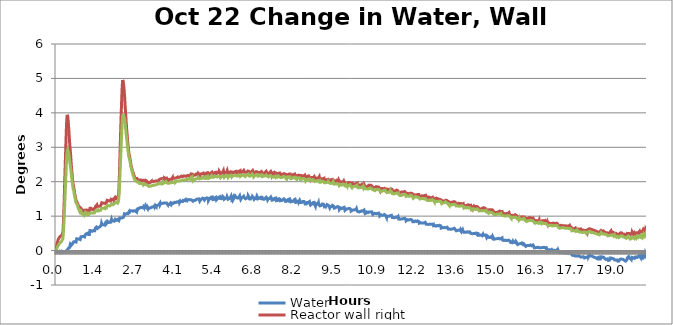
| Category | Water | Reactor wall right | Reactor wall left |
|---|---|---|---|
| 0.0015688980555555556 | 0 | 0 | 0 |
| 0.00782350138888889 | -0.005 | 0.065 | 0.011 |
| 0.014582213333333333 | -0.008 | 0.098 | 0.039 |
| 0.021356179999999975 | -0.013 | 0.163 | 0.031 |
| 0.02819274388888889 | -0.002 | 0.186 | 0.057 |
| 0.035027722222222224 | -0.028 | 0.219 | 0.075 |
| 0.041801709444444446 | -0.026 | 0.24 | 0.08 |
| 0.048545142500000006 | -0.026 | 0.24 | 0.111 |
| 0.05536494166666667 | -0.013 | 0.248 | 0.127 |
| 0.06215420833333333 | -0.019 | 0.29 | 0.132 |
| 0.06900455694444445 | -0.032 | 0.308 | 0.129 |
| 0.07573269305555556 | -0.031 | 0.326 | 0.147 |
| 0.08253722083333334 | -0.04 | 0.321 | 0.166 |
| 0.08931122805555555 | -0.035 | 0.337 | 0.155 |
| 0.09613239083333334 | -0.029 | 0.354 | 0.168 |
| 0.1029216488888889 | -0.011 | 0.368 | 0.171 |
| 0.10975673166666666 | -0.03 | 0.356 | 0.199 |
| 0.11651543166666667 | -0.021 | 0.363 | 0.191 |
| 0.12330468083333335 | -0.017 | 0.381 | 0.196 |
| 0.13009392916666668 | -0.02 | 0.383 | 0.215 |
| 0.13691374027777778 | -0.011 | 0.405 | 0.23 |
| 0.14376409777777777 | -0.015 | 0.386 | 0.243 |
| 0.15049225388888887 | -0.013 | 0.408 | 0.235 |
| 0.1572968027777775 | -0.029 | 0.412 | 0.233 |
| 0.16414852138888888 | -0.055 | 0.421 | 0.245 |
| 0.17093777444444444 | -0.034 | 0.435 | 0.235 |
| 0.17771176527777777 | -0.037 | 0.443 | 0.256 |
| 0.1844551841666664 | -0.042 | 0.441 | 0.256 |
| 0.19130553527777777 | -0.043 | 0.449 | 0.276 |
| 0.19807951694444417 | -0.025 | 0.443 | 0.287 |
| 0.2049146075 | -0.025 | 0.432 | 0.276 |
| 0.21167330194444442 | -0.035 | 0.471 | 0.302 |
| 0.21849310027777777 | -0.054 | 0.47 | 0.295 |
| 0.22525180277777776 | -0.044 | 0.497 | 0.313 |
| 0.23207299861111083 | -0.057 | 0.537 | 0.351 |
| 0.23890808166666666 | -0.062 | 0.601 | 0.4 |
| 0.24569733166666638 | -0.067 | 0.702 | 0.478 |
| 0.25245603694444446 | -0.049 | 0.854 | 0.589 |
| 0.2592605647222222 | -0.037 | 1.002 | 0.651 |
| 0.26609564138888886 | -0.039 | 1.181 | 0.774 |
| 0.2728696216666664 | -0.039 | 1.329 | 0.885 |
| 0.2796894411111111 | -0.049 | 1.534 | 1.026 |
| 0.28649396694444446 | -0.046 | 1.73 | 1.169 |
| 0.29328331416666664 | -0.049 | 1.944 | 1.301 |
| 0.30007385166666667 | -0.044 | 2.151 | 1.439 |
| 0.30686310527777777 | -0.028 | 2.348 | 1.59 |
| 0.3136676241666667 | -0.026 | 2.526 | 1.735 |
| 0.32050271027777777 | -0.033 | 2.71 | 1.878 |
| 0.32726142555555554 | -0.033 | 2.899 | 2.011 |
| 0.33406593888888886 | -0.041 | 3.085 | 2.151 |
| 0.3408857527777778 | -0.036 | 3.256 | 2.294 |
| 0.34762917444444447 | -0.008 | 3.434 | 2.449 |
| 0.35441843083333335 | -0.005 | 3.6 | 2.559 |
| 0.36126878972222226 | -0.005 | 3.736 | 2.684 |
| 0.3680288683333333 | -0.015 | 3.822 | 2.794 |
| 0.37483339777777774 | 0.016 | 3.896 | 2.835 |
| 0.3816379294444444 | 0.008 | 3.942 | 2.883 |
| 0.38841192611111114 | 0.021 | 3.924 | 2.909 |
| 0.3952317125 | 0.029 | 3.899 | 2.929 |
| 0.40195987027777774 | 0.036 | 3.868 | 2.934 |
| 0.4088102191666667 | 0.031 | 3.812 | 2.934 |
| 0.41561475194444447 | 0.041 | 3.738 | 2.904 |
| 0.422388725 | 0.072 | 3.677 | 2.858 |
| 0.4292085408333333 | 0.064 | 3.577 | 2.845 |
| 0.4359838988888889 | 0.054 | 3.498 | 2.809 |
| 0.44280370694444443 | 0.082 | 3.399 | 2.748 |
| 0.44957768388888886 | 0.082 | 3.312 | 2.717 |
| 0.45639748305555555 | 0.085 | 3.215 | 2.654 |
| 0.4631714613888889 | 0.09 | 3.126 | 2.626 |
| 0.46999126305555555 | 0.09 | 3.044 | 2.554 |
| 0.47676524111111107 | 0.142 | 3.002 | 2.54 |
| 0.4836003294444444 | 0.134 | 2.907 | 2.478 |
| 0.4903743013888889 | 0.19 | 2.849 | 2.456 |
| 0.49714827777777776 | 0.193 | 2.78 | 2.392 |
| 0.5039694702777778 | 0.2 | 2.683 | 2.349 |
| 0.5107740016666666 | 0.194 | 2.59 | 2.318 |
| 0.5175479813888889 | 0.178 | 2.507 | 2.244 |
| 0.5243372427777778 | 0.16 | 2.437 | 2.175 |
| 0.5311723083333333 | 0.181 | 2.374 | 2.134 |
| 0.5379768363888889 | 0.187 | 2.297 | 2.109 |
| 0.5447966475 | 0.158 | 2.239 | 2.045 |
| 0.5515706205555556 | 0.173 | 2.183 | 1.989 |
| 0.5583446075 | 0.165 | 2.089 | 1.956 |
| 0.5651338605555556 | 0.203 | 2.048 | 1.9 |
| 0.5719550447222223 | 0.183 | 1.999 | 1.854 |
| 0.5787595808333333 | 0.188 | 1.938 | 1.828 |
| 0.5855793852777778 | 0.217 | 1.912 | 1.777 |
| 0.5923228105555556 | 0.218 | 1.89 | 1.788 |
| 0.5991120758333334 | 0.254 | 1.856 | 1.75 |
| 0.6059318708333333 | 0.268 | 1.843 | 1.735 |
| 0.6127822222222222 | 0.26 | 1.781 | 1.689 |
| 0.6195561980555556 | 0.268 | 1.764 | 1.636 |
| 0.6263301805555556 | 0.265 | 1.725 | 1.625 |
| 0.6331347024999999 | 0.27 | 1.656 | 1.592 |
| 0.6399545183333333 | 0.26 | 1.646 | 1.562 |
| 0.6466993202777778 | 0.263 | 1.616 | 1.523 |
| 0.6535038536111111 | 0.26 | 1.577 | 1.49 |
| 0.6603389305555556 | 0.263 | 1.536 | 1.477 |
| 0.6671281891666667 | 0.273 | 1.529 | 1.421 |
| 0.6738716155555556 | 0.257 | 1.497 | 1.431 |
| 0.6806914233333334 | 0.248 | 1.458 | 1.391 |
| 0.6875112363888889 | 0.251 | 1.433 | 1.373 |
| 0.6943157755555556 | 0.307 | 1.485 | 1.397 |
| 0.7010897277777778 | 0.341 | 1.469 | 1.387 |
| 0.7078956550000001 | 0.325 | 1.436 | 1.364 |
| 0.7146696319444444 | 0.33 | 1.4 | 1.338 |
| 0.7215047113888888 | 0.335 | 1.413 | 1.336 |
| 0.7282787122222222 | 0.333 | 1.385 | 1.318 |
| 0.7350526725 | 0.343 | 1.364 | 1.3 |
| 0.7418724572222223 | 0.338 | 1.344 | 1.275 |
| 0.7486617244444445 | 0.335 | 1.336 | 1.254 |
| 0.7554509880555556 | 0.333 | 1.318 | 1.229 |
| 0.7622707813888889 | 0.33 | 1.303 | 1.216 |
| 0.7690447647222223 | 0.338 | 1.277 | 1.213 |
| 0.7758659566666667 | 0.351 | 1.265 | 1.201 |
| 0.7826399244444445 | 0.333 | 1.288 | 1.18 |
| 0.7894597311111111 | 0.328 | 1.255 | 1.162 |
| 0.7962795433333333 | 0.346 | 1.224 | 1.147 |
| 0.803022975 | 0.333 | 1.237 | 1.132 |
| 0.8097969466666667 | 0.312 | 1.217 | 1.134 |
| 0.8166778647222223 | 0.326 | 1.185 | 1.116 |
| 0.8234823705555555 | 0.32 | 1.197 | 1.119 |
| 0.8302563627777777 | 0.312 | 1.177 | 1.109 |
| 0.8370608897222223 | 0.364 | 1.211 | 1.138 |
| 0.8438654097222221 | 0.39 | 1.23 | 1.151 |
| 0.8506407724999999 | 0.401 | 1.233 | 1.135 |
| 0.8574147469444444 | 0.385 | 1.205 | 1.13 |
| 0.8642040255555556 | 0.403 | 1.22 | 1.12 |
| 0.8710544063888889 | 0.413 | 1.2 | 1.128 |
| 0.8778894580555555 | 0.401 | 1.215 | 1.11 |
| 0.884648166388889 | 0.388 | 1.179 | 1.064 |
| 0.8914221302777778 | 0.406 | 1.174 | 1.074 |
| 0.8982572041666667 | 0.398 | 1.177 | 1.092 |
| 0.9050311852777778 | 0.39 | 1.177 | 1.087 |
| 0.9118357147222222 | 0.395 | 1.177 | 1.082 |
| 0.9186110891666667 | 0.413 | 1.169 | 1.067 |
| 0.9253850527777778 | 0.395 | 1.161 | 1.061 |
| 0.9322048619444445 | 0.408 | 1.161 | 1.056 |
| 0.9389635783333333 | 0.403 | 1.146 | 1.056 |
| 0.9457833697222222 | 0.385 | 1.158 | 1.054 |
| 0.95260321 | 0.399 | 1.145 | 1.049 |
| 0.9594382613888889 | 0.394 | 1.124 | 1.023 |
| 0.9661816813888889 | 0.386 | 1.138 | 1.044 |
| 0.9730167616666666 | 0.395 | 1.152 | 1.044 |
| 0.9797907330555555 | 0.397 | 1.135 | 1.057 |
| 0.9865660986111111 | 0.407 | 1.14 | 1.057 |
| 0.9933859147222222 | 0.455 | 1.174 | 1.075 |
| 1.0007695252777777 | 0.473 | 1.183 | 1.099 |
| 1.0069796880555555 | 0.484 | 1.196 | 1.088 |
| 1.0137536694444444 | 0.478 | 1.193 | 1.088 |
| 1.0205276491666666 | 0.484 | 1.198 | 1.081 |
| 1.027316919722222 | 0.476 | 1.173 | 1.063 |
| 1.0341214355555555 | 0.489 | 1.181 | 1.073 |
| 1.0409412422222222 | 0.484 | 1.168 | 1.063 |
| 1.0477915833333333 | 0.478 | 1.181 | 1.05 |
| 1.054536411111111 | 0.478 | 1.181 | 1.07 |
| 1.0613714819444444 | 0.478 | 1.186 | 1.04 |
| 1.0681454594444444 | 0.499 | 1.163 | 1.081 |
| 1.0749958227777778 | 0.504 | 1.168 | 1.04 |
| 1.0817850691666666 | 0.492 | 1.166 | 1.035 |
| 1.0885743252777778 | 0.49 | 1.143 | 1.063 |
| 1.095348306388889 | 0.47 | 1.169 | 1.063 |
| 1.1021528366666666 | 0.458 | 1.159 | 1.042 |
| 1.1089268027777777 | 0.454 | 1.129 | 1.037 |
| 1.1157021827777778 | 0.471 | 1.157 | 1.047 |
| 1.1225219744444443 | 0.456 | 1.137 | 1.042 |
| 1.129341791388889 | 0.477 | 1.15 | 1.022 |
| 1.1361157586111112 | 0.469 | 1.15 | 1.035 |
| 1.142905021388889 | 0.487 | 1.172 | 1.053 |
| 1.1496790024999972 | 0.538 | 1.193 | 1.077 |
| 1.1564682569444444 | 0.582 | 1.228 | 1.105 |
| 1.1633033247222222 | 0.572 | 1.215 | 1.102 |
| 1.1700773027777778 | 0.572 | 1.223 | 1.1 |
| 1.1769276594444444 | 0.572 | 1.212 | 1.097 |
| 1.1837169147222222 | 0.572 | 1.23 | 1.102 |
| 1.1905228266666668 | 0.556 | 1.228 | 1.097 |
| 1.1972968138888862 | 0.577 | 1.228 | 1.09 |
| 1.2040555141666667 | 0.584 | 1.21 | 1.113 |
| 1.2108447916666667 | 0.592 | 1.21 | 1.095 |
| 1.217679843888889 | 0.583 | 1.206 | 1.1 |
| 1.224484366388889 | 0.571 | 1.217 | 1.09 |
| 1.231319474722222 | 0.567 | 1.198 | 1.09 |
| 1.2381087097222223 | 0.56 | 1.207 | 1.097 |
| 1.24489797 | 0.554 | 1.199 | 1.095 |
| 1.2516719377777752 | 0.562 | 1.199 | 1.092 |
| 1.2584473013888888 | 0.565 | 1.202 | 1.082 |
| 1.265236555 | 0.557 | 1.217 | 1.1 |
| 1.2720869191666666 | 0.554 | 1.187 | 1.09 |
| 1.2788608852777779 | 0.582 | 1.205 | 1.087 |
| 1.2856654252777777 | 0.56 | 1.202 | 1.077 |
| 1.2924393972222221 | 0.562 | 1.217 | 1.095 |
| 1.2992286588888888 | 0.572 | 1.202 | 1.095 |
| 1.3060790072222221 | 0.56 | 1.194 | 1.097 |
| 1.3128529816666665 | 0.58 | 1.197 | 1.095 |
| 1.3196422438888888 | 0.577 | 1.212 | 1.087 |
| 1.3264634291666668 | 0.575 | 1.215 | 1.102 |
| 1.3332374180555555 | 0.598 | 1.232 | 1.095 |
| 1.3400266677777777 | 0.654 | 1.25 | 1.147 |
| 1.3468159219444444 | 0.644 | 1.281 | 1.142 |
| 1.3536204777777752 | 0.673 | 1.291 | 1.157 |
| 1.360424986111111 | 0.672 | 1.303 | 1.173 |
| 1.3672295063888888 | 0.667 | 1.295 | 1.165 |
| 1.374003474722222 | 0.677 | 1.295 | 1.147 |
| 1.3808538380555557 | 0.684 | 1.304 | 1.155 |
| 1.3876583636111084 | 0.67 | 1.322 | 1.16 |
| 1.3944642833333334 | 0.678 | 1.281 | 1.155 |
| 1.4012382591666668 | 0.655 | 1.293 | 1.155 |
| 1.408012251111111 | 0.665 | 1.293 | 1.168 |
| 1.4148344780555555 | 0.645 | 1.287 | 1.152 |
| 1.4216212966666666 | 0.663 | 1.295 | 1.18 |
| 1.4284258255555555 | 0.65 | 1.303 | 1.157 |
| 1.4351998099999999 | 0.665 | 1.285 | 1.15 |
| 1.4420043347222196 | 0.668 | 1.313 | 1.168 |
| 1.4487783447222222 | 0.668 | 1.282 | 1.157 |
| 1.4555536699999974 | 0.673 | 1.287 | 1.168 |
| 1.4624193044444445 | 0.66 | 1.3 | 1.17 |
| 1.4691780169444446 | 0.66 | 1.3 | 1.16 |
| 1.4760283608333333 | 0.691 | 1.285 | 1.157 |
| 1.482756513888886 | 0.676 | 1.28 | 1.183 |
| 1.4895763208333335 | 0.673 | 1.298 | 1.168 |
| 1.49636558 | 0.691 | 1.29 | 1.175 |
| 1.503170106388889 | 0.673 | 1.31 | 1.147 |
| 1.5099441594444418 | 0.688 | 1.29 | 1.157 |
| 1.5168097049999973 | 0.671 | 1.29 | 1.168 |
| 1.523583688888889 | 0.678 | 1.305 | 1.152 |
| 1.5303896222222195 | 0.707 | 1.322 | 1.199 |
| 1.5371483013888887 | 0.734 | 1.337 | 1.189 |
| 1.5439375638888888 | 0.761 | 1.359 | 1.23 |
| 1.550772642222222 | 0.796 | 1.381 | 1.235 |
| 1.5575771747222222 | 0.789 | 1.389 | 1.23 |
| 1.564351153611111 | 0.771 | 1.401 | 1.228 |
| 1.571125123611111 | 0.749 | 1.372 | 1.235 |
| 1.5779143736111083 | 0.768 | 1.372 | 1.23 |
| 1.5847647394444417 | 0.759 | 1.365 | 1.225 |
| 1.5914942797222196 | 0.764 | 1.37 | 1.238 |
| 1.5982987994444418 | 0.761 | 1.373 | 1.24 |
| 1.6051186175 | 0.771 | 1.391 | 1.248 |
| 1.6119078608333333 | 0.753 | 1.376 | 1.228 |
| 1.6187582363888888 | 0.764 | 1.363 | 1.22 |
| 1.6254558280555553 | 0.761 | 1.37 | 1.233 |
| 1.6323367380555556 | 0.761 | 1.373 | 1.23 |
| 1.6391107030555556 | 0.764 | 1.383 | 1.238 |
| 1.6458999597222221 | 0.743 | 1.386 | 1.24 |
| 1.6527350522222224 | 0.746 | 1.368 | 1.243 |
| 1.6595395669444444 | 0.761 | 1.373 | 1.24 |
| 1.666314932777775 | 0.746 | 1.37 | 1.22 |
| 1.6730889033333307 | 0.782 | 1.383 | 1.23 |
| 1.679862885 | 0.769 | 1.368 | 1.256 |
| 1.6866979702777778 | 0.751 | 1.393 | 1.253 |
| 1.6934719411111083 | 0.776 | 1.376 | 1.256 |
| 1.7003528541666666 | 0.761 | 1.386 | 1.251 |
| 1.7070810069444444 | 0.759 | 1.381 | 1.24 |
| 1.713931355 | 0.77 | 1.385 | 1.248 |
| 1.7207053402777779 | 0.783 | 1.395 | 1.243 |
| 1.7275098711111083 | 0.819 | 1.425 | 1.267 |
| 1.7342852333333334 | 0.828 | 1.429 | 1.28 |
| 1.7410592077777751 | 0.841 | 1.46 | 1.285 |
| 1.7478637358333307 | 0.851 | 1.473 | 1.295 |
| 1.7546377144444445 | 0.832 | 1.452 | 1.311 |
| 1.7614422413888888 | 0.831 | 1.456 | 1.3 |
| 1.7682467791666667 | 0.829 | 1.443 | 1.29 |
| 1.7750360263888887 | 0.831 | 1.451 | 1.298 |
| 1.7818863780555554 | 0.831 | 1.451 | 1.305 |
| 1.7886757355555556 | 0.816 | 1.453 | 1.298 |
| 1.7954954569444446 | 0.834 | 1.451 | 1.305 |
| 1.8022709058333306 | 0.826 | 1.443 | 1.316 |
| 1.8090295291666667 | 0.819 | 1.453 | 1.305 |
| 1.8158034922222221 | 0.816 | 1.438 | 1.29 |
| 1.8226232841666665 | 0.824 | 1.441 | 1.293 |
| 1.8294889358333333 | 0.821 | 1.438 | 1.311 |
| 1.8362170794444417 | 0.813 | 1.441 | 1.295 |
| 1.8431132527777776 | 0.821 | 1.441 | 1.295 |
| 1.8498566891666666 | 0.824 | 1.436 | 1.3 |
| 1.8566306583333332 | 0.826 | 1.448 | 1.28 |
| 1.863404638888889 | 0.824 | 1.441 | 1.305 |
| 1.870241106111111 | 0.825 | 1.44 | 1.303 |
| 1.8770150858333332 | 0.878 | 1.49 | 1.329 |
| 1.8838348908333307 | 0.875 | 1.497 | 1.358 |
| 1.8906088780555557 | 0.911 | 1.511 | 1.353 |
| 1.8974134091666666 | 0.899 | 1.503 | 1.363 |
| 1.9042179269444444 | 0.871 | 1.507 | 1.348 |
| 1.9110224883333333 | 0.866 | 1.483 | 1.366 |
| 1.9177658941666667 | 0.873 | 1.478 | 1.35 |
| 1.9245704202777778 | 0.881 | 1.49 | 1.376 |
| 1.9314054911111112 | 0.861 | 1.49 | 1.355 |
| 1.9381808530555558 | 0.858 | 1.496 | 1.335 |
| 1.9449701169444442 | 0.863 | 1.478 | 1.343 |
| 1.9517746413888888 | 0.879 | 1.485 | 1.355 |
| 1.9585486247222221 | 0.873 | 1.501 | 1.35 |
| 1.9653989730555557 | 0.851 | 1.483 | 1.343 |
| 1.972172948611111 | 0.856 | 1.468 | 1.355 |
| 1.978977531111111 | 0.851 | 1.498 | 1.355 |
| 1.9857972797222223 | 0.853 | 1.475 | 1.345 |
| 1.9926018249999973 | 0.843 | 1.493 | 1.337 |
| 1.999391066111111 | 0.851 | 1.48 | 1.335 |
| 2.0061969919444445 | 0.844 | 1.477 | 1.34 |
| 2.0130015186111083 | 0.874 | 1.51 | 1.369 |
| 2.0197602119444444 | 0.909 | 1.549 | 1.392 |
| 2.026534192777775 | 0.923 | 1.538 | 1.413 |
| 2.0333387283333306 | 0.927 | 1.548 | 1.398 |
| 2.0400821525 | 0.916 | 1.547 | 1.4 |
| 2.046963056666667 | 0.908 | 1.533 | 1.408 |
| 2.0537370325 | 0.908 | 1.512 | 1.387 |
| 2.0605415774999973 | 0.88 | 1.525 | 1.408 |
| 2.067346096111111 | 0.895 | 1.538 | 1.398 |
| 2.0741367519444442 | 0.9 | 1.53 | 1.4 |
| 2.080895486388889 | 0.9 | 1.528 | 1.398 |
| 2.0877305169444416 | 0.908 | 1.528 | 1.41 |
| 2.0945350419444417 | 0.877 | 1.535 | 1.385 |
| 2.1013395780555526 | 0.903 | 1.515 | 1.38 |
| 2.1081135605555557 | 0.885 | 1.522 | 1.387 |
| 2.1149333536111112 | 0.882 | 1.52 | 1.392 |
| 2.1216920594444444 | 0.885 | 1.543 | 1.413 |
| 2.1285118699999974 | 0.885 | 1.612 | 1.436 |
| 2.135331668055553 | 0.885 | 1.653 | 1.477 |
| 2.142091763611111 | 0.872 | 1.77 | 1.553 |
| 2.1489268397222197 | 0.872 | 1.882 | 1.617 |
| 2.1557313674999974 | 0.88 | 2.053 | 1.709 |
| 2.162520618611111 | 0.87 | 2.227 | 1.831 |
| 2.169309871388886 | 0.947 | 2.442 | 1.988 |
| 2.1760991402777776 | 0.931 | 2.637 | 2.108 |
| 2.182888400555553 | 0.948 | 2.834 | 2.271 |
| 2.1897081808333336 | 0.941 | 3.048 | 2.407 |
| 2.19645162 | 0.942 | 3.241 | 2.545 |
| 2.203378344722222 | 0.953 | 3.438 | 2.675 |
| 2.2101231575 | 0.942 | 3.629 | 2.818 |
| 2.2168665880555554 | 0.932 | 3.82 | 2.95 |
| 2.223686393611111 | 0.958 | 4.014 | 3.116 |
| 2.2304603730555557 | 0.948 | 4.172 | 3.218 |
| 2.237295446944444 | 0.937 | 4.338 | 3.369 |
| 2.2440541599999975 | 0.937 | 4.491 | 3.496 |
| 2.2508434116666667 | 0.95 | 4.66 | 3.626 |
| 2.2576326769444446 | 0.948 | 4.787 | 3.728 |
| 2.2644524605555554 | 0.965 | 4.864 | 3.82 |
| 2.2712722724999974 | 0.948 | 4.951 | 3.892 |
| 2.2781073491666666 | 0.965 | 4.94 | 3.922 |
| 2.2848827238888862 | 0.958 | 4.958 | 3.961 |
| 2.2916108594444444 | 0.963 | 4.91 | 3.963 |
| 2.2984459411111082 | 0.991 | 4.882 | 3.943 |
| 2.3052657436111113 | 0.965 | 4.823 | 3.945 |
| 2.312039726111111 | 0.99 | 4.766 | 3.9 |
| 2.318844263888889 | 1.005 | 4.697 | 3.887 |
| 2.325618239166667 | 1.038 | 4.637 | 3.88 |
| 2.3324380444444417 | 1.069 | 4.537 | 3.85 |
| 2.339212034444442 | 1.054 | 4.472 | 3.824 |
| 2.3460179283333336 | 1.059 | 4.36 | 3.758 |
| 2.352791915 | 1.048 | 4.268 | 3.712 |
| 2.3596270833333306 | 1.054 | 4.153 | 3.653 |
| 2.3664926261111114 | 1.064 | 4.087 | 3.597 |
| 2.3732207741666667 | 1.059 | 3.982 | 3.544 |
| 2.3799947711111082 | 1.064 | 3.893 | 3.498 |
| 2.386768728888889 | 1.069 | 3.794 | 3.431 |
| 2.3936038063888887 | 1.074 | 3.704 | 3.373 |
| 2.400408333888889 | 1.071 | 3.651 | 3.345 |
| 2.407182312777775 | 1.061 | 3.538 | 3.26 |
| 2.4140035125 | 1.074 | 3.475 | 3.22 |
| 2.420777488611111 | 1.074 | 3.416 | 3.174 |
| 2.427582009166664 | 1.076 | 3.339 | 3.094 |
| 2.4343712655555554 | 1.071 | 3.27 | 3.046 |
| 2.441221621388889 | 1.071 | 3.191 | 3.008 |
| 2.4479956958333333 | 1.071 | 3.138 | 2.957 |
| 2.4548001372222195 | 1.069 | 3.077 | 2.901 |
| 2.4615588380555526 | 1.092 | 3.023 | 2.883 |
| 2.468409192222222 | 1.093 | 2.972 | 2.814 |
| 2.4751984480555556 | 1.089 | 2.904 | 2.763 |
| 2.481943261666664 | 1.11 | 2.877 | 2.763 |
| 2.4887630644444445 | 1.077 | 2.809 | 2.717 |
| 2.495537052222222 | 1.105 | 2.8 | 2.697 |
| 2.5023721227777775 | 1.138 | 2.781 | 2.67 |
| 2.509161376388886 | 1.147 | 2.744 | 2.66 |
| 2.5159353488888887 | 1.137 | 2.71 | 2.624 |
| 2.522770432499997 | 1.165 | 2.662 | 2.588 |
| 2.5295749761111086 | 1.144 | 2.639 | 2.552 |
| 2.536333667222219 | 1.152 | 2.606 | 2.519 |
| 2.543107653888889 | 1.154 | 2.568 | 2.481 |
| 2.5499732863888886 | 1.152 | 2.524 | 2.445 |
| 2.5567333602777778 | 1.167 | 2.504 | 2.448 |
| 2.5635684433333306 | 1.139 | 2.455 | 2.42 |
| 2.5703424261111083 | 1.139 | 2.455 | 2.379 |
| 2.5771316825 | 1.159 | 2.417 | 2.348 |
| 2.5839056605555557 | 1.154 | 2.384 | 2.328 |
| 2.590710195277778 | 1.162 | 2.358 | 2.315 |
| 2.597484158888886 | 1.165 | 2.34 | 2.284 |
| 2.604319243055553 | 1.159 | 2.317 | 2.261 |
| 2.611108494722222 | 1.142 | 2.3 | 2.249 |
| 2.6179588394444444 | 1.147 | 2.277 | 2.218 |
| 2.6247189358333336 | 1.144 | 2.287 | 2.21 |
| 2.6315234697222194 | 1.147 | 2.264 | 2.177 |
| 2.6382975405555555 | 1.142 | 2.236 | 2.185 |
| 2.6450714269444418 | 1.159 | 2.208 | 2.152 |
| 2.651891222777775 | 1.159 | 2.215 | 2.142 |
| 2.658711029166664 | 1.144 | 2.208 | 2.126 |
| 2.6655003002777775 | 1.157 | 2.182 | 2.093 |
| 2.672274261111111 | 1.167 | 2.159 | 2.088 |
| 2.679094068888889 | 1.159 | 2.144 | 2.093 |
| 2.6858541622222196 | 1.165 | 2.121 | 2.078 |
| 2.6927197855555556 | 1.152 | 2.134 | 2.05 |
| 2.6994937691666667 | 1.158 | 2.108 | 2.047 |
| 2.706252467777775 | 1.148 | 2.094 | 2.047 |
| 2.7131028269444446 | 1.141 | 2.08 | 2.022 |
| 2.7198768141666667 | 1.153 | 2.076 | 2.032 |
| 2.726681423611111 | 1.128 | 2.091 | 2.017 |
| 2.733455307222222 | 1.163 | 2.07 | 2.022 |
| 2.7402140147222194 | 1.133 | 2.058 | 2.004 |
| 2.747049093888886 | 1.121 | 2.066 | 1.999 |
| 2.7538702847222223 | 1.192 | 2.092 | 2.015 |
| 2.760674812777778 | 1.176 | 2.072 | 1.997 |
| 2.7674487980555527 | 1.145 | 2.055 | 1.991 |
| 2.7742227755555557 | 1.216 | 2.08 | 1.997 |
| 2.7810273038888886 | 1.182 | 2.059 | 1.999 |
| 2.787862385 | 1.211 | 2.057 | 2.005 |
| 2.7946363566666665 | 1.219 | 2.077 | 1.995 |
| 2.8014103400000003 | 1.206 | 2.062 | 1.982 |
| 2.808260693888889 | 1.217 | 2.056 | 1.992 |
| 2.815034676666667 | 1.227 | 2.076 | 1.99 |
| 2.821869751111111 | 1.237 | 2.069 | 1.982 |
| 2.8286146311111113 | 1.24 | 2.071 | 1.982 |
| 2.8353885463888893 | 1.226 | 2.064 | 1.964 |
| 2.842254164444445 | 1.21 | 2.046 | 1.951 |
| 2.84902815 | 1.238 | 2.038 | 1.946 |
| 2.8558174016666666 | 1.24 | 2.046 | 1.957 |
| 2.8626830386111113 | 1.225 | 2.038 | 1.967 |
| 2.869426457222222 | 1.24 | 2.051 | 1.957 |
| 2.8762004411111115 | 1.25 | 2.048 | 1.949 |
| 2.8830507944444443 | 1.242 | 2.043 | 1.954 |
| 2.8898247772222225 | 1.248 | 2.051 | 1.934 |
| 2.896630694166667 | 1.25 | 2.041 | 1.951 |
| 2.9034046725000002 | 1.235 | 2.041 | 1.941 |
| 2.910193925833333 | 1.25 | 2.048 | 1.929 |
| 2.9169679841666665 | 1.253 | 2.038 | 1.931 |
| 2.9237877052777774 | 1.253 | 2.036 | 1.939 |
| 2.9305616825 | 1.255 | 2.023 | 1.939 |
| 2.9373662141666665 | 1.265 | 2.036 | 1.954 |
| 2.944216556666667 | 1.273 | 2.033 | 1.951 |
| 2.9509905575 | 1.253 | 2.025 | 1.941 |
| 2.9577950730555553 | 1.242 | 2.025 | 1.934 |
| 2.96461626 | 1.263 | 2.028 | 1.939 |
| 2.9713749830555556 | 1.255 | 2.043 | 1.941 |
| 2.9781336683333333 | 1.253 | 2.041 | 1.908 |
| 2.9849840461111112 | 1.278 | 2.025 | 1.929 |
| 2.991758006111111 | 1.268 | 2.028 | 1.921 |
| 2.998562535277778 | 1.278 | 2.031 | 1.921 |
| 3.0053976152777775 | 1.248 | 2.046 | 1.921 |
| 3.0121410324999998 | 1.278 | 2.038 | 1.941 |
| 3.018930319722222 | 1.291 | 2.025 | 1.929 |
| 3.0257654016666664 | 1.263 | 2.025 | 1.921 |
| 3.032510188888889 | 1.271 | 2.013 | 1.923 |
| 3.0393300033333333 | 1.251 | 2.007 | 1.923 |
| 3.0461192419444445 | 1.278 | 2.008 | 1.923 |
| 3.0528932216666664 | 1.264 | 2.02 | 1.918 |
| 3.0597435902777774 | 1.294 | 2.038 | 1.921 |
| 3.066532839166667 | 1.291 | 2.033 | 1.923 |
| 3.073306818888889 | 1.301 | 2.036 | 1.908 |
| 3.080126616388889 | 1.264 | 2.035 | 1.916 |
| 3.086931140555556 | 1.275 | 2.024 | 1.931 |
| 3.0937065091666667 | 1.265 | 2.029 | 1.905 |
| 3.100511035833333 | 1.275 | 2.016 | 1.908 |
| 3.1073155722222223 | 1.243 | 1.988 | 1.879 |
| 3.114150643611111 | 1.262 | 2.003 | 1.892 |
| 3.1209246330555556 | 1.217 | 1.973 | 1.887 |
| 3.127698605833333 | 1.253 | 2.011 | 1.89 |
| 3.1345031380555555 | 1.266 | 2 | 1.895 |
| 3.1412771108333337 | 1.228 | 1.977 | 1.887 |
| 3.1481274947222224 | 1.235 | 2.001 | 1.887 |
| 3.154901448888889 | 1.213 | 1.974 | 1.879 |
| 3.161705996666667 | 1.22 | 1.982 | 1.874 |
| 3.1684813369444442 | 1.218 | 1.974 | 1.863 |
| 3.1752553316666665 | 1.218 | 1.982 | 1.871 |
| 3.182059845 | 1.233 | 1.964 | 1.881 |
| 3.1888949216666664 | 1.223 | 1.964 | 1.869 |
| 3.195668917222222 | 1.236 | 1.982 | 1.879 |
| 3.202412330277778 | 1.238 | 1.972 | 1.876 |
| 3.2092474141666667 | 1.236 | 1.984 | 1.871 |
| 3.2160824988888885 | 1.233 | 1.984 | 1.889 |
| 3.2228717405555556 | 1.23 | 1.982 | 1.886 |
| 3.2296471077777777 | 1.246 | 1.989 | 1.866 |
| 3.2364516397222225 | 1.246 | 1.984 | 1.884 |
| 3.2432561672222224 | 1.243 | 2 | 1.891 |
| 3.250014882222222 | 1.243 | 2.002 | 1.874 |
| 3.2568194002777777 | 1.253 | 2.012 | 1.884 |
| 3.263654486111111 | 1.243 | 1.974 | 1.881 |
| 3.270428454444444 | 1.256 | 1.969 | 1.897 |
| 3.2772177105555556 | 1.264 | 2.007 | 1.881 |
| 3.284052798611111 | 1.258 | 1.989 | 1.894 |
| 3.2908115158333335 | 1.266 | 1.989 | 1.894 |
| 3.297646571111111 | 1.261 | 2.002 | 1.886 |
| 3.3044372161111113 | 1.266 | 1.997 | 1.891 |
| 3.3112111919444445 | 1.258 | 1.989 | 1.889 |
| 3.3180310083333335 | 1.269 | 2.002 | 1.891 |
| 3.3248049975 | 1.284 | 1.989 | 1.889 |
| 3.3316400600000002 | 1.261 | 2.002 | 1.897 |
| 3.3384904213888893 | 1.264 | 1.997 | 1.899 |
| 3.345218567222222 | 1.258 | 2.01 | 1.899 |
| 3.3520383625 | 1.299 | 1.992 | 1.891 |
| 3.358797070277778 | 1.271 | 2.015 | 1.914 |
| 3.365572445277778 | 1.269 | 2.017 | 1.904 |
| 3.3724075269444445 | 1.279 | 2.017 | 1.902 |
| 3.379227323333333 | 1.289 | 2.005 | 1.92 |
| 3.385955478611111 | 1.31 | 2.005 | 1.894 |
| 3.392775281388889 | 1.289 | 2.023 | 1.899 |
| 3.3996103505555553 | 1.299 | 2.02 | 1.92 |
| 3.4063843269444445 | 1.294 | 2.012 | 1.889 |
| 3.413158314722222 | 1.281 | 2.005 | 1.914 |
| 3.4200086669444443 | 1.274 | 2.02 | 1.922 |
| 3.4268132397222226 | 1.31 | 2.015 | 1.927 |
| 3.4335871680555554 | 1.317 | 2.035 | 1.932 |
| 3.4403625513888887 | 1.287 | 2.025 | 1.912 |
| 3.4471365172222224 | 1.315 | 2.005 | 1.907 |
| 3.453941049166666 | 1.304 | 2.01 | 1.922 |
| 3.460760858333333 | 1.315 | 2.03 | 1.909 |
| 3.4675653816666667 | 1.315 | 2.028 | 1.92 |
| 3.4743546408333335 | 1.326 | 2.042 | 1.927 |
| 3.481143890833333 | 1.322 | 2.023 | 1.953 |
| 3.4879178708333334 | 1.344 | 2.035 | 1.95 |
| 3.4947529555555557 | 1.328 | 2.039 | 1.943 |
| 3.501588036388889 | 1.33 | 2.047 | 1.925 |
| 3.508348116666667 | 1.331 | 2.041 | 1.932 |
| 3.5151831944444445 | 1.345 | 2.044 | 1.937 |
| 3.5219571769444444 | 1.339 | 2.064 | 1.945 |
| 3.5287311575 | 1.343 | 2.064 | 1.917 |
| 3.5355662330555555 | 1.355 | 2.073 | 1.925 |
| 3.5424013175000004 | 1.375 | 2.07 | 1.94 |
| 3.54914474 | 1.34 | 2.069 | 1.95 |
| 3.5559339963888887 | 1.351 | 2.07 | 1.95 |
| 3.5627385233333335 | 1.36 | 2.08 | 1.94 |
| 3.5695124977777777 | 1.378 | 2.067 | 1.958 |
| 3.576318428611111 | 1.364 | 2.073 | 1.953 |
| 3.5830618399999996 | 1.379 | 2.08 | 1.968 |
| 3.58992748 | 1.353 | 2.075 | 1.963 |
| 3.596716732777778 | 1.379 | 2.07 | 1.945 |
| 3.603551806111111 | 1.371 | 2.09 | 1.943 |
| 3.6103257911111113 | 1.369 | 2.073 | 1.96 |
| 3.6171303330555555 | 1.371 | 2.067 | 1.953 |
| 3.623904291666667 | 1.369 | 2.095 | 1.976 |
| 3.630647715277778 | 1.379 | 2.083 | 1.943 |
| 3.6375133497222225 | 1.384 | 2.078 | 1.958 |
| 3.6443192630555554 | 1.374 | 2.093 | 1.968 |
| 3.651123798333334 | 1.374 | 2.106 | 1.958 |
| 3.657897778611111 | 1.369 | 2.098 | 1.971 |
| 3.6646564844444445 | 1.387 | 2.098 | 1.963 |
| 3.671476275555556 | 1.371 | 2.09 | 1.958 |
| 3.678250265 | 1.376 | 2.108 | 1.971 |
| 3.685054791388889 | 1.384 | 2.073 | 1.971 |
| 3.691859323888889 | 1.384 | 2.116 | 1.976 |
| 3.698694398333333 | 1.371 | 2.103 | 1.981 |
| 3.705468395833333 | 1.384 | 2.095 | 1.978 |
| 3.7122437436111113 | 1.384 | 2.116 | 1.981 |
| 3.7190482697222222 | 1.376 | 2.108 | 1.988 |
| 3.725822245 | 1.389 | 2.09 | 1.978 |
| 3.7326573205555555 | 1.381 | 2.095 | 1.986 |
| 3.739431311111111 | 1.381 | 2.111 | 1.976 |
| 3.7462816652777775 | 1.397 | 2.106 | 1.976 |
| 3.753055647777778 | 1.399 | 2.108 | 2.006 |
| 3.759844895277778 | 1.381 | 2.121 | 1.996 |
| 3.766618866388889 | 1.381 | 2.118 | 1.991 |
| 3.7734081566666666 | 1.38 | 2.106 | 1.981 |
| 3.7802293116666665 | 1.373 | 2.086 | 1.965 |
| 3.7870185672222223 | 1.381 | 2.086 | 1.975 |
| 3.793823100277778 | 1.364 | 2.086 | 1.978 |
| 3.8005970855555558 | 1.377 | 2.083 | 1.952 |
| 3.8074474636111115 | 1.339 | 2.052 | 1.964 |
| 3.8142366825 | 1.379 | 2.088 | 1.972 |
| 3.8210106680555556 | 1.37 | 2.082 | 1.954 |
| 3.8277846452777777 | 1.354 | 2.055 | 1.952 |
| 3.8345891783333332 | 1.334 | 2.062 | 1.944 |
| 3.841393793611111 | 1.326 | 2.052 | 1.954 |
| 3.848214886944444 | 1.326 | 2.042 | 1.944 |
| 3.855004154444445 | 1.339 | 2.065 | 1.931 |
| 3.861778132777778 | 1.316 | 2.067 | 1.956 |
| 3.8685826597222226 | 1.334 | 2.062 | 1.939 |
| 3.8754177247222223 | 1.344 | 2.059 | 1.944 |
| 3.8821917158333332 | 1.352 | 2.067 | 1.974 |
| 3.8889656794444445 | 1.349 | 2.077 | 1.962 |
| 3.8958160463888887 | 1.354 | 2.062 | 1.949 |
| 3.9025900211111115 | 1.374 | 2.059 | 1.967 |
| 3.9093945544444444 | 1.352 | 2.075 | 1.962 |
| 3.9161699266666665 | 1.354 | 2.082 | 1.964 |
| 3.922959176388889 | 1.372 | 2.085 | 1.962 |
| 3.9297942497222222 | 1.334 | 2.067 | 1.982 |
| 3.9365376730555557 | 1.362 | 2.085 | 1.956 |
| 3.9433727616666667 | 1.357 | 2.08 | 1.977 |
| 3.9501467302777775 | 1.362 | 2.07 | 1.967 |
| 3.9569665366666666 | 1.357 | 2.093 | 1.974 |
| 3.9638474494444447 | 1.382 | 2.082 | 1.954 |
| 3.97059087 | 1.374 | 2.09 | 1.985 |
| 3.9773648538888886 | 1.377 | 2.113 | 1.977 |
| 3.9842152133333335 | 1.372 | 2.077 | 1.974 |
| 3.9909905752777775 | 1.367 | 2.116 | 1.992 |
| 3.997764551666667 | 1.387 | 2.1 | 1.979 |
| 4.004553811388889 | 1.372 | 2.103 | 1.977 |
| 4.011358331111111 | 1.38 | 2.093 | 1.992 |
| 4.018147593888889 | 1.387 | 2.121 | 1.987 |
| 4.024921558333333 | 1.382 | 2.108 | 1.99 |
| 4.031771928055556 | 1.377 | 2.1 | 1.987 |
| 4.038545898611111 | 1.395 | 2.103 | 2.005 |
| 4.0453504375 | 1.403 | 2.1 | 1.982 |
| 4.052125792777778 | 1.405 | 2.103 | 1.987 |
| 4.058915054444444 | 1.382 | 2.103 | 1.997 |
| 4.065689042222222 | 1.382 | 2.11 | 2.018 |
| 4.0726004811111105 | 1.392 | 2.108 | 1.985 |
| 4.0793744627777775 | 1.392 | 2.116 | 1.992 |
| 4.086102619166667 | 1.397 | 2.131 | 2.005 |
| 4.092876605833333 | 1.397 | 2.105 | 1.997 |
| 4.099681119722223 | 1.382 | 2.121 | 1.99 |
| 4.1064703683333335 | 1.39 | 2.113 | 2.013 |
| 4.113305452222222 | 1.415 | 2.113 | 2.02 |
| 4.1200808122222226 | 1.415 | 2.136 | 2.013 |
| 4.126931186388889 | 1.415 | 2.136 | 1.997 |
| 4.133705150277778 | 1.397 | 2.131 | 2.005 |
| 4.140540225833333 | 1.413 | 2.118 | 2.013 |
| 4.1472989516666665 | 1.403 | 2.133 | 2.005 |
| 4.154072907222222 | 1.392 | 2.139 | 2.023 |
| 4.160846886944444 | 1.413 | 2.131 | 2.023 |
| 4.167712525833333 | 1.405 | 2.118 | 2.03 |
| 4.174501773055556 | 1.415 | 2.133 | 2.013 |
| 4.181306311111111 | 1.4 | 2.139 | 2.007 |
| 4.188081668055556 | 1.413 | 2.136 | 2.01 |
| 4.194855642777778 | 1.41 | 2.126 | 2.02 |
| 4.201644905833334 | 1.428 | 2.141 | 2.043 |
| 4.208449437222222 | 1.436 | 2.133 | 2.038 |
| 4.2152234080555555 | 1.4 | 2.128 | 2.013 |
| 4.222058523055556 | 1.418 | 2.123 | 2.02 |
| 4.2288782919444445 | 1.42 | 2.144 | 2.03 |
| 4.235636984444445 | 1.433 | 2.139 | 2.018 |
| 4.242456799166667 | 1.423 | 2.149 | 2.038 |
| 4.249261327777778 | 1.426 | 2.151 | 2.018 |
| 4.256036689166667 | 1.423 | 2.131 | 2.036 |
| 4.262810671111111 | 1.413 | 2.146 | 2.025 |
| 4.269599926666666 | 1.436 | 2.149 | 2.03 |
| 4.276450292222222 | 1.423 | 2.162 | 2.041 |
| 4.2832548161111115 | 1.42 | 2.141 | 2.02 |
| 4.2900593575 | 1.428 | 2.164 | 2.036 |
| 4.296863867222222 | 1.443 | 2.146 | 2.033 |
| 4.303653137222222 | 1.431 | 2.149 | 2.038 |
| 4.310396643888889 | 1.433 | 2.139 | 2.025 |
| 4.317201081944445 | 1.426 | 2.146 | 2.048 |
| 4.3240375525 | 1.446 | 2.149 | 2.053 |
| 4.33081153 | 1.456 | 2.146 | 2.041 |
| 4.337585498611111 | 1.431 | 2.164 | 2.053 |
| 4.344405329444444 | 1.451 | 2.154 | 2.041 |
| 4.351225112222222 | 1.433 | 2.169 | 2.051 |
| 4.35802964 | 1.441 | 2.169 | 2.048 |
| 4.364834167222222 | 1.451 | 2.156 | 2.03 |
| 4.371608143333334 | 1.451 | 2.172 | 2.046 |
| 4.378382125277778 | 1.436 | 2.154 | 2.064 |
| 4.385217195555556 | 1.446 | 2.146 | 2.064 |
| 4.391977293888889 | 1.454 | 2.159 | 2.046 |
| 4.398797100555555 | 1.436 | 2.167 | 2.056 |
| 4.405571067777778 | 1.454 | 2.159 | 2.076 |
| 4.4123603325000005 | 1.479 | 2.169 | 2.053 |
| 4.419210681666667 | 1.448 | 2.141 | 2.069 |
| 4.425984669722222 | 1.443 | 2.151 | 2.064 |
| 4.432789200277778 | 1.451 | 2.156 | 2.064 |
| 4.439563171111112 | 1.454 | 2.156 | 2.061 |
| 4.446337150833333 | 1.454 | 2.172 | 2.059 |
| 4.453141692777778 | 1.466 | 2.162 | 2.043 |
| 4.459978140833334 | 1.441 | 2.162 | 2.069 |
| 4.466752126388889 | 1.471 | 2.167 | 2.051 |
| 4.4735261161111115 | 1.456 | 2.162 | 2.051 |
| 4.480315355555556 | 1.461 | 2.177 | 2.061 |
| 4.487165716111111 | 1.456 | 2.169 | 2.066 |
| 4.493909142222222 | 1.466 | 2.184 | 2.059 |
| 4.500759576388889 | 1.461 | 2.182 | 2.084 |
| 4.507564013888889 | 1.482 | 2.172 | 2.076 |
| 4.514338001944444 | 1.479 | 2.184 | 2.076 |
| 4.521127256111111 | 1.477 | 2.177 | 2.087 |
| 4.527917893055555 | 1.471 | 2.182 | 2.061 |
| 4.534661327777777 | 1.464 | 2.184 | 2.089 |
| 4.541557503888889 | 1.466 | 2.197 | 2.069 |
| 4.548331483888889 | 1.474 | 2.167 | 2.081 |
| 4.555105459166667 | 1.484 | 2.192 | 2.081 |
| 4.561925259444444 | 1.471 | 2.156 | 2.076 |
| 4.56869924888889 | 1.477 | 2.179 | 2.081 |
| 4.575519058055556 | 1.487 | 2.187 | 2.094 |
| 4.582293021111111 | 1.489 | 2.2 | 2.074 |
| 4.5891433827777774 | 1.479 | 2.202 | 2.094 |
| 4.595872917222222 | 1.492 | 2.192 | 2.115 |
| 4.602708008333334 | 1.479 | 2.192 | 2.094 |
| 4.609497251944444 | 1.464 | 2.228 | 2.081 |
| 4.6163017816666665 | 1.487 | 2.22 | 2.097 |
| 4.623075758333333 | 1.489 | 2.202 | 2.094 |
| 4.62988029 | 1.466 | 2.212 | 2.081 |
| 4.636684814444444 | 1.482 | 2.225 | 2.104 |
| 4.6434587913888885 | 1.487 | 2.234 | 2.12 |
| 4.650263320833333 | 1.479 | 2.221 | 2.079 |
| 4.657113676944444 | 1.467 | 2.198 | 2.073 |
| 4.6638432175 | 1.481 | 2.198 | 2.083 |
| 4.6706935725 | 1.432 | 2.165 | 2.032 |
| 4.677498102777778 | 1.455 | 2.153 | 2.057 |
| 4.684272083333333 | 1.457 | 2.158 | 2.057 |
| 4.691046069444444 | 1.445 | 2.163 | 2.052 |
| 4.6978200405555555 | 1.442 | 2.155 | 2.065 |
| 4.704685667222222 | 1.457 | 2.181 | 2.05 |
| 4.711459645000001 | 1.457 | 2.193 | 2.072 |
| 4.7182489033333335 | 1.439 | 2.183 | 2.065 |
| 4.725083974444444 | 1.457 | 2.188 | 2.047 |
| 4.7318593525 | 1.45 | 2.188 | 2.078 |
| 4.738648602777777 | 1.457 | 2.209 | 2.062 |
| 4.745422595 | 1.478 | 2.211 | 2.075 |
| 4.752257661388889 | 1.46 | 2.193 | 2.057 |
| 4.759092738333333 | 1.475 | 2.198 | 2.072 |
| 4.765836175 | 1.468 | 2.214 | 2.088 |
| 4.772610139444445 | 1.462 | 2.209 | 2.072 |
| 4.779475782777778 | 1.485 | 2.209 | 2.085 |
| 4.786173374722223 | 1.483 | 2.224 | 2.085 |
| 4.792977905833333 | 1.493 | 2.209 | 2.08 |
| 4.799814365555556 | 1.485 | 2.216 | 2.098 |
| 4.8065578 | 1.47 | 2.221 | 2.085 |
| 4.813392880277778 | 1.483 | 2.221 | 2.088 |
| 4.8202432363888885 | 1.498 | 2.229 | 2.093 |
| 4.827017209166667 | 1.473 | 2.216 | 2.103 |
| 4.833852294166666 | 1.496 | 2.237 | 2.101 |
| 4.8405957158333335 | 1.501 | 2.219 | 2.106 |
| 4.8474155252777775 | 1.491 | 2.252 | 2.131 |
| 4.854220054444444 | 1.475 | 2.227 | 2.118 |
| 4.8609787566666665 | 1.521 | 2.239 | 2.124 |
| 4.867829195833333 | 1.513 | 2.232 | 2.111 |
| 4.8745739186111114 | 1.5 | 2.227 | 2.11 |
| 4.881424375277778 | 1.5 | 2.222 | 2.108 |
| 4.888137162777777 | 1.466 | 2.2 | 2.084 |
| 4.8950180619444446 | 1.474 | 2.21 | 2.108 |
| 4.901776766388888 | 1.436 | 2.165 | 2.066 |
| 4.908627111666667 | 1.439 | 2.17 | 2.076 |
| 4.915401100555556 | 1.448 | 2.197 | 2.084 |
| 4.922175095277778 | 1.466 | 2.196 | 2.071 |
| 4.9289796175000005 | 1.476 | 2.205 | 2.089 |
| 4.935754990277777 | 1.489 | 2.202 | 2.086 |
| 4.942528974166667 | 1.492 | 2.223 | 2.094 |
| 4.949348759444445 | 1.487 | 2.228 | 2.102 |
| 4.956168564722223 | 1.482 | 2.215 | 2.076 |
| 4.962942547222222 | 1.492 | 2.223 | 2.104 |
| 4.969731851944444 | 1.492 | 2.23 | 2.097 |
| 4.976582151111112 | 1.497 | 2.228 | 2.102 |
| 4.98335613 | 1.492 | 2.23 | 2.107 |
| 4.990175925555556 | 1.505 | 2.23 | 2.099 |
| 4.9969499088888885 | 1.522 | 2.243 | 2.112 |
| 5.003725266388889 | 1.52 | 2.24 | 2.107 |
| 5.010545079722222 | 1.517 | 2.243 | 2.14 |
| 5.0172885075 | 1.515 | 2.243 | 2.122 |
| 5.024123579166666 | 1.522 | 2.256 | 2.12 |
| 5.030912834722223 | 1.51 | 2.251 | 2.14 |
| 5.0377173775 | 1.51 | 2.248 | 2.13 |
| 5.044506618055556 | 1.506 | 2.248 | 2.125 |
| 5.051356971111112 | 1.514 | 2.239 | 2.14 |
| 5.0581157177777785 | 1.496 | 2.232 | 2.134 |
| 5.0649354875000006 | 1.469 | 2.211 | 2.098 |
| 5.0716955775 | 1.455 | 2.21 | 2.095 |
| 5.07846956 | 1.461 | 2.212 | 2.098 |
| 5.085274076944445 | 1.461 | 2.207 | 2.108 |
| 5.092093893333333 | 1.471 | 2.202 | 2.106 |
| 5.098898406388889 | 1.482 | 2.216 | 2.088 |
| 5.1056723858333335 | 1.516 | 2.221 | 2.095 |
| 5.112476915833333 | 1.493 | 2.239 | 2.1 |
| 5.1192508991666665 | 1.488 | 2.244 | 2.098 |
| 5.126055430277778 | 1.513 | 2.237 | 2.111 |
| 5.132859964722222 | 1.511 | 2.254 | 2.141 |
| 5.139695033888889 | 1.513 | 2.244 | 2.139 |
| 5.146470406111112 | 1.531 | 2.265 | 2.128 |
| 5.153305485833333 | 1.531 | 2.249 | 2.141 |
| 5.160110103055556 | 1.521 | 2.257 | 2.131 |
| 5.166899261666666 | 1.516 | 2.26 | 2.116 |
| 5.173627407777778 | 1.526 | 2.262 | 2.162 |
| 5.180477773055555 | 1.534 | 2.252 | 2.149 |
| 5.187282303333333 | 1.522 | 2.282 | 2.149 |
| 5.194056272777778 | 1.552 | 2.277 | 2.159 |
| 5.2008608075 | 1.456 | 2.201 | 2.097 |
| 5.207620898055556 | 1.479 | 2.206 | 2.099 |
| 5.214455992222222 | 1.454 | 2.211 | 2.099 |
| 5.2212757736111115 | 1.464 | 2.213 | 2.117 |
| 5.2280497611111105 | 1.498 | 2.203 | 2.107 |
| 5.23483901 | 1.477 | 2.223 | 2.099 |
| 5.241658814166667 | 1.475 | 2.221 | 2.119 |
| 5.248417524444444 | 1.485 | 2.244 | 2.122 |
| 5.255328973888889 | 1.503 | 2.24 | 2.117 |
| 5.262057136388889 | 1.504 | 2.235 | 2.122 |
| 5.268831113055556 | 1.513 | 2.245 | 2.135 |
| 5.275650923611112 | 1.516 | 2.251 | 2.114 |
| 5.282395725 | 1.522 | 2.258 | 2.127 |
| 5.2892002725 | 1.548 | 2.263 | 2.125 |
| 5.296035331666666 | 1.538 | 2.263 | 2.148 |
| 5.302809312777778 | 1.535 | 2.268 | 2.155 |
| 5.309659667222222 | 1.568 | 2.266 | 2.17 |
| 5.316433644444444 | 1.548 | 2.276 | 2.168 |
| 5.323284002777778 | 1.543 | 2.304 | 2.163 |
| 5.3300427 | 1.557 | 2.278 | 2.137 |
| 5.336816704166666 | 1.527 | 2.272 | 2.152 |
| 5.343576775000001 | 1.5 | 2.212 | 2.128 |
| 5.3504271325 | 1.481 | 2.214 | 2.108 |
| 5.357201104166667 | 1.486 | 2.209 | 2.108 |
| 5.364036177222222 | 1.481 | 2.209 | 2.133 |
| 5.370794905277777 | 1.486 | 2.212 | 2.128 |
| 5.3775688775 | 1.496 | 2.243 | 2.113 |
| 5.384403945277778 | 1.491 | 2.217 | 2.133 |
| 5.391177931388889 | 1.486 | 2.232 | 2.139 |
| 5.3980130025 | 1.489 | 2.232 | 2.123 |
| 5.404756425277778 | 1.509 | 2.248 | 2.149 |
| 5.4115915125 | 1.527 | 2.259 | 2.151 |
| 5.418366878611111 | 1.532 | 2.267 | 2.131 |
| 5.425186687777778 | 1.548 | 2.267 | 2.151 |
| 5.431930118611111 | 1.547 | 2.275 | 2.146 |
| 5.438765241944444 | 1.554 | 2.28 | 2.151 |
| 5.445554448888889 | 1.544 | 2.287 | 2.154 |
| 5.452343702777778 | 1.547 | 2.264 | 2.149 |
| 5.459132945833334 | 1.565 | 2.275 | 2.169 |
| 5.465937476944445 | 1.524 | 2.27 | 2.158 |
| 5.4727572858333335 | 1.472 | 2.235 | 2.122 |
| 5.479561811666667 | 1.495 | 2.248 | 2.15 |
| 5.486352455277777 | 1.487 | 2.229 | 2.124 |
| 5.493126431388888 | 1.5 | 2.216 | 2.14 |
| 5.4999767791666665 | 1.49 | 2.244 | 2.122 |
| 5.506750758888889 | 1.495 | 2.231 | 2.135 |
| 5.513555298333333 | 1.508 | 2.251 | 2.117 |
| 5.520359813888889 | 1.492 | 2.244 | 2.135 |
| 5.527133890555556 | 1.505 | 2.277 | 2.145 |
| 5.533938327222222 | 1.487 | 2.254 | 2.158 |
| 5.540727583611111 | 1.505 | 2.259 | 2.15 |
| 5.547562668055556 | 1.513 | 2.26 | 2.163 |
| 5.554276929166667 | 1.552 | 2.284 | 2.155 |
| 5.561127278611111 | 1.554 | 2.25 | 2.16 |
| 5.567901253333333 | 1.566 | 2.294 | 2.175 |
| 5.574721062222222 | 1.553 | 2.284 | 2.158 |
| 5.581525603888888 | 1.561 | 2.296 | 2.17 |
| 5.588284296111111 | 1.558 | 2.296 | 2.186 |
| 5.595119375277777 | 1.567 | 2.296 | 2.178 |
| 5.601969724444444 | 1.514 | 2.265 | 2.147 |
| 5.608743708055556 | 1.506 | 2.232 | 2.113 |
| 5.6154871463888885 | 1.491 | 2.24 | 2.115 |
| 5.622323616111111 | 1.486 | 2.222 | 2.136 |
| 5.6290517597222225 | 1.514 | 2.232 | 2.136 |
| 5.6358715675 | 1.499 | 2.25 | 2.141 |
| 5.642691357222223 | 1.506 | 2.258 | 2.146 |
| 5.649465338611111 | 1.504 | 2.253 | 2.164 |
| 5.656300418055555 | 1.504 | 2.245 | 2.156 |
| 5.663089678055556 | 1.512 | 2.245 | 2.164 |
| 5.669878929166667 | 1.527 | 2.271 | 2.138 |
| 5.6766834575 | 1.519 | 2.273 | 2.164 |
| 5.683457436944444 | 1.528 | 2.269 | 2.169 |
| 5.690293899722222 | 1.555 | 2.286 | 2.164 |
| 5.697067875555555 | 1.562 | 2.295 | 2.174 |
| 5.703872404722222 | 1.569 | 2.29 | 2.164 |
| 5.7106464 | 1.587 | 2.323 | 2.189 |
| 5.7174509325 | 1.569 | 2.293 | 2.182 |
| 5.724224911111111 | 1.561 | 2.283 | 2.161 |
| 5.731075251944445 | 1.528 | 2.271 | 2.145 |
| 5.7378492380555555 | 1.492 | 2.234 | 2.127 |
| 5.744684328333334 | 1.48 | 2.236 | 2.124 |
| 5.7513971802777775 | 1.503 | 2.249 | 2.145 |
| 5.758218387777778 | 1.508 | 2.241 | 2.142 |
| 5.765038177499999 | 1.51 | 2.251 | 2.15 |
| 5.771857984444444 | 1.497 | 2.254 | 2.132 |
| 5.778631968333333 | 1.515 | 2.267 | 2.165 |
| 5.7854212205555555 | 1.508 | 2.259 | 2.152 |
| 5.7921952022222225 | 1.528 | 2.257 | 2.134 |
| 5.799030273333333 | 1.528 | 2.251 | 2.17 |
| 5.805804256944445 | 1.513 | 2.267 | 2.16 |
| 5.8126240594444445 | 1.528 | 2.266 | 2.178 |
| 5.8193827625 | 1.532 | 2.276 | 2.18 |
| 5.8262345133333335 | 1.528 | 2.287 | 2.196 |
| 5.833039032222222 | 1.566 | 2.289 | 2.173 |
| 5.839813010555556 | 1.561 | 2.322 | 2.18 |
| 5.846617539166667 | 1.568 | 2.299 | 2.191 |
| 5.853376248055555 | 1.578 | 2.307 | 2.191 |
| 5.86016551 | 1.549 | 2.255 | 2.162 |
| 5.867000575 | 1.491 | 2.237 | 2.123 |
| 5.873805118333333 | 1.494 | 2.232 | 2.138 |
| 5.8805943591666665 | 1.496 | 2.24 | 2.133 |
| 5.887308626111111 | 1.501 | 2.253 | 2.136 |
| 5.8941895325 | 1.511 | 2.232 | 2.156 |
| 5.900963532777777 | 1.506 | 2.23 | 2.141 |
| 5.907752795555555 | 1.511 | 2.25 | 2.156 |
| 5.914603111944444 | 1.527 | 2.273 | 2.161 |
| 5.92139237 | 1.522 | 2.276 | 2.148 |
| 5.92818162 | 1.527 | 2.268 | 2.161 |
| 5.934940318888889 | 1.537 | 2.26 | 2.182 |
| 5.941775410555556 | 1.529 | 2.281 | 2.169 |
| 5.948564660555555 | 1.54 | 2.288 | 2.179 |
| 5.9553233613888885 | 1.554 | 2.288 | 2.184 |
| 5.962144552777778 | 1.565 | 2.294 | 2.194 |
| 5.968933809444445 | 1.563 | 2.31 | 2.182 |
| 5.975738332222223 | 1.587 | 2.298 | 2.192 |
| 5.982512314999999 | 1.58 | 2.295 | 2.182 |
| 5.9893168575 | 1.546 | 2.276 | 2.173 |
| 5.996121377222223 | 1.495 | 2.241 | 2.137 |
| 6.002895396666666 | 1.503 | 2.236 | 2.162 |
| 6.009699881944444 | 1.5 | 2.256 | 2.155 |
| 6.016519682777778 | 1.508 | 2.241 | 2.157 |
| 6.0232936666666665 | 1.525 | 2.277 | 2.145 |
| 6.030084317777777 | 1.495 | 2.262 | 2.168 |
| 6.036904109444444 | 1.513 | 2.256 | 2.15 |
| 6.043678084722223 | 1.508 | 2.256 | 2.165 |
| 6.050482611111112 | 1.536 | 2.277 | 2.165 |
| 6.057317709444445 | 1.505 | 2.262 | 2.168 |
| 6.0640916874999995 | 1.515 | 2.267 | 2.17 |
| 6.070865679166666 | 1.531 | 2.287 | 2.18 |
| 6.0776396238888895 | 1.536 | 2.282 | 2.178 |
| 6.084551091388889 | 1.538 | 2.285 | 2.173 |
| 6.091279238333334 | 1.557 | 2.274 | 2.188 |
| 6.0980851575 | 1.558 | 2.291 | 2.191 |
| 6.104859125277778 | 1.544 | 2.292 | 2.201 |
| 6.1116483963888895 | 1.586 | 2.304 | 2.188 |
| 6.118483486111112 | 1.583 | 2.304 | 2.203 |
| 6.1252879927777775 | 1.589 | 2.296 | 2.196 |
| 6.132062056666667 | 1.582 | 2.301 | 2.193 |
| 6.138835945555556 | 1.567 | 2.317 | 2.198 |
| 6.145671023333334 | 1.588 | 2.302 | 2.19 |
| 6.152445014444444 | 1.54 | 2.275 | 2.169 |
| 6.159264813055556 | 1.521 | 2.253 | 2.164 |
| 6.166040182222222 | 1.511 | 2.268 | 2.169 |
| 6.1728447030555555 | 1.511 | 2.263 | 2.169 |
| 6.1796339638888895 | 1.511 | 2.253 | 2.166 |
| 6.186438578888889 | 1.534 | 2.281 | 2.159 |
| 6.1932430258333335 | 1.524 | 2.271 | 2.164 |
| 6.200016995277778 | 1.517 | 2.268 | 2.177 |
| 6.206836821111111 | 1.527 | 2.281 | 2.171 |
| 6.213595503333334 | 1.524 | 2.276 | 2.187 |
| 6.220400038055556 | 1.534 | 2.283 | 2.189 |
| 6.227250392222222 | 1.522 | 2.283 | 2.194 |
| 6.2340563025 | 1.532 | 2.283 | 2.187 |
| 6.240860834166667 | 1.537 | 2.302 | 2.179 |
| 6.2476195425 | 1.562 | 2.309 | 2.197 |
| 6.254408787222222 | 1.575 | 2.295 | 2.207 |
| 6.261213308333334 | 1.59 | 2.303 | 2.202 |
| 6.268109518055555 | 1.592 | 2.328 | 2.197 |
| 6.2747918275 | 1.582 | 2.331 | 2.217 |
| 6.281611642222222 | 1.585 | 2.321 | 2.205 |
| 6.2884008811111105 | 1.531 | 2.266 | 2.153 |
| 6.295174857222222 | 1.505 | 2.254 | 2.145 |
| 6.302026604722222 | 1.487 | 2.264 | 2.147 |
| 6.308785311944444 | 1.513 | 2.244 | 2.162 |
| 6.315635664444444 | 1.508 | 2.262 | 2.162 |
| 6.322424918333333 | 1.51 | 2.262 | 2.16 |
| 6.329198906111111 | 1.523 | 2.274 | 2.18 |
| 6.336018696111111 | 1.528 | 2.274 | 2.168 |
| 6.342777398333333 | 1.525 | 2.264 | 2.198 |
| 6.349566656666667 | 1.546 | 2.29 | 2.173 |
| 6.356386454444445 | 1.525 | 2.279 | 2.183 |
| 6.3631910241666665 | 1.533 | 2.287 | 2.193 |
| 6.369981633888889 | 1.546 | 2.292 | 2.193 |
| 6.376755608888889 | 1.538 | 2.285 | 2.173 |
| 6.383560132777778 | 1.543 | 2.285 | 2.188 |
| 6.3903341183333335 | 1.572 | 2.312 | 2.196 |
| 6.397138646111111 | 1.551 | 2.314 | 2.193 |
| 6.403988996944445 | 1.578 | 2.327 | 2.208 |
| 6.4107629741666665 | 1.583 | 2.317 | 2.185 |
| 6.4175369516666665 | 1.576 | 2.309 | 2.211 |
| 6.424356760277777 | 1.587 | 2.304 | 2.206 |
| 6.431161289166666 | 1.534 | 2.272 | 2.187 |
| 6.437921404722222 | 1.522 | 2.257 | 2.177 |
| 6.444756456666666 | 1.523 | 2.248 | 2.169 |
| 6.451560981944445 | 1.509 | 2.25 | 2.151 |
| 6.458350248888888 | 1.519 | 2.263 | 2.164 |
| 6.465108950833333 | 1.504 | 2.265 | 2.169 |
| 6.471882928888889 | 1.509 | 2.273 | 2.169 |
| 6.478748548333333 | 1.527 | 2.265 | 2.184 |
| 6.485583635833334 | 1.527 | 2.283 | 2.164 |
| 6.492357614722222 | 1.514 | 2.283 | 2.179 |
| 6.499131590555556 | 1.524 | 2.276 | 2.184 |
| 6.505906972222222 | 1.524 | 2.273 | 2.189 |
| 6.512711488611111 | 1.547 | 2.278 | 2.187 |
| 6.51950074 | 1.542 | 2.299 | 2.202 |
| 6.526305268055555 | 1.529 | 2.288 | 2.192 |
| 6.533079255277778 | 1.548 | 2.281 | 2.182 |
| 6.53989905 | 1.542 | 2.309 | 2.197 |
| 6.546688305277778 | 1.555 | 2.301 | 2.184 |
| 6.553538695833333 | 1.595 | 2.318 | 2.194 |
| 6.560312631111111 | 1.577 | 2.298 | 2.222 |
| 6.567117166111111 | 1.577 | 2.326 | 2.222 |
| 6.573907801111111 | 1.564 | 2.323 | 2.202 |
| 6.580681781111111 | 1.575 | 2.298 | 2.171 |
| 6.587455766111111 | 1.534 | 2.271 | 2.16 |
| 6.594260291944444 | 1.502 | 2.262 | 2.152 |
| 6.601125922222222 | 1.508 | 2.256 | 2.157 |
| 6.607869349166666 | 1.5 | 2.269 | 2.16 |
| 6.614673879166666 | 1.508 | 2.267 | 2.157 |
| 6.621478399444444 | 1.515 | 2.254 | 2.16 |
| 6.6282523825 | 1.528 | 2.264 | 2.162 |
| 6.635148568888889 | 1.5 | 2.272 | 2.178 |
| 6.641862824166667 | 1.53 | 2.251 | 2.175 |
| 6.6486979066666665 | 1.525 | 2.277 | 2.16 |
| 6.655471898611111 | 1.53 | 2.277 | 2.175 |
| 6.662245877777777 | 1.52 | 2.277 | 2.183 |
| 6.669050393055556 | 1.53 | 2.295 | 2.188 |
| 6.675824383611111 | 1.543 | 2.29 | 2.178 |
| 6.6826136225 | 1.538 | 2.279 | 2.19 |
| 6.689463976388889 | 1.538 | 2.29 | 2.198 |
| 6.696268509166666 | 1.573 | 2.292 | 2.226 |
| 6.7030424925 | 1.572 | 2.312 | 2.208 |
| 6.709802590555555 | 1.562 | 2.324 | 2.198 |
| 6.716622383888889 | 1.583 | 2.306 | 2.213 |
| 6.7234727375 | 1.601 | 2.324 | 2.203 |
| 6.730185611388889 | 1.572 | 2.306 | 2.195 |
| 6.737066526944444 | 1.527 | 2.27 | 2.172 |
| 6.743855781111111 | 1.516 | 2.245 | 2.143 |
| 6.750675586944444 | 1.504 | 2.25 | 2.146 |
| 6.757449557499999 | 1.491 | 2.27 | 2.161 |
| 6.764238806944444 | 1.506 | 2.273 | 2.161 |
| 6.771073888611111 | 1.511 | 2.247 | 2.166 |
| 6.777847873611111 | 1.516 | 2.27 | 2.166 |
| 6.784577421111112 | 1.522 | 2.288 | 2.182 |
| 6.791381960833333 | 1.527 | 2.265 | 2.174 |
| 6.798217023888889 | 1.532 | 2.276 | 2.161 |
| 6.804990994722222 | 1.529 | 2.265 | 2.166 |
| 6.8117344575 | 1.509 | 2.273 | 2.197 |
| 6.818630606666667 | 1.534 | 2.288 | 2.179 |
| 6.825404580277778 | 1.511 | 2.278 | 2.187 |
| 6.83217868638889 | 1.524 | 2.296 | 2.171 |
| 6.838983090277777 | 1.551 | 2.287 | 2.197 |
| 6.845758470555555 | 1.532 | 2.287 | 2.199 |
| 6.852562976111111 | 1.582 | 2.303 | 2.169 |
| 6.859413336388888 | 1.567 | 2.287 | 2.199 |
| 6.866187315 | 1.562 | 2.31 | 2.184 |
| 6.8730529491666665 | 1.58 | 2.305 | 2.192 |
| 6.879735278333333 | 1.572 | 2.295 | 2.238 |
| 6.886600907499999 | 1.57 | 2.31 | 2.197 |
| 6.893344330555555 | 1.505 | 2.271 | 2.163 |
| 6.9001641411111105 | 1.5 | 2.239 | 2.173 |
| 6.906938120833333 | 1.497 | 2.233 | 2.144 |
| 6.9137593125 | 1.497 | 2.246 | 2.155 |
| 6.9205791175 | 1.507 | 2.246 | 2.157 |
| 6.927322536111111 | 1.495 | 2.269 | 2.155 |
| 6.934127069722222 | 1.525 | 2.264 | 2.173 |
| 6.9409468669444445 | 1.505 | 2.251 | 2.17 |
| 6.947736130833333 | 1.507 | 2.241 | 2.17 |
| 6.954510125833334 | 1.515 | 2.272 | 2.162 |
| 6.961345183055556 | 1.513 | 2.264 | 2.17 |
| 6.968149716388889 | 1.536 | 2.267 | 2.167 |
| 6.9749237102777775 | 1.513 | 2.256 | 2.17 |
| 6.981714327222223 | 1.523 | 2.267 | 2.178 |
| 6.9885494125 | 1.55 | 2.279 | 2.185 |
| 6.995323382777777 | 1.546 | 2.276 | 2.193 |
| 7.0021126422222215 | 1.541 | 2.273 | 2.201 |
| 7.0089477250000005 | 1.539 | 2.296 | 2.203 |
| 7.015721701666667 | 1.571 | 2.304 | 2.218 |
| 7.022541517222223 | 1.565 | 2.296 | 2.196 |
| 7.029284929166667 | 1.551 | 2.296 | 2.208 |
| 7.036104738333333 | 1.556 | 2.306 | 2.2 |
| 7.0429550927777775 | 1.535 | 2.282 | 2.195 |
| 7.0497290675 | 1.5 | 2.242 | 2.151 |
| 7.05653498861111 | 1.483 | 2.242 | 2.159 |
| 7.0633089644444444 | 1.488 | 2.258 | 2.146 |
| 7.070067662222222 | 1.504 | 2.25 | 2.164 |
| 7.076918019722222 | 1.509 | 2.253 | 2.146 |
| 7.083722554722222 | 1.501 | 2.253 | 2.138 |
| 7.090496525833333 | 1.488 | 2.237 | 2.161 |
| 7.097331604444444 | 1.488 | 2.253 | 2.174 |
| 7.104075035555556 | 1.511 | 2.25 | 2.174 |
| 7.110879565277777 | 1.506 | 2.25 | 2.187 |
| 7.117684101388889 | 1.506 | 2.263 | 2.156 |
| 7.124490124444445 | 1.514 | 2.258 | 2.166 |
| 7.131263993055555 | 1.511 | 2.27 | 2.171 |
| 7.1381143425 | 1.524 | 2.268 | 2.176 |
| 7.144888346666667 | 1.515 | 2.255 | 2.194 |
| 7.15169285361111 | 1.531 | 2.274 | 2.189 |
| 7.158482101944444 | 1.539 | 2.276 | 2.197 |
| 7.165256104999999 | 1.535 | 2.281 | 2.171 |
| 7.172045361944444 | 1.546 | 2.303 | 2.197 |
| 7.1788193147222215 | 1.551 | 2.305 | 2.199 |
| 7.185684941111112 | 1.55 | 2.297 | 2.192 |
| 7.192460308888889 | 1.555 | 2.292 | 2.194 |
| 7.1992342902777775 | 1.522 | 2.274 | 2.173 |
| 7.206023554166667 | 1.508 | 2.243 | 2.16 |
| 7.212797519444445 | 1.479 | 2.228 | 2.15 |
| 7.219617329444445 | 1.469 | 2.238 | 2.142 |
| 7.226421862222223 | 1.485 | 2.236 | 2.137 |
| 7.233272219722222 | 1.49 | 2.238 | 2.152 |
| 7.239985079444444 | 1.479 | 2.241 | 2.134 |
| 7.246789618055556 | 1.505 | 2.231 | 2.139 |
| 7.253624698333333 | 1.482 | 2.231 | 2.152 |
| 7.260400065000001 | 1.495 | 2.249 | 2.132 |
| 7.267235143055556 | 1.5 | 2.233 | 2.155 |
| 7.2740243925 | 1.505 | 2.256 | 2.155 |
| 7.280828918888889 | 1.495 | 2.249 | 2.144 |
| 7.2876181805555555 | 1.513 | 2.264 | 2.178 |
| 7.294392160555556 | 1.505 | 2.264 | 2.17 |
| 7.3011661411111115 | 1.508 | 2.259 | 2.17 |
| 7.308016488888889 | 1.529 | 2.247 | 2.18 |
| 7.314790459999999 | 1.536 | 2.274 | 2.19 |
| 7.321595060833333 | 1.535 | 2.263 | 2.175 |
| 7.328370359166667 | 1.555 | 2.299 | 2.178 |
| 7.335205472777777 | 1.535 | 2.291 | 2.188 |
| 7.342009971666666 | 1.545 | 2.273 | 2.178 |
| 7.348799222222222 | 1.536 | 2.293 | 2.175 |
| 7.355573203055555 | 1.529 | 2.282 | 2.167 |
| 7.362347174166667 | 1.498 | 2.247 | 2.146 |
| 7.369121162222222 | 1.465 | 2.196 | 2.136 |
| 7.376002064722223 | 1.46 | 2.207 | 2.13 |
| 7.3827607663888895 | 1.473 | 2.224 | 2.136 |
| 7.389550024166667 | 1.491 | 2.232 | 2.133 |
| 7.396325393055555 | 1.473 | 2.242 | 2.146 |
| 7.403160471944445 | 1.478 | 2.235 | 2.136 |
| 7.409934468611111 | 1.473 | 2.24 | 2.161 |
| 7.4167389825 | 1.471 | 2.232 | 2.161 |
| 7.423528226388889 | 1.488 | 2.24 | 2.158 |
| 7.430332755833333 | 1.494 | 2.258 | 2.156 |
| 7.437137281388889 | 1.483 | 2.227 | 2.141 |
| 7.44403346 | 1.473 | 2.235 | 2.153 |
| 7.450746340277778 | 1.487 | 2.247 | 2.164 |
| 7.4574911725 | 1.517 | 2.267 | 2.158 |
| 7.464310959722223 | 1.526 | 2.264 | 2.164 |
| 7.471130765277778 | 1.518 | 2.267 | 2.169 |
| 7.477996395 | 1.523 | 2.264 | 2.174 |
| 7.484724546388889 | 1.523 | 2.287 | 2.164 |
| 7.491544359722222 | 1.521 | 2.272 | 2.174 |
| 7.4983336099999995 | 1.526 | 2.255 | 2.158 |
| 7.505077053333333 | 1.487 | 2.24 | 2.117 |
| 7.511927396388889 | 1.466 | 2.216 | 2.124 |
| 7.518701365277778 | 1.449 | 2.208 | 2.127 |
| 7.525490620277777 | 1.477 | 2.208 | 2.116 |
| 7.5323270875 | 1.462 | 2.203 | 2.134 |
| 7.539131628611111 | 1.467 | 2.208 | 2.137 |
| 7.5459514386111115 | 1.464 | 2.218 | 2.132 |
| 7.552725401666667 | 1.462 | 2.236 | 2.116 |
| 7.559529928611111 | 1.457 | 2.226 | 2.132 |
| 7.566303903055555 | 1.487 | 2.226 | 2.139 |
| 7.573108447222222 | 1.462 | 2.233 | 2.137 |
| 7.5798976875 | 1.464 | 2.231 | 2.167 |
| 7.586686936944444 | 1.48 | 2.242 | 2.147 |
| 7.5934609222222225 | 1.496 | 2.245 | 2.144 |
| 7.600312661666667 | 1.499 | 2.242 | 2.162 |
| 7.607086646666667 | 1.507 | 2.248 | 2.152 |
| 7.613891175 | 1.499 | 2.255 | 2.152 |
| 7.620665152222222 | 1.504 | 2.25 | 2.144 |
| 7.6275002333333335 | 1.52 | 2.253 | 2.157 |
| 7.634274215277777 | 1.527 | 2.253 | 2.17 |
| 7.641094035555555 | 1.517 | 2.271 | 2.16 |
| 7.647867996388889 | 1.49 | 2.236 | 2.146 |
| 7.654672518888889 | 1.448 | 2.229 | 2.12 |
| 7.661417336388888 | 1.444 | 2.209 | 2.118 |
| 7.668282958333334 | 1.437 | 2.184 | 2.125 |
| 7.675056950555555 | 1.43 | 2.191 | 2.11 |
| 7.6818309241666665 | 1.445 | 2.207 | 2.113 |
| 7.6886660025 | 1.448 | 2.176 | 2.105 |
| 7.695439972777777 | 1.453 | 2.214 | 2.115 |
| 7.702275057777777 | 1.463 | 2.199 | 2.123 |
| 7.709125415 | 1.448 | 2.199 | 2.135 |
| 7.715807745277778 | 1.443 | 2.191 | 2.128 |
| 7.722597005 | 1.45 | 2.227 | 2.133 |
| 7.729372353611112 | 1.45 | 2.219 | 2.148 |
| 7.7362074355555555 | 1.466 | 2.214 | 2.143 |
| 7.743042523611112 | 1.448 | 2.227 | 2.146 |
| 7.749816492777778 | 1.477 | 2.226 | 2.138 |
| 7.7565904691666665 | 1.482 | 2.233 | 2.141 |
| 7.763395010555556 | 1.485 | 2.23 | 2.135 |
| 7.770168988333333 | 1.485 | 2.221 | 2.141 |
| 7.777004053611111 | 1.501 | 2.236 | 2.141 |
| 7.7837933136111115 | 1.495 | 2.249 | 2.156 |
| 7.790643667777777 | 1.498 | 2.244 | 2.158 |
| 7.797356552222222 | 1.503 | 2.241 | 2.146 |
| 7.8041624630555555 | 1.503 | 2.257 | 2.146 |
| 7.811012817500001 | 1.504 | 2.241 | 2.146 |
| 7.817786800555555 | 1.476 | 2.224 | 2.148 |
| 7.824576051666666 | 1.444 | 2.199 | 2.117 |
| 7.831426414166667 | 1.398 | 2.187 | 2.098 |
| 7.838200382222222 | 1.429 | 2.185 | 2.098 |
| 7.845004911666667 | 1.423 | 2.182 | 2.101 |
| 7.851809439444445 | 1.436 | 2.193 | 2.104 |
| 7.858629252222222 | 1.426 | 2.187 | 2.106 |
| 7.865342141111111 | 1.421 | 2.195 | 2.078 |
| 7.872178588333333 | 1.446 | 2.198 | 2.109 |
| 7.878952568611111 | 1.452 | 2.185 | 2.119 |
| 7.8857265566666666 | 1.449 | 2.198 | 2.121 |
| 7.892668568333333 | 1.449 | 2.208 | 2.104 |
| 7.899335606944445 | 1.426 | 2.195 | 2.134 |
| 7.906140140555555 | 1.462 | 2.203 | 2.142 |
| 7.912914131111111 | 1.444 | 2.21 | 2.132 |
| 7.919749194722222 | 1.441 | 2.213 | 2.139 |
| 7.926523193611112 | 1.448 | 2.204 | 2.124 |
| 7.9333887983333335 | 1.49 | 2.234 | 2.126 |
| 7.940148889722223 | 1.479 | 2.203 | 2.134 |
| 7.946938138888888 | 1.464 | 2.222 | 2.121 |
| 7.953712124722222 | 1.471 | 2.225 | 2.134 |
| 7.9605166516666666 | 1.474 | 2.23 | 2.132 |
| 7.96735173361111 | 1.474 | 2.212 | 2.129 |
| 7.974156254166666 | 1.502 | 2.243 | 2.144 |
| 7.980930240833334 | 1.507 | 2.23 | 2.139 |
| 7.987704225 | 1.497 | 2.232 | 2.137 |
| 7.9944934625 | 1.459 | 2.223 | 2.113 |
| 8.001343826666666 | 1.477 | 2.219 | 2.139 |
| 8.008058081388889 | 1.417 | 2.166 | 2.087 |
| 8.014938990277777 | 1.429 | 2.176 | 2.09 |
| 8.021712971388888 | 1.402 | 2.166 | 2.095 |
| 8.028532775 | 1.425 | 2.171 | 2.087 |
| 8.035260938055556 | 1.407 | 2.179 | 2.084 |
| 8.042096003055557 | 1.417 | 2.176 | 2.067 |
| 8.048900584722222 | 1.427 | 2.181 | 2.095 |
| 8.0556745125 | 1.427 | 2.189 | 2.092 |
| 8.062509589722222 | 1.425 | 2.189 | 2.107 |
| 8.06931413138889 | 1.44 | 2.186 | 2.1 |
| 8.076120044722222 | 1.404 | 2.191 | 2.105 |
| 8.08287874611111 | 1.43 | 2.194 | 2.102 |
| 8.089698545833334 | 1.43 | 2.184 | 2.118 |
| 8.096472531388889 | 1.439 | 2.199 | 2.12 |
| 8.103292329444445 | 1.449 | 2.214 | 2.092 |
| 8.110051034166666 | 1.447 | 2.212 | 2.102 |
| 8.116855566111111 | 1.47 | 2.208 | 2.102 |
| 8.123644826666666 | 1.462 | 2.213 | 2.12 |
| 8.130449351111112 | 1.47 | 2.236 | 2.13 |
| 8.13725388111111 | 1.473 | 2.211 | 2.123 |
| 8.14404451638889 | 1.473 | 2.226 | 2.123 |
| 8.1508338625 | 1.47 | 2.229 | 2.13 |
| 8.157684155277778 | 1.49 | 2.216 | 2.13 |
| 8.164458098611112 | 1.462 | 2.223 | 2.133 |
| 8.171232078055557 | 1.456 | 2.221 | 2.13 |
| 8.178051891111112 | 1.4 | 2.154 | 2.086 |
| 8.184825858888889 | 1.383 | 2.149 | 2.078 |
| 8.191676215 | 1.378 | 2.149 | 2.086 |
| 8.19845019611111 | 1.385 | 2.159 | 2.075 |
| 8.205224171944444 | 1.385 | 2.165 | 2.075 |
| 8.212030093055557 | 1.406 | 2.154 | 2.083 |
| 8.218819338888888 | 1.406 | 2.152 | 2.068 |
| 8.225593326111111 | 1.395 | 2.17 | 2.078 |
| 8.232397851388889 | 1.406 | 2.147 | 2.081 |
| 8.23923294138889 | 1.416 | 2.182 | 2.083 |
| 8.246006912777778 | 1.415 | 2.177 | 2.103 |
| 8.252857273055556 | 1.415 | 2.174 | 2.088 |
| 8.259570135833334 | 1.42 | 2.186 | 2.091 |
| 8.26648161 | 1.447 | 2.186 | 2.083 |
| 8.273209762777778 | 1.438 | 2.189 | 2.109 |
| 8.279985106666667 | 1.469 | 2.192 | 2.093 |
| 8.2867896575 | 1.42 | 2.199 | 2.116 |
| 8.293578895 | 1.443 | 2.202 | 2.096 |
| 8.300398713333333 | 1.448 | 2.202 | 2.116 |
| 8.307172677222223 | 1.448 | 2.181 | 2.088 |
| 8.314007760277779 | 1.464 | 2.212 | 2.119 |
| 8.320781738055556 | 1.441 | 2.189 | 2.106 |
| 8.32757099861111 | 1.466 | 2.222 | 2.106 |
| 8.334390804166667 | 1.43 | 2.2 | 2.111 |
| 8.341118946944444 | 1.397 | 2.145 | 2.059 |
| 8.3480012575 | 1.376 | 2.14 | 2.044 |
| 8.35477521111111 | 1.375 | 2.14 | 2.064 |
| 8.361533922222222 | 1.374 | 2.14 | 2.074 |
| 8.368353730833334 | 1.374 | 2.128 | 2.064 |
| 8.375142975 | 1.379 | 2.125 | 2.069 |
| 8.381947507777777 | 1.399 | 2.135 | 2.072 |
| 8.388721485 | 1.384 | 2.14 | 2.067 |
| 8.39555658388889 | 1.394 | 2.145 | 2.059 |
| 8.402330537777777 | 1.396 | 2.166 | 2.072 |
| 8.409135074166667 | 1.411 | 2.148 | 2.067 |
| 8.41595626638889 | 1.38 | 2.172 | 2.082 |
| 8.42277607361111 | 1.425 | 2.178 | 2.092 |
| 8.429550150833332 | 1.411 | 2.17 | 2.072 |
| 8.43632403 | 1.422 | 2.17 | 2.074 |
| 8.443113280555556 | 1.437 | 2.165 | 2.082 |
| 8.449963636388889 | 1.429 | 2.175 | 2.069 |
| 8.456737615 | 1.432 | 2.175 | 2.077 |
| 8.463542147777778 | 1.424 | 2.172 | 2.092 |
| 8.470316127777778 | 1.419 | 2.19 | 2.087 |
| 8.47709009611111 | 1.424 | 2.17 | 2.084 |
| 8.48391129 | 1.434 | 2.19 | 2.105 |
| 8.490731099722222 | 1.415 | 2.175 | 2.097 |
| 8.497505074166666 | 1.355 | 2.138 | 2.058 |
| 8.504340166666667 | 1.377 | 2.138 | 2.05 |
| 8.511144680833333 | 1.36 | 2.114 | 2.027 |
| 8.517979763888889 | 1.352 | 2.131 | 2.042 |
| 8.524677363333334 | 1.362 | 2.119 | 2.053 |
| 8.531497167222224 | 1.36 | 2.134 | 2.058 |
| 8.538271144444444 | 1.355 | 2.129 | 2.053 |
| 8.5451214975 | 1.357 | 2.121 | 2.047 |
| 8.551896871111111 | 1.357 | 2.142 | 2.058 |
| 8.558747215277778 | 1.367 | 2.131 | 2.05 |
| 8.565521211666667 | 1.397 | 2.137 | 2.063 |
| 8.57226463111111 | 1.383 | 2.153 | 2.06 |
| 8.579069152222221 | 1.402 | 2.156 | 2.063 |
| 8.585843144166667 | 1.392 | 2.151 | 2.06 |
| 8.592617105555554 | 1.405 | 2.153 | 2.055 |
| 8.599467465833333 | 1.41 | 2.161 | 2.068 |
| 8.606272004166668 | 1.4 | 2.161 | 2.073 |
| 8.613030703333333 | 1.423 | 2.141 | 2.078 |
| 8.619836620277777 | 1.402 | 2.169 | 2.058 |
| 8.626671694722223 | 1.418 | 2.161 | 2.078 |
| 8.633460955555556 | 1.41 | 2.148 | 2.081 |
| 8.640280752499999 | 1.418 | 2.166 | 2.073 |
| 8.647054735555555 | 1.423 | 2.171 | 2.073 |
| 8.653843991111112 | 1.406 | 2.176 | 2.075 |
| 8.660694337777779 | 1.355 | 2.114 | 2.039 |
| 8.667468317777779 | 1.368 | 2.127 | 2.044 |
| 8.674257577777778 | 1.374 | 2.109 | 2.039 |
| 8.68103155638889 | 1.323 | 2.077 | 2.033 |
| 8.687822195555556 | 1.338 | 2.094 | 2.028 |
| 8.694657265277778 | 1.328 | 2.117 | 2.039 |
| 8.701431246666667 | 1.331 | 2.087 | 2.039 |
| 8.708235793055556 | 1.338 | 2.107 | 2.041 |
| 8.715040312777777 | 1.325 | 2.1 | 2.023 |
| 8.721799012777778 | 1.359 | 2.11 | 2.054 |
| 8.728603615277777 | 1.363 | 2.121 | 2.036 |
| 8.735377514166666 | 1.371 | 2.127 | 2.046 |
| 8.742227874166668 | 1.373 | 2.101 | 2.028 |
| 8.749032404166666 | 1.366 | 2.101 | 2.039 |
| 8.755792489166668 | 1.381 | 2.139 | 2.059 |
| 8.76262759 | 1.355 | 2.134 | 2.059 |
| 8.769416823333334 | 1.391 | 2.116 | 2.044 |
| 8.776206079722222 | 1.388 | 2.144 | 2.044 |
| 8.783025877222222 | 1.378 | 2.124 | 2.064 |
| 8.789784598333334 | 1.376 | 2.134 | 2.059 |
| 8.796558626388888 | 1.376 | 2.132 | 2.049 |
| 8.803332539166666 | 1.386 | 2.134 | 2.067 |
| 8.810213449444444 | 1.399 | 2.152 | 2.039 |
| 8.817033265833334 | 1.399 | 2.139 | 2.059 |
| 8.823762795833334 | 1.373 | 2.12 | 2.036 |
| 8.830582595555557 | 1.332 | 2.087 | 2.007 |
| 8.837371853055554 | 1.335 | 2.108 | 2.035 |
| 8.844145825833333 | 1.304 | 2.078 | 1.999 |
| 8.85095037111111 | 1.291 | 2.065 | 2.022 |
| 8.857739613333333 | 1.322 | 2.083 | 2.014 |
| 8.864574696388889 | 1.306 | 2.083 | 2.007 |
| 8.871409766944444 | 1.306 | 2.091 | 2.019 |
| 8.878183746944444 | 1.345 | 2.116 | 1.996 |
| 8.884957806944445 | 1.336 | 2.093 | 2.019 |
| 8.891733088333334 | 1.359 | 2.113 | 2.025 |
| 8.898568264166666 | 1.352 | 2.11 | 2.032 |
| 8.905311598333332 | 1.341 | 2.11 | 2.017 |
| 8.912116126944444 | 1.341 | 2.11 | 2.014 |
| 8.918905375277777 | 1.357 | 2.12 | 2.022 |
| 8.925725187777777 | 1.339 | 2.115 | 2.032 |
| 8.932529714444446 | 1.346 | 2.118 | 2.04 |
| 8.939303696388889 | 1.349 | 2.115 | 2.04 |
| 8.946154051666667 | 1.367 | 2.118 | 2.022 |
| 8.953004401388888 | 1.39 | 2.102 | 2.027 |
| 8.959732554444445 | 1.354 | 2.123 | 2.025 |
| 8.966523197222221 | 1.362 | 2.13 | 2.03 |
| 8.973297171944445 | 1.362 | 2.128 | 2.04 |
| 8.980101708333335 | 1.377 | 2.143 | 2.05 |
| 8.986860494722222 | 1.359 | 2.111 | 2.024 |
| 8.993680210277779 | 1.36 | 2.118 | 2.037 |
| 9.000484739166668 | 1.299 | 2.056 | 1.988 |
| 9.007289266666668 | 1.29 | 2.054 | 1.982 |
| 9.014063243611112 | 1.292 | 2.049 | 1.977 |
| 9.020867774444444 | 1.282 | 2.041 | 1.975 |
| 9.027673689166667 | 1.303 | 2.051 | 1.99 |
| 9.034508766666667 | 1.282 | 2.044 | 1.998 |
| 9.04128275361111 | 1.306 | 2.051 | 1.988 |
| 9.0480720075 | 1.309 | 2.076 | 1.988 |
| 9.054907082222222 | 1.33 | 2.079 | 1.998 |
| 9.061681060277778 | 1.32 | 2.086 | 1.988 |
| 9.068455045833334 | 1.33 | 2.078 | 1.995 |
| 9.075259570555556 | 1.327 | 2.088 | 1.998 |
| 9.082033554722223 | 1.353 | 2.078 | 2.013 |
| 9.0888839025 | 1.343 | 2.091 | 2.021 |
| 9.095688426666667 | 1.332 | 2.073 | 2.011 |
| 9.102463800277777 | 1.34 | 2.081 | 2.005 |
| 9.10923786138889 | 1.325 | 2.091 | 2.008 |
| 9.11607285138889 | 1.345 | 2.099 | 2.011 |
| 9.122831564444445 | 1.348 | 2.091 | 2.008 |
| 9.129651363611112 | 1.355 | 2.104 | 2.018 |
| 9.136425340833332 | 1.348 | 2.109 | 2.011 |
| 9.143260419166666 | 1.318 | 2.098 | 2.013 |
| 9.150064963055556 | 1.307 | 2.066 | 2.002 |
| 9.15683892888889 | 1.276 | 2.052 | 1.969 |
| 9.163674011388888 | 1.276 | 2.03 | 1.951 |
| 9.170541027499999 | 1.278 | 2.035 | 1.963 |
| 9.177284549166666 | 1.276 | 2.04 | 1.963 |
| 9.184043152222223 | 1.273 | 2.041 | 1.966 |
| 9.190847680000001 | 1.277 | 2.04 | 1.979 |
| 9.1976369325 | 1.297 | 2.057 | 1.971 |
| 9.204426193055555 | 1.331 | 2.049 | 1.984 |
| 9.211184895 | 1.303 | 2.062 | 1.976 |
| 9.218035243333333 | 1.295 | 2.059 | 1.979 |
| 9.224809231388889 | 1.308 | 2.057 | 1.986 |
| 9.23164430361111 | 1.295 | 2.039 | 1.981 |
| 9.238389131111111 | 1.308 | 2.067 | 1.979 |
| 9.24520893 | 1.336 | 2.064 | 1.974 |
| 9.252013456388887 | 1.321 | 2.08 | 1.989 |
| 9.258787442777777 | 1.316 | 2.067 | 1.986 |
| 9.265637790555557 | 1.308 | 2.09 | 1.989 |
| 9.272411761666667 | 1.313 | 2.069 | 1.974 |
| 9.279201023888888 | 1.324 | 2.059 | 2.002 |
| 9.286005554166668 | 1.318 | 2.072 | 1.966 |
| 9.292794824722224 | 1.326 | 2.064 | 1.999 |
| 9.299570170555556 | 1.311 | 2.074 | 1.997 |
| 9.306344149166668 | 1.341 | 2.082 | 2.004 |
| 9.313163965277777 | 1.31 | 2.075 | 1.978 |
| 9.319983752777777 | 1.284 | 2.048 | 1.968 |
| 9.32677301138889 | 1.255 | 2.025 | 1.957 |
| 9.33357753361111 | 1.257 | 2.031 | 1.949 |
| 9.34035151 | 1.24 | 2.016 | 1.947 |
| 9.34712549861111 | 1.268 | 2.004 | 1.949 |
| 9.353945303888889 | 1.265 | 2.043 | 1.939 |
| 9.360795652777778 | 1.279 | 2.045 | 1.949 |
| 9.367569635833334 | 1.271 | 2.022 | 1.954 |
| 9.374344998333333 | 1.274 | 2.027 | 1.949 |
| 9.381118976111113 | 1.287 | 2.027 | 1.952 |
| 9.387954055833333 | 1.299 | 2.045 | 1.954 |
| 9.394728030277777 | 1.281 | 2.063 | 1.962 |
| 9.401502009166666 | 1.279 | 2.048 | 1.952 |
| 9.408352370277777 | 1.281 | 2.04 | 1.947 |
| 9.415141620555554 | 1.281 | 2.04 | 1.952 |
| 9.421930871666666 | 1.302 | 2.071 | 1.972 |
| 9.428765947777778 | 1.312 | 2.045 | 1.965 |
| 9.43553992361111 | 1.284 | 2.068 | 1.967 |
| 9.442361127777778 | 1.289 | 2.06 | 1.967 |
| 9.449135110277778 | 1.292 | 2.048 | 1.975 |
| 9.455909080833333 | 1.315 | 2.055 | 2 |
| 9.462698331388887 | 1.292 | 2.055 | 1.99 |
| 9.46956398222222 | 1.289 | 2.037 | 1.977 |
| 9.476292125555556 | 1.273 | 2.054 | 1.969 |
| 9.483111914444445 | 1.3 | 2.06 | 1.982 |
| 9.489885901666668 | 1.233 | 2.008 | 1.931 |
| 9.496736250555557 | 1.211 | 1.997 | 1.948 |
| 9.503479676944444 | 1.231 | 1.989 | 1.925 |
| 9.510316150000001 | 1.217 | 1.988 | 1.92 |
| 9.51705957861111 | 1.232 | 2.014 | 1.915 |
| 9.523925205277777 | 1.26 | 2.006 | 1.93 |
| 9.530699185833333 | 1.244 | 2.003 | 1.933 |
| 9.537518983055556 | 1.252 | 2.008 | 1.923 |
| 9.544293005277778 | 1.255 | 2.013 | 1.92 |
| 9.551097495555556 | 1.25 | 2.016 | 1.925 |
| 9.557886743333333 | 1.252 | 2.016 | 1.935 |
| 9.564706571666665 | 1.257 | 2.008 | 1.946 |
| 9.571480531944445 | 1.265 | 2.018 | 1.935 |
| 9.578255903611112 | 1.262 | 2.041 | 1.951 |
| 9.58506043138889 | 1.262 | 2.049 | 1.953 |
| 9.591849688333333 | 1.265 | 2.021 | 1.92 |
| 9.598593102499999 | 1.26 | 2.013 | 1.946 |
| 9.605474019722221 | 1.262 | 2.031 | 1.961 |
| 9.612247994722223 | 1.28 | 2.031 | 1.938 |
| 9.619067792222223 | 1.285 | 2.013 | 1.935 |
| 9.625811225 | 1.252 | 2.026 | 1.963 |
| 9.632692135277777 | 1.267 | 2.039 | 1.943 |
| 9.639481384444446 | 1.278 | 2.054 | 1.953 |
| 9.646256751666666 | 1.288 | 2.041 | 1.966 |
| 9.653030730555555 | 1.259 | 2.024 | 1.933 |
| 9.659819990833334 | 1.255 | 2.014 | 1.94 |
| 9.666670339722224 | 1.192 | 1.967 | 1.886 |
| 9.673444311944445 | 1.205 | 1.988 | 1.901 |
| 9.680248845833333 | 1.194 | 1.962 | 1.909 |
| 9.687022822222223 | 1.21 | 1.969 | 1.891 |
| 9.693827348055555 | 1.215 | 1.979 | 1.888 |
| 9.70058605 | 1.206 | 1.985 | 1.909 |
| 9.707497509444444 | 1.238 | 1.999 | 1.911 |
| 9.7142270525 | 1.228 | 2.007 | 1.911 |
| 9.720985748888888 | 1.238 | 1.999 | 1.916 |
| 9.727836121944444 | 1.238 | 1.994 | 1.906 |
| 9.73464064888889 | 1.233 | 1.997 | 1.901 |
| 9.741445169722223 | 1.243 | 1.989 | 1.904 |
| 9.748188595277778 | 1.22 | 1.994 | 1.904 |
| 9.754947301388889 | 1.241 | 1.992 | 1.924 |
| 9.761797654444443 | 1.241 | 1.999 | 1.898 |
| 9.768571634166666 | 1.228 | 1.992 | 1.911 |
| 9.775421986666666 | 1.236 | 1.989 | 1.926 |
| 9.78219735 | 1.23 | 2.004 | 1.921 |
| 9.7890018825 | 1.243 | 1.994 | 1.932 |
| 9.795745304166667 | 1.241 | 1.984 | 1.919 |
| 9.802519280277778 | 1.256 | 1.989 | 1.924 |
| 9.809415467222223 | 1.23 | 2.002 | 1.937 |
| 9.816189452222222 | 1.246 | 2.027 | 1.942 |
| 9.822993981666666 | 1.246 | 2.012 | 1.921 |
| 9.829783231944445 | 1.256 | 2.015 | 1.921 |
| 9.836618304444444 | 1.241 | 2.012 | 1.929 |
| 9.843346457222223 | 1.239 | 2.007 | 1.919 |
| 9.850121846666667 | 1.238 | 2 | 1.913 |
| 9.856926364722222 | 1.171 | 1.943 | 1.877 |
| 9.863761435277778 | 1.164 | 1.943 | 1.877 |
| 9.870565968055557 | 1.18 | 1.953 | 1.872 |
| 9.877324668055556 | 1.177 | 1.962 | 1.887 |
| 9.884144471666668 | 1.172 | 1.95 | 1.872 |
| 9.890903174444446 | 1.199 | 1.955 | 1.864 |
| 9.897768801944444 | 1.206 | 1.955 | 1.869 |
| 9.904496985277778 | 1.206 | 1.95 | 1.872 |
| 9.911332036111112 | 1.201 | 1.934 | 1.905 |
| 9.918122689722223 | 1.201 | 1.967 | 1.887 |
| 9.924957851666667 | 1.186 | 1.975 | 1.89 |
| 9.931731729722223 | 1.204 | 1.972 | 1.874 |
| 9.938566819166667 | 1.211 | 1.967 | 1.91 |
| 9.945340794444444 | 1.214 | 1.955 | 1.882 |
| 9.952114782777777 | 1.217 | 1.97 | 1.877 |
| 9.958919295833335 | 1.194 | 1.965 | 1.895 |
| 9.965723831111111 | 1.196 | 1.975 | 1.897 |
| 9.972528354166668 | 1.211 | 1.96 | 1.882 |
| 9.979302333055555 | 1.219 | 1.972 | 1.89 |
| 9.98610824638889 | 1.219 | 1.972 | 1.905 |
| 9.99288223 | 1.217 | 1.975 | 1.892 |
| 9.999686756666668 | 1.214 | 1.985 | 1.91 |
| 10.006506563055554 | 1.217 | 1.98 | 1.897 |
| 10.013265273611111 | 1.209 | 1.985 | 1.892 |
| 10.020100345277777 | 1.222 | 1.978 | 1.905 |
| 10.026889597777778 | 1.219 | 1.988 | 1.92 |
| 10.033663575833334 | 1.227 | 1.98 | 1.912 |
| 10.040437569166667 | 1.21 | 1.97 | 1.887 |
| 10.047272631388887 | 1.21 | 1.975 | 1.905 |
| 10.0540938425 | 1.203 | 1.945 | 1.874 |
| 10.060867808888888 | 1.185 | 1.962 | 1.891 |
| 10.067641779166667 | 1.148 | 1.925 | 1.855 |
| 10.074507414166668 | 1.163 | 1.922 | 1.855 |
| 10.081281393333335 | 1.154 | 1.915 | 1.873 |
| 10.088085919444444 | 1.164 | 1.937 | 1.842 |
| 10.094859925000002 | 1.168 | 1.923 | 1.873 |
| 10.101679705833334 | 1.149 | 1.941 | 1.835 |
| 10.108438410833333 | 1.172 | 1.923 | 1.86 |
| 10.115227666111112 | 1.169 | 1.953 | 1.847 |
| 10.122048848055554 | 1.159 | 1.938 | 1.845 |
| 10.128822830277779 | 1.164 | 1.938 | 1.85 |
| 10.135673184444444 | 1.185 | 1.951 | 1.86 |
| 10.142431887777779 | 1.185 | 1.938 | 1.855 |
| 10.149266968055555 | 1.18 | 1.93 | 1.86 |
| 10.15604095972222 | 1.175 | 1.93 | 1.863 |
| 10.162814924444445 | 1.18 | 1.941 | 1.873 |
| 10.169588896388888 | 1.18 | 1.946 | 1.847 |
| 10.176393435555555 | 1.195 | 1.946 | 1.853 |
| 10.18321323888889 | 1.175 | 1.933 | 1.868 |
| 10.190019159166667 | 1.187 | 1.943 | 1.876 |
| 10.196793123055555 | 1.21 | 1.936 | 1.873 |
| 10.203643493055555 | 1.187 | 1.941 | 1.865 |
| 10.210463282500001 | 1.185 | 1.938 | 1.873 |
| 10.217267815 | 1.185 | 1.946 | 1.876 |
| 10.223995988333334 | 1.18 | 1.948 | 1.87 |
| 10.230769945833332 | 1.18 | 1.936 | 1.87 |
| 10.237635575833334 | 1.2 | 1.941 | 1.878 |
| 10.244363738888888 | 1.185 | 1.948 | 1.87 |
| 10.251152974444445 | 1.215 | 1.956 | 1.881 |
| 10.258019995277778 | 1.2 | 1.938 | 1.886 |
| 10.264870370555556 | 1.17 | 1.963 | 1.898 |
| 10.27159851611111 | 1.166 | 1.936 | 1.87 |
| 10.278372485 | 1.182 | 1.959 | 1.87 |
| 10.285161746111111 | 1.162 | 1.934 | 1.857 |
| 10.29195099638889 | 1.134 | 1.894 | 1.849 |
| 10.298786079444445 | 1.135 | 1.896 | 1.826 |
| 10.305621161666666 | 1.125 | 1.883 | 1.831 |
| 10.31239520611111 | 1.141 | 1.892 | 1.808 |
| 10.319153830277777 | 1.125 | 1.895 | 1.836 |
| 10.325959756944444 | 1.15 | 1.909 | 1.831 |
| 10.332779556944445 | 1.125 | 1.904 | 1.803 |
| 10.339553530833333 | 1.135 | 1.904 | 1.828 |
| 10.346327521944444 | 1.13 | 1.906 | 1.844 |
| 10.353177874444443 | 1.148 | 1.896 | 1.846 |
| 10.359967112222222 | 1.153 | 1.906 | 1.833 |
| 10.366771646388889 | 1.145 | 1.911 | 1.816 |
| 10.373545640833333 | 1.133 | 1.906 | 1.839 |
| 10.38038071861111 | 1.168 | 1.916 | 1.828 |
| 10.387154694444444 | 1.138 | 1.901 | 1.839 |
| 10.393945343611112 | 1.153 | 1.916 | 1.833 |
| 10.400704036666665 | 1.153 | 1.888 | 1.856 |
| 10.407508561666667 | 1.158 | 1.904 | 1.836 |
| 10.41434363527778 | 1.14 | 1.899 | 1.826 |
| 10.421117616944445 | 1.15 | 1.909 | 1.844 |
| 10.427891601944443 | 1.155 | 1.909 | 1.828 |
| 10.434726669444444 | 1.153 | 1.922 | 1.846 |
| 10.441515927777777 | 1.153 | 1.929 | 1.844 |
| 10.448305192777779 | 1.143 | 1.906 | 1.844 |
| 10.455124991944444 | 1.166 | 1.919 | 1.836 |
| 10.461900374444445 | 1.161 | 1.927 | 1.854 |
| 10.468735435277779 | 1.148 | 1.927 | 1.856 |
| 10.475524688888889 | 1.148 | 1.901 | 1.839 |
| 10.482268112777778 | 1.161 | 1.904 | 1.821 |
| 10.489072639444446 | 1.158 | 1.924 | 1.844 |
| 10.495907718333333 | 1.148 | 1.932 | 1.862 |
| 10.50268176888889 | 1.153 | 1.937 | 1.844 |
| 10.509501511111111 | 1.176 | 1.927 | 1.841 |
| 10.516290759166667 | 1.168 | 1.924 | 1.867 |
| 10.523110554722223 | 1.133 | 1.899 | 1.82 |
| 10.529901215555554 | 1.151 | 1.911 | 1.833 |
| 10.536736277777777 | 1.119 | 1.893 | 1.812 |
| 10.543479715555556 | 1.075 | 1.858 | 1.797 |
| 10.550253693333334 | 1.094 | 1.863 | 1.796 |
| 10.557073501944444 | 1.077 | 1.858 | 1.796 |
| 10.563847470833334 | 1.072 | 1.852 | 1.794 |
| 10.5706520075 | 1.084 | 1.841 | 1.796 |
| 10.5774259725 | 1.088 | 1.856 | 1.779 |
| 10.584230508333333 | 1.091 | 1.854 | 1.786 |
| 10.591096142222222 | 1.08 | 1.856 | 1.794 |
| 10.597871495555555 | 1.119 | 1.879 | 1.784 |
| 10.604614929722223 | 1.121 | 1.857 | 1.789 |
| 10.611480563333332 | 1.111 | 1.867 | 1.799 |
| 10.618269815833333 | 1.101 | 1.877 | 1.791 |
| 10.625028516666665 | 1.093 | 1.862 | 1.799 |
| 10.631817768333333 | 1.108 | 1.872 | 1.794 |
| 10.638622292222221 | 1.121 | 1.872 | 1.796 |
| 10.645396278055555 | 1.103 | 1.882 | 1.786 |
| 10.652231360833333 | 1.124 | 1.874 | 1.804 |
| 10.65900534611111 | 1.116 | 1.862 | 1.814 |
| 10.665841805555555 | 1.116 | 1.892 | 1.794 |
| 10.672615783888888 | 1.126 | 1.9 | 1.802 |
| 10.679435584166667 | 1.098 | 1.877 | 1.799 |
| 10.686209566944445 | 1.124 | 1.895 | 1.799 |
| 10.692983544444445 | 1.106 | 1.877 | 1.804 |
| 10.699833896388888 | 1.106 | 1.862 | 1.814 |
| 10.706607870833333 | 1.129 | 1.895 | 1.822 |
| 10.71338186 | 1.116 | 1.887 | 1.802 |
| 10.720216929166666 | 1.126 | 1.882 | 1.794 |
| 10.72700618611111 | 1.121 | 1.892 | 1.819 |
| 10.733825994166667 | 1.111 | 1.897 | 1.814 |
| 10.740601377777779 | 1.119 | 1.887 | 1.817 |
| 10.747375341666666 | 1.119 | 1.895 | 1.807 |
| 10.754149312222223 | 1.131 | 1.887 | 1.804 |
| 10.761014952222222 | 1.126 | 1.895 | 1.809 |
| 10.767819471388888 | 1.126 | 1.877 | 1.804 |
| 10.774562915 | 1.117 | 1.882 | 1.812 |
| 10.781352155 | 1.129 | 1.887 | 1.809 |
| 10.788171959722222 | 1.086 | 1.865 | 1.781 |
| 10.794976484166666 | 1.078 | 1.833 | 1.773 |
| 10.801767142777777 | 1.07 | 1.853 | 1.78 |
| 10.808541111111111 | 1.051 | 1.816 | 1.747 |
| 10.81534564 | 1.052 | 1.83 | 1.744 |
| 10.822150159444446 | 1.048 | 1.833 | 1.775 |
| 10.828939425 | 1.037 | 1.844 | 1.749 |
| 10.835759236666666 | 1.06 | 1.831 | 1.757 |
| 10.842533197777778 | 1.053 | 1.826 | 1.744 |
| 10.849353010555555 | 1.084 | 1.818 | 1.757 |
| 10.856142253333333 | 1.068 | 1.822 | 1.77 |
| 10.862916247222222 | 1.091 | 1.837 | 1.767 |
| 10.869766603611112 | 1.089 | 1.827 | 1.772 |
| 10.876572511944444 | 1.074 | 1.832 | 1.744 |
| 10.883377033611112 | 1.061 | 1.815 | 1.754 |
| 10.890151018055555 | 1.079 | 1.845 | 1.775 |
| 10.896909719166668 | 1.066 | 1.848 | 1.775 |
| 10.90371425 | 1.074 | 1.85 | 1.747 |
| 10.910488221111112 | 1.079 | 1.83 | 1.752 |
| 10.917323306944445 | 1.071 | 1.815 | 1.767 |
| 10.924112556944443 | 1.069 | 1.837 | 1.775 |
| 10.930947640277777 | 1.071 | 1.855 | 1.765 |
| 10.937736983611112 | 1.094 | 1.84 | 1.762 |
| 10.944542810833335 | 1.087 | 1.837 | 1.783 |
| 10.951377893333333 | 1.082 | 1.843 | 1.757 |
| 10.958090768055555 | 1.079 | 1.855 | 1.77 |
| 10.964895291944446 | 1.084 | 1.853 | 1.765 |
| 10.971715089722222 | 1.079 | 1.848 | 1.777 |
| 10.978473810555556 | 1.087 | 1.835 | 1.775 |
| 10.98530887611111 | 1.084 | 1.858 | 1.78 |
| 10.992082861666667 | 1.084 | 1.843 | 1.754 |
| 10.998887382777777 | 1.097 | 1.855 | 1.772 |
| 11.005753012777777 | 1.094 | 1.832 | 1.793 |
| 11.01246727611111 | 1.089 | 1.843 | 1.777 |
| 11.01927181527778 | 1.094 | 1.86 | 1.762 |
| 11.026045786666668 | 1.084 | 1.848 | 1.78 |
| 11.032850330833332 | 1.061 | 1.836 | 1.785 |
| 11.039654851944446 | 1.042 | 1.816 | 1.746 |
| 11.046489922777779 | 1.006 | 1.771 | 1.718 |
| 11.053263904722222 | 1.001 | 1.806 | 1.733 |
| 11.060037894166667 | 1.022 | 1.793 | 1.728 |
| 11.0668882375 | 1.006 | 1.765 | 1.715 |
| 11.073662240555556 | 1.029 | 1.794 | 1.717 |
| 11.0804681525 | 1.017 | 1.783 | 1.72 |
| 11.087257393333333 | 1.037 | 1.801 | 1.723 |
| 11.094031367500001 | 1.029 | 1.811 | 1.728 |
| 11.10083589638889 | 1.045 | 1.811 | 1.712 |
| 11.107609874166666 | 1.042 | 1.79 | 1.715 |
| 11.114444962222223 | 1.032 | 1.795 | 1.73 |
| 11.121249498055555 | 1.05 | 1.816 | 1.72 |
| 11.128023478333333 | 1.027 | 1.806 | 1.728 |
| 11.134797443333332 | 1.04 | 1.788 | 1.725 |
| 11.141603360555555 | 1.04 | 1.788 | 1.71 |
| 11.148453701388888 | 1.045 | 1.808 | 1.738 |
| 11.155212425555556 | 1.042 | 1.821 | 1.74 |
| 11.161986392777779 | 1.027 | 1.793 | 1.723 |
| 11.168836760555557 | 1.032 | 1.788 | 1.73 |
| 11.175610719166666 | 1.047 | 1.811 | 1.738 |
| 11.182415250277778 | 1.037 | 1.811 | 1.723 |
| 11.189204511666667 | 1.04 | 1.803 | 1.743 |
| 11.196024301666668 | 1.045 | 1.803 | 1.735 |
| 11.202813564166668 | 1.037 | 1.816 | 1.723 |
| 11.209618089722222 | 1.045 | 1.806 | 1.738 |
| 11.21639345888889 | 1.047 | 1.811 | 1.733 |
| 11.223167444722222 | 1.045 | 1.818 | 1.733 |
| 11.230017879444445 | 1.055 | 1.808 | 1.756 |
| 11.236807046388888 | 1.033 | 1.795 | 1.738 |
| 11.24361157888889 | 1.027 | 1.813 | 1.748 |
| 11.250385567222223 | 1.006 | 1.762 | 1.714 |
| 11.257159539166667 | 1.029 | 1.784 | 1.725 |
| 11.263964071388889 | 1.004 | 1.778 | 1.686 |
| 11.270799144722224 | 0.983 | 1.751 | 1.688 |
| 11.277573114166666 | 0.957 | 1.756 | 1.691 |
| 11.284363761111113 | 1.001 | 1.746 | 1.693 |
| 11.291183557222222 | 1 | 1.753 | 1.683 |
| 11.297957543888888 | 0.994 | 1.784 | 1.673 |
| 11.304777344722222 | 0.982 | 1.764 | 1.691 |
| 11.311551326944443 | 1.003 | 1.764 | 1.678 |
| 11.31838643138889 | 0.993 | 1.759 | 1.691 |
| 11.325175650833332 | 1 | 1.759 | 1.706 |
| 11.331995477777777 | 0.998 | 1.761 | 1.696 |
| 11.338769433333333 | 1 | 1.774 | 1.691 |
| 11.345543413055555 | 1.003 | 1.764 | 1.673 |
| 11.352318782222222 | 1 | 1.774 | 1.688 |
| 11.359108037777776 | 0.987 | 1.774 | 1.688 |
| 11.365912560833333 | 1 | 1.761 | 1.698 |
| 11.3727170925 | 1.018 | 1.779 | 1.691 |
| 11.379521627222223 | 1.008 | 1.776 | 1.701 |
| 11.38637198638889 | 0.998 | 1.764 | 1.701 |
| 11.393161309444444 | 1.005 | 1.787 | 1.724 |
| 11.399919931944444 | 1.013 | 1.776 | 1.678 |
| 11.406739740833332 | 1.013 | 1.769 | 1.696 |
| 11.413513714722223 | 1.01 | 1.779 | 1.721 |
| 11.420258536666667 | 1.008 | 1.794 | 1.706 |
| 11.427139443888889 | 1.018 | 1.771 | 1.711 |
| 11.433913419722222 | 1.021 | 1.774 | 1.701 |
| 11.440672121666667 | 1.013 | 1.779 | 1.703 |
| 11.447522483611111 | 1.023 | 1.776 | 1.719 |
| 11.454281190833333 | 1.01 | 1.794 | 1.706 |
| 11.4610857075 | 1.005 | 1.782 | 1.719 |
| 11.467844408055555 | 0.994 | 1.758 | 1.701 |
| 11.474725309166667 | 0.958 | 1.737 | 1.654 |
| 11.48149929 | 0.954 | 1.732 | 1.657 |
| 11.488335776388888 | 0.944 | 1.696 | 1.672 |
| 11.495063912222223 | 0.953 | 1.732 | 1.657 |
| 11.501929537777778 | 0.945 | 1.701 | 1.644 |
| 11.508672980833333 | 0.945 | 1.72 | 1.659 |
| 11.515462224722222 | 0.957 | 1.727 | 1.646 |
| 11.522266764722222 | 0.961 | 1.724 | 1.651 |
| 11.529056015 | 0.961 | 1.709 | 1.654 |
| 11.535830004166668 | 0.961 | 1.732 | 1.638 |
| 11.542619255555556 | 0.976 | 1.722 | 1.633 |
| 11.549454319444445 | 0.979 | 1.719 | 1.672 |
| 11.55624495638889 | 0.956 | 1.732 | 1.651 |
| 11.563095308888888 | 0.943 | 1.714 | 1.674 |
| 11.5698693025 | 0.966 | 1.727 | 1.638 |
| 11.576658546388888 | 0.966 | 1.727 | 1.661 |
| 11.583463066944445 | 0.958 | 1.722 | 1.679 |
| 11.59023705611111 | 0.956 | 1.734 | 1.672 |
| 11.597087468611111 | 0.974 | 1.75 | 1.664 |
| 11.603861388333332 | 0.958 | 1.724 | 1.659 |
| 11.610650634722221 | 0.961 | 1.737 | 1.659 |
| 11.617455165833306 | 0.974 | 1.755 | 1.659 |
| 11.624230536666667 | 0.974 | 1.745 | 1.661 |
| 11.631065612222223 | 0.989 | 1.747 | 1.667 |
| 11.637854876666667 | 0.963 | 1.752 | 1.674 |
| 11.644628844999971 | 0.971 | 1.74 | 1.679 |
| 11.651463936666666 | 0.974 | 1.742 | 1.684 |
| 11.658207345833333 | 0.966 | 1.742 | 1.669 |
| 11.665042431111111 | 0.966 | 1.734 | 1.669 |
| 11.671816418888888 | 0.994 | 1.747 | 1.646 |
| 11.678620953888888 | 0.971 | 1.745 | 1.677 |
| 11.68541029 | 0.955 | 1.725 | 1.638 |
| 11.692170288055555 | 0.916 | 1.688 | 1.628 |
| 11.698974814444444 | 0.927 | 1.693 | 1.612 |
| 11.705794614166665 | 0.901 | 1.673 | 1.62 |
| 11.712614425277778 | 0.921 | 1.705 | 1.622 |
| 11.71940367 | 0.901 | 1.677 | 1.617 |
| 11.726177655 | 0.92 | 1.682 | 1.602 |
| 11.732982180277777 | 0.911 | 1.688 | 1.596 |
| 11.73981726888889 | 0.914 | 1.687 | 1.609 |
| 11.746606517222222 | 0.937 | 1.692 | 1.627 |
| 11.753426315277776 | 0.911 | 1.682 | 1.612 |
| 11.76018641388889 | 0.937 | 1.703 | 1.63 |
| 11.76697565888889 | 0.929 | 1.695 | 1.596 |
| 11.773826031666667 | 0.916 | 1.698 | 1.602 |
| 11.780554169166667 | 0.916 | 1.687 | 1.625 |
| 11.787343513611113 | 0.921 | 1.71 | 1.617 |
| 11.794147955277777 | 0.921 | 1.7 | 1.609 |
| 11.800967750833333 | 0.916 | 1.692 | 1.612 |
| 11.807772281944445 | 0.919 | 1.698 | 1.607 |
| 11.814592089166666 | 0.921 | 1.703 | 1.63 |
| 11.821396619166666 | 0.934 | 1.692 | 1.632 |
| 11.828171985 | 0.937 | 1.692 | 1.63 |
| 11.835022345833334 | 0.934 | 1.703 | 1.632 |
| 11.841735214166667 | 0.929 | 1.718 | 1.635 |
| 11.848585573333335 | 0.944 | 1.71 | 1.627 |
| 11.855313729166667 | 0.929 | 1.703 | 1.642 |
| 11.862133531388888 | 0.926 | 1.713 | 1.637 |
| 11.868953327777778 | 0.932 | 1.71 | 1.617 |
| 11.875727317222223 | 0.929 | 1.692 | 1.637 |
| 11.882501281944444 | 0.921 | 1.718 | 1.625 |
| 11.889336371666666 | 0.949 | 1.708 | 1.637 |
| 11.896111730833333 | 0.939 | 1.715 | 1.642 |
| 11.902870475833334 | 0.942 | 1.7 | 1.619 |
| 11.909720786944444 | 0.921 | 1.708 | 1.63 |
| 11.916510050833333 | 0.924 | 1.713 | 1.635 |
| 11.923284028333335 | 0.927 | 1.684 | 1.619 |
| 11.930088560833333 | 0.906 | 1.688 | 1.617 |
| 11.936877811111112 | 0.899 | 1.67 | 1.596 |
| 11.943682337777776 | 0.865 | 1.635 | 1.575 |
| 11.950517418611112 | 0.841 | 1.646 | 1.56 |
| 11.957276124166667 | 0.883 | 1.65 | 1.58 |
| 11.964127856944446 | 0.863 | 1.655 | 1.575 |
| 11.970932399166665 | 0.879 | 1.65 | 1.572 |
| 11.977660555277778 | 0.879 | 1.648 | 1.56 |
| 11.984449796666667 | 0.897 | 1.661 | 1.588 |
| 11.991300147499999 | 0.884 | 1.658 | 1.58 |
| 11.998094991388887 | 0.884 | 1.655 | 1.585 |
| 12.0048939375 | 0.879 | 1.633 | 1.58 |
| 12.01166790611111 | 0.879 | 1.653 | 1.59 |
| 12.01848771138889 | 0.869 | 1.658 | 1.57 |
| 12.025261694444444 | 0.887 | 1.65 | 1.577 |
| 12.032067603888889 | 0.9 | 1.65 | 1.593 |
| 12.03885686611111 | 0.902 | 1.638 | 1.567 |
| 12.045691956666667 | 0.879 | 1.676 | 1.588 |
| 12.05246592111111 | 0.882 | 1.653 | 1.577 |
| 12.05931627388889 | 0.895 | 1.655 | 1.588 |
| 12.066044433055556 | 0.897 | 1.661 | 1.577 |
| 12.072833685833332 | 0.877 | 1.671 | 1.588 |
| 12.079607665 | 0.897 | 1.661 | 1.58 |
| 12.08642746111111 | 0.89 | 1.666 | 1.6 |
| 12.093262549166665 | 0.895 | 1.645 | 1.611 |
| 12.100068529722222 | 0.895 | 1.661 | 1.595 |
| 12.10684243861111 | 0.902 | 1.668 | 1.585 |
| 12.113631708888889 | 0.892 | 1.658 | 1.59 |
| 12.120451496388888 | 0.89 | 1.663 | 1.593 |
| 12.127194923333334 | 0.902 | 1.663 | 1.598 |
| 12.134060560833333 | 0.907 | 1.691 | 1.598 |
| 12.140819262777779 | 0.918 | 1.658 | 1.59 |
| 12.147577966666667 | 0.885 | 1.66 | 1.603 |
| 12.15438250138889 | 0.875 | 1.65 | 1.595 |
| 12.161217568333333 | 0.867 | 1.636 | 1.569 |
| 12.167992967222222 | 0.863 | 1.646 | 1.556 |
| 12.174797464722223 | 0.837 | 1.612 | 1.548 |
| 12.181571440277777 | 0.849 | 1.63 | 1.538 |
| 12.18840655888889 | 0.83 | 1.593 | 1.518 |
| 12.195149950555555 | 0.85 | 1.603 | 1.528 |
| 12.201954476666668 | 0.84 | 1.613 | 1.528 |
| 12.208774308055554 | 0.837 | 1.601 | 1.538 |
| 12.2155635375 | 0.835 | 1.624 | 1.546 |
| 12.222413897777777 | 0.85 | 1.621 | 1.541 |
| 12.229218421111112 | 0.832 | 1.619 | 1.546 |
| 12.235993790555556 | 0.855 | 1.619 | 1.541 |
| 12.242752487222221 | 0.842 | 1.601 | 1.525 |
| 12.249602841388889 | 0.855 | 1.619 | 1.533 |
| 12.256376829444445 | 0.86 | 1.608 | 1.535 |
| 12.263181345833333 | 0.842 | 1.606 | 1.563 |
| 12.26995533 | 0.86 | 1.613 | 1.571 |
| 12.276790417222223 | 0.85 | 1.611 | 1.548 |
| 12.283503285 | 0.845 | 1.631 | 1.553 |
| 12.290368913333333 | 0.847 | 1.626 | 1.563 |
| 12.297142894166667 | 0.845 | 1.616 | 1.563 |
| 12.303979359166666 | 0.853 | 1.626 | 1.558 |
| 12.310753349444443 | 0.85 | 1.626 | 1.553 |
| 12.317573149722222 | 0.858 | 1.611 | 1.556 |
| 12.324347139444445 | 0.847 | 1.606 | 1.558 |
| 12.331151648055556 | 0.865 | 1.629 | 1.563 |
| 12.337925627222223 | 0.863 | 1.629 | 1.546 |
| 12.344775994722221 | 0.845 | 1.621 | 1.558 |
| 12.351549974166666 | 0.865 | 1.621 | 1.546 |
| 12.358369771111112 | 0.85 | 1.629 | 1.571 |
| 12.365067373611112 | 0.845 | 1.636 | 1.558 |
| 12.371873285277777 | 0.873 | 1.649 | 1.546 |
| 12.378738916944444 | 0.841 | 1.629 | 1.566 |
| 12.385512896944444 | 0.843 | 1.624 | 1.548 |
| 12.392302154722222 | 0.796 | 1.582 | 1.529 |
| 12.399137224444445 | 0.794 | 1.569 | 1.517 |
| 12.4059112025 | 0.773 | 1.552 | 1.511 |
| 12.412715726944445 | 0.794 | 1.561 | 1.499 |
| 12.419504992777778 | 0.777 | 1.571 | 1.516 |
| 12.426294240277779 | 0.803 | 1.557 | 1.488 |
| 12.433068232222222 | 0.811 | 1.569 | 1.501 |
| 12.439919959166668 | 0.805 | 1.564 | 1.493 |
| 12.44669394722222 | 0.795 | 1.571 | 1.506 |
| 12.453498473611111 | 0.805 | 1.579 | 1.506 |
| 12.460272463055555 | 0.808 | 1.561 | 1.519 |
| 12.467092255833332 | 0.798 | 1.571 | 1.519 |
| 12.473866230555554 | 0.798 | 1.584 | 1.514 |
| 12.480686051666668 | 0.811 | 1.574 | 1.499 |
| 12.4875211075 | 0.818 | 1.592 | 1.511 |
| 12.494264551388888 | 0.813 | 1.589 | 1.516 |
| 12.50103851861111 | 0.798 | 1.569 | 1.509 |
| 12.50785971388889 | 0.8 | 1.584 | 1.509 |
| 12.514679515555555 | 0.803 | 1.584 | 1.527 |
| 12.521484041666668 | 0.798 | 1.569 | 1.499 |
| 12.528273299444445 | 0.803 | 1.582 | 1.511 |
| 12.535077852222223 | 0.805 | 1.589 | 1.504 |
| 12.541851805 | 0.813 | 1.582 | 1.499 |
| 12.548625789166666 | 0.813 | 1.597 | 1.506 |
| 12.55546089361111 | 0.803 | 1.579 | 1.514 |
| 12.562234841388888 | 0.798 | 1.571 | 1.506 |
| 12.569024091388888 | 0.808 | 1.594 | 1.511 |
| 12.5757994625 | 0.823 | 1.592 | 1.501 |
| 12.582634543611112 | 0.813 | 1.577 | 1.504 |
| 12.589439073333335 | 0.818 | 1.577 | 1.516 |
| 12.596243594166667 | 0.821 | 1.594 | 1.516 |
| 12.6030175775 | 0.813 | 1.582 | 1.527 |
| 12.609852658611112 | 0.808 | 1.605 | 1.514 |
| 12.616657195555554 | 0.808 | 1.572 | 1.503 |
| 12.623431166666666 | 0.813 | 1.577 | 1.529 |
| 12.63020515388889 | 0.764 | 1.53 | 1.477 |
| 12.637024942500002 | 0.759 | 1.55 | 1.472 |
| 12.643815595555557 | 0.746 | 1.517 | 1.49 |
| 12.650665943055555 | 0.758 | 1.528 | 1.469 |
| 12.657439922777778 | 0.757 | 1.527 | 1.469 |
| 12.664244444444444 | 0.758 | 1.517 | 1.462 |
| 12.671018428333332 | 0.762 | 1.517 | 1.462 |
| 12.677792407777776 | 0.767 | 1.535 | 1.454 |
| 12.684566384444445 | 0.758 | 1.496 | 1.462 |
| 12.691370917777778 | 0.753 | 1.555 | 1.467 |
| 12.698144896944443 | 0.763 | 1.537 | 1.462 |
| 12.705025801944444 | 0.758 | 1.535 | 1.459 |
| 12.711785884166666 | 0.758 | 1.537 | 1.462 |
| 12.71855986361111 | 0.748 | 1.54 | 1.454 |
| 12.725349120277778 | 0.753 | 1.535 | 1.464 |
| 12.732199479999998 | 0.769 | 1.55 | 1.444 |
| 12.7390192775 | 0.769 | 1.537 | 1.467 |
| 12.745839086388887 | 0.769 | 1.55 | 1.464 |
| 12.752613059166666 | 0.769 | 1.54 | 1.467 |
| 12.759417588333333 | 0.761 | 1.535 | 1.467 |
| 12.766176296388888 | 0.774 | 1.54 | 1.454 |
| 12.772965551111112 | 0.763 | 1.535 | 1.49 |
| 12.779771458611112 | 0.776 | 1.535 | 1.469 |
| 12.786545436666666 | 0.774 | 1.529 | 1.472 |
| 12.793319425833335 | 0.766 | 1.532 | 1.467 |
| 12.800185053611111 | 0.774 | 1.55 | 1.457 |
| 12.8069590525 | 0.763 | 1.537 | 1.467 |
| 12.813840020277778 | 0.769 | 1.529 | 1.472 |
| 12.820506994166667 | 0.771 | 1.55 | 1.467 |
| 12.827342079722195 | 0.774 | 1.524 | 1.479 |
| 12.834100770000001 | 0.766 | 1.519 | 1.479 |
| 12.840920603055554 | 0.769 | 1.537 | 1.482 |
| 12.847741759166666 | 0.781 | 1.532 | 1.469 |
| 12.854469918333333 | 0.779 | 1.55 | 1.485 |
| 12.861289721944445 | 0.757 | 1.534 | 1.482 |
| 12.868140074722222 | 0.761 | 1.56 | 1.492 |
| 12.874914049444417 | 0.772 | 1.545 | 1.477 |
| 12.881733861111112 | 0.721 | 1.521 | 1.453 |
| 12.888507831944445 | 0.75 | 1.51 | 1.443 |
| 12.89528180888886 | 0.693 | 1.499 | 1.44 |
| 12.902086346944444 | 0.702 | 1.491 | 1.427 |
| 12.908951977777779 | 0.713 | 1.507 | 1.438 |
| 12.915712068888888 | 0.709 | 1.491 | 1.404 |
| 12.92248605888889 | 0.727 | 1.48 | 1.437 |
| 12.9292600175 | 0.721 | 1.472 | 1.409 |
| 12.936171473611111 | 0.711 | 1.493 | 1.432 |
| 12.942914917222222 | 0.714 | 1.495 | 1.43 |
| 12.949719435277778 | 0.721 | 1.49 | 1.422 |
| 12.956478139722222 | 0.706 | 1.493 | 1.425 |
| 12.963252112777779 | 0.709 | 1.51 | 1.43 |
| 12.970117745833333 | 0.714 | 1.495 | 1.402 |
| 12.976891728888889 | 0.724 | 1.48 | 1.43 |
| 12.983667090833332 | 0.721 | 1.498 | 1.414 |
| 12.990502188611112 | 0.709 | 1.495 | 1.44 |
| 12.99729141777778 | 0.732 | 1.5 | 1.427 |
| 13.004095960277777 | 0.729 | 1.493 | 1.425 |
| 13.010885196666667 | 0.719 | 1.482 | 1.44 |
| 13.017643908611111 | 0.724 | 1.508 | 1.443 |
| 13.024494261666668 | 0.734 | 1.505 | 1.427 |
| 13.031252965277778 | 0.732 | 1.495 | 1.422 |
| 13.038042222777777 | 0.734 | 1.503 | 1.432 |
| 13.044892575833334 | 0.719 | 1.495 | 1.432 |
| 13.051652673888889 | 0.737 | 1.495 | 1.417 |
| 13.058457225 | 0.716 | 1.493 | 1.422 |
| 13.065231191388888 | 0.734 | 1.498 | 1.443 |
| 13.072020433611112 | 0.737 | 1.516 | 1.432 |
| 13.0787944 | 0.721 | 1.49 | 1.432 |
| 13.085629476666666 | 0.734 | 1.49 | 1.437 |
| 13.092434018333334 | 0.744 | 1.508 | 1.445 |
| 13.099207982222223 | 0.732 | 1.49 | 1.417 |
| 13.106058368333333 | 0.732 | 1.508 | 1.427 |
| 13.11278649722222 | 0.719 | 1.503 | 1.45 |
| 13.119592418611111 | 0.737 | 1.495 | 1.44 |
| 13.126396943888862 | 0.719 | 1.495 | 1.43 |
| 13.133247292777778 | 0.716 | 1.475 | 1.406 |
| 13.13997545111111 | 0.654 | 1.466 | 1.393 |
| 13.146825808611112 | 0.663 | 1.453 | 1.386 |
| 13.153584510277778 | 0.661 | 1.451 | 1.38 |
| 13.160434873611111 | 0.651 | 1.447 | 1.36 |
| 13.167224116944444 | 0.658 | 1.443 | 1.367 |
| 13.173998087777777 | 0.674 | 1.44 | 1.367 |
| 13.180772170277779 | 0.669 | 1.451 | 1.372 |
| 13.18760714611111 | 0.664 | 1.463 | 1.38 |
| 13.1943978 | 0.674 | 1.435 | 1.372 |
| 13.201202331666666 | 0.685 | 1.438 | 1.383 |
| 13.207991583888889 | 0.674 | 1.448 | 1.383 |
| 13.214765558888889 | 0.659 | 1.456 | 1.388 |
| 13.22157010888889 | 0.662 | 1.43 | 1.38 |
| 13.228344059722222 | 0.664 | 1.448 | 1.378 |
| 13.235148591388889 | 0.69 | 1.453 | 1.383 |
| 13.241953124444445 | 0.674 | 1.44 | 1.388 |
| 13.248742384444446 | 0.679 | 1.458 | 1.365 |
| 13.255592730555556 | 0.656 | 1.445 | 1.37 |
| 13.262368094166666 | 0.672 | 1.443 | 1.372 |
| 13.269203174166666 | 0.662 | 1.463 | 1.39 |
| 13.275977154166666 | 0.679 | 1.458 | 1.378 |
| 13.28275114 | 0.685 | 1.458 | 1.401 |
| 13.289555662222222 | 0.692 | 1.456 | 1.383 |
| 13.296329652222221 | 0.677 | 1.451 | 1.367 |
| 13.303149444444445 | 0.662 | 1.463 | 1.403 |
| 13.309923414722222 | 0.667 | 1.451 | 1.39 |
| 13.316743224166668 | 0.664 | 1.458 | 1.39 |
| 13.323578304166666 | 0.674 | 1.451 | 1.39 |
| 13.330353669166666 | 0.682 | 1.463 | 1.385 |
| 13.337142939444444 | 0.674 | 1.456 | 1.38 |
| 13.343947471666667 | 0.677 | 1.451 | 1.38 |
| 13.3507214275 | 0.685 | 1.453 | 1.39 |
| 13.357571786944446 | 0.687 | 1.448 | 1.403 |
| 13.364345761944444 | 0.687 | 1.466 | 1.39 |
| 13.371119830555555 | 0.664 | 1.448 | 1.39 |
| 13.377847899444445 | 0.661 | 1.436 | 1.364 |
| 13.384713522777778 | 0.622 | 1.424 | 1.349 |
| 13.39151804277778 | 0.634 | 1.426 | 1.351 |
| 13.398278140833305 | 0.604 | 1.37 | 1.343 |
| 13.405067398888889 | 0.612 | 1.37 | 1.323 |
| 13.411887198055556 | 0.603 | 1.409 | 1.323 |
| 13.418691735277777 | 0.632 | 1.403 | 1.31 |
| 13.425465710555555 | 0.628 | 1.391 | 1.343 |
| 13.432331338333334 | 0.627 | 1.411 | 1.346 |
| 13.439105313333334 | 0.648 | 1.416 | 1.338 |
| 13.445909840277778 | 0.627 | 1.403 | 1.325 |
| 13.452668548888889 | 0.632 | 1.396 | 1.323 |
| 13.459443934166666 | 0.625 | 1.409 | 1.351 |
| 13.466294271944443 | 0.617 | 1.406 | 1.32 |
| 13.473098800277777 | 0.643 | 1.416 | 1.328 |
| 13.479872776111112 | 0.63 | 1.401 | 1.325 |
| 13.486677316666666 | 0.635 | 1.406 | 1.336 |
| 13.493451288333333 | 0.627 | 1.401 | 1.348 |
| 13.500286367222222 | 0.645 | 1.409 | 1.333 |
| 13.50706034388889 | 0.627 | 1.419 | 1.328 |
| 13.513849601944445 | 0.632 | 1.403 | 1.333 |
| 13.520699951666668 | 0.635 | 1.396 | 1.341 |
| 13.527458656666667 | 0.643 | 1.414 | 1.336 |
| 13.5342492925 | 0.643 | 1.409 | 1.323 |
| 13.541053824999999 | 0.63 | 1.396 | 1.343 |
| 13.547827806944444 | 0.632 | 1.396 | 1.338 |
| 13.554678156944444 | 0.65 | 1.414 | 1.338 |
| 13.561467410555556 | 0.632 | 1.414 | 1.341 |
| 13.568333035555556 | 0.627 | 1.411 | 1.343 |
| 13.575000088888888 | 0.645 | 1.421 | 1.351 |
| 13.581865719166668 | 0.627 | 1.398 | 1.351 |
| 13.588670250833333 | 0.648 | 1.409 | 1.346 |
| 13.595490061666666 | 0.643 | 1.409 | 1.361 |
| 13.602234873333334 | 0.643 | 1.416 | 1.359 |
| 13.608993574722222 | 0.65 | 1.429 | 1.343 |
| 13.615813403333332 | 0.618 | 1.411 | 1.341 |
| 13.622633174444443 | 0.635 | 1.416 | 1.356 |
| 13.629407165833333 | 0.611 | 1.397 | 1.335 |
| 13.636196415833332 | 0.616 | 1.381 | 1.33 |
| 13.642970391666667 | 0.619 | 1.393 | 1.327 |
| 13.649836025833306 | 0.59 | 1.363 | 1.296 |
| 13.656640544999998 | 0.574 | 1.369 | 1.288 |
| 13.663414527222223 | 0.589 | 1.344 | 1.288 |
| 13.670205169166668 | 0.59 | 1.356 | 1.278 |
| 13.676963890833333 | 0.592 | 1.344 | 1.286 |
| 13.683783685 | 0.575 | 1.364 | 1.291 |
| 13.690618789444445 | 0.595 | 1.341 | 1.301 |
| 13.697423282499999 | 0.585 | 1.354 | 1.288 |
| 13.704182001388888 | 0.588 | 1.344 | 1.278 |
| 13.710971253055554 | 0.58 | 1.354 | 1.291 |
| 13.717745219166668 | 0.58 | 1.354 | 1.273 |
| 13.724595573333305 | 0.567 | 1.356 | 1.288 |
| 13.731369554166667 | 0.583 | 1.374 | 1.291 |
| 13.738129636944445 | 0.593 | 1.369 | 1.309 |
| 13.744949452222194 | 0.585 | 1.367 | 1.288 |
| 13.751769258055555 | 0.595 | 1.374 | 1.314 |
| 13.758573777777777 | 0.572 | 1.369 | 1.314 |
| 13.765378305833332 | 0.567 | 1.364 | 1.291 |
| 13.772121740833335 | 0.593 | 1.364 | 1.286 |
| 13.7789262675 | 0.603 | 1.359 | 1.311 |
| 13.785746077222221 | 0.59 | 1.356 | 1.294 |
| 13.792520050277778 | 0.595 | 1.356 | 1.294 |
| 13.799324571666638 | 0.59 | 1.354 | 1.288 |
| 13.8061763175 | 0.606 | 1.361 | 1.294 |
| 13.812919745277776 | 0.565 | 1.369 | 1.301 |
| 13.819724279722221 | 0.608 | 1.361 | 1.311 |
| 13.826544085833332 | 0.58 | 1.372 | 1.286 |
| 13.8333638875 | 0.585 | 1.364 | 1.299 |
| 13.840198975833333 | 0.58 | 1.359 | 1.317 |
| 13.846927118055556 | 0.598 | 1.364 | 1.306 |
| 13.8537010925 | 0.572 | 1.349 | 1.299 |
| 13.86047507 | 0.595 | 1.359 | 1.301 |
| 13.867325435277778 | 0.585 | 1.369 | 1.291 |
| 13.874131343333334 | 0.603 | 1.367 | 1.294 |
| 13.880905333055555 | 0.606 | 1.361 | 1.309 |
| 13.887679303888888 | 0.566 | 1.339 | 1.288 |
| 13.894499105555555 | 0.595 | 1.364 | 1.286 |
| 13.901318921666668 | 0.56 | 1.329 | 1.267 |
| 13.908092895277779 | 0.545 | 1.327 | 1.265 |
| 13.914927981388889 | 0.533 | 1.316 | 1.236 |
| 13.92170194527775 | 0.532 | 1.314 | 1.241 |
| 13.928491202777778 | 0.532 | 1.302 | 1.257 |
| 13.935265176111082 | 0.552 | 1.309 | 1.244 |
| 13.942116919444445 | 0.548 | 1.296 | 1.249 |
| 13.948890893055555 | 0.52 | 1.299 | 1.231 |
| 13.95574126888889 | 0.536 | 1.317 | 1.259 |
| 13.962454127777779 | 0.525 | 1.317 | 1.246 |
| 13.969243378611111 | 0.523 | 1.302 | 1.257 |
| 13.976078467222223 | 0.538 | 1.309 | 1.231 |
| 13.98288299 | 0.548 | 1.304 | 1.246 |
| 13.989656977222223 | 0.548 | 1.307 | 1.241 |
| 13.996492052222223 | 0.531 | 1.304 | 1.239 |
| 14.003281298055555 | 0.551 | 1.317 | 1.249 |
| 14.010087223888888 | 0.531 | 1.302 | 1.252 |
| 14.016861198055556 | 0.538 | 1.325 | 1.236 |
| 14.02363518361111 | 0.536 | 1.317 | 1.231 |
| 14.030439802777778 | 0.523 | 1.314 | 1.244 |
| 14.037213680833334 | 0.546 | 1.312 | 1.254 |
| 14.044048768888889 | 0.548 | 1.319 | 1.246 |
| 14.0508227425 | 0.538 | 1.335 | 1.257 |
| 14.057673096944445 | 0.559 | 1.312 | 1.257 |
| 14.064431808055556 | 0.543 | 1.33 | 1.229 |
| 14.07123632861111 | 0.559 | 1.317 | 1.241 |
| 14.078011703055555 | 0.533 | 1.312 | 1.236 |
| 14.084846783333333 | 0.541 | 1.317 | 1.259 |
| 14.091651315 | 0.528 | 1.332 | 1.241 |
| 14.098455835833335 | 0.52 | 1.309 | 1.223 |
| 14.105229828333334 | 0.533 | 1.317 | 1.246 |
| 14.112003780555556 | 0.541 | 1.314 | 1.252 |
| 14.118762499166666 | 0.543 | 1.307 | 1.244 |
| 14.125582289444445 | 0.554 | 1.309 | 1.246 |
| 14.132417379166666 | 0.536 | 1.325 | 1.249 |
| 14.139191354166668 | 0.546 | 1.327 | 1.254 |
| 14.146058372777778 | 0.541 | 1.319 | 1.246 |
| 14.152832354444444 | 0.5 | 1.279 | 1.225 |
| 14.159606338611113 | 0.491 | 1.275 | 1.212 |
| 14.166380304444445 | 0.483 | 1.262 | 1.205 |
| 14.173154282222221 | 0.484 | 1.252 | 1.176 |
| 14.179958849166638 | 0.484 | 1.262 | 1.187 |
| 14.1867938925 | 0.501 | 1.257 | 1.187 |
| 14.193598432777778 | 0.489 | 1.254 | 1.194 |
| 14.200372394722223 | 0.481 | 1.267 | 1.202 |
| 14.207146385833335 | 0.489 | 1.272 | 1.192 |
| 14.21399811888889 | 0.491 | 1.272 | 1.181 |
| 14.220802736944444 | 0.501 | 1.275 | 1.189 |
| 14.227591908888888 | 0.476 | 1.28 | 1.192 |
| 14.234365879166667 | 0.494 | 1.28 | 1.21 |
| 14.241139860555554 | 0.499 | 1.244 | 1.215 |
| 14.247959660000001 | 0.481 | 1.257 | 1.202 |
| 14.254733640833333 | 0.504 | 1.27 | 1.197 |
| 14.261507615 | 0.476 | 1.285 | 1.207 |
| 14.2683121575 | 0.489 | 1.267 | 1.215 |
| 14.275162504444443 | 0.494 | 1.27 | 1.189 |
| 14.281922600833333 | 0.499 | 1.275 | 1.204 |
| 14.288757686944443 | 0.499 | 1.26 | 1.202 |
| 14.295531651388888 | 0.496 | 1.249 | 1.21 |
| 14.302305623055554 | 0.494 | 1.27 | 1.215 |
| 14.309079663055556 | 0.489 | 1.275 | 1.204 |
| 14.315914700555556 | 0.504 | 1.283 | 1.212 |
| 14.322749783055555 | 0.496 | 1.28 | 1.192 |
| 14.329523765833335 | 0.512 | 1.275 | 1.189 |
| 14.336267169444444 | 0.481 | 1.283 | 1.204 |
| 14.343132803333333 | 0.481 | 1.275 | 1.217 |
| 14.349923453611112 | 0.499 | 1.262 | 1.194 |
| 14.3567432575 | 0.473 | 1.283 | 1.207 |
| 14.36350195638889 | 0.504 | 1.267 | 1.212 |
| 14.37024539138889 | 0.494 | 1.26 | 1.227 |
| 14.377202671111112 | 0.486 | 1.275 | 1.217 |
| 14.383869715555557 | 0.499 | 1.267 | 1.222 |
| 14.390689524999999 | 0.519 | 1.265 | 1.21 |
| 14.39752460611111 | 0.497 | 1.262 | 1.202 |
| 14.404298595833305 | 0.494 | 1.285 | 1.194 |
| 14.411103120555556 | 0.502 | 1.269 | 1.186 |
| 14.4178937475 | 0.443 | 1.258 | 1.173 |
| 14.424667720555556 | 0.452 | 1.225 | 1.201 |
| 14.431441719722194 | 0.434 | 1.2 | 1.15 |
| 14.438261506944444 | 0.441 | 1.224 | 1.157 |
| 14.4450965875 | 0.424 | 1.219 | 1.137 |
| 14.451870578333335 | 0.465 | 1.212 | 1.134 |
| 14.458659817500001 | 0.447 | 1.218 | 1.142 |
| 14.465510167500002 | 0.449 | 1.207 | 1.137 |
| 14.472253607222223 | 0.459 | 1.225 | 1.152 |
| 14.479088686388861 | 0.442 | 1.218 | 1.145 |
| 14.485833502777778 | 0.439 | 1.212 | 1.142 |
| 14.492653300555556 | 0.454 | 1.233 | 1.152 |
| 14.499457835555555 | 0.452 | 1.215 | 1.15 |
| 14.506231815 | 0.442 | 1.212 | 1.15 |
| 14.513082164444445 | 0.439 | 1.21 | 1.155 |
| 14.519871410555556 | 0.454 | 1.23 | 1.15 |
| 14.526675949722222 | 0.447 | 1.202 | 1.152 |
| 14.533449921666666 | 0.449 | 1.195 | 1.162 |
| 14.540223909444444 | 0.431 | 1.225 | 1.142 |
| 14.547028432222222 | 0.454 | 1.23 | 1.152 |
| 14.553909360277778 | 0.459 | 1.21 | 1.16 |
| 14.560623600555555 | 0.442 | 1.225 | 1.155 |
| 14.567428133611111 | 0.472 | 1.225 | 1.17 |
| 14.574202117222223 | 0.444 | 1.212 | 1.17 |
| 14.581006641944445 | 0.442 | 1.2 | 1.173 |
| 14.587826453888889 | 0.436 | 1.202 | 1.15 |
| 14.594600425833333 | 0.439 | 1.228 | 1.155 |
| 14.601450780555556 | 0.447 | 1.241 | 1.157 |
| 14.608255306111111 | 0.449 | 1.235 | 1.16 |
| 14.615014009722222 | 0.454 | 1.212 | 1.175 |
| 14.621819931388888 | 0.454 | 1.225 | 1.152 |
| 14.628593901944445 | 0.452 | 1.22 | 1.162 |
| 14.635398434444445 | 0.434 | 1.215 | 1.157 |
| 14.64217242111111 | 0.454 | 1.228 | 1.162 |
| 14.649038034722222 | 0.465 | 1.238 | 1.155 |
| 14.65578146388889 | 0.444 | 1.218 | 1.16 |
| 14.662647100833333 | 0.454 | 1.235 | 1.16 |
| 14.669390545277777 | 0.45 | 1.22 | 1.167 |
| 14.676164589722221 | 0.449 | 1.23 | 1.17 |
| 14.68299958138889 | 0.406 | 1.195 | 1.121 |
| 14.689729124999973 | 0.426 | 1.191 | 1.126 |
| 14.696579484722221 | 0.374 | 1.163 | 1.097 |
| 14.703368733333333 | 0.389 | 1.165 | 1.103 |
| 14.710142708888888 | 0.382 | 1.153 | 1.12 |
| 14.716962515277778 | 0.389 | 1.178 | 1.103 |
| 14.72379759638889 | 0.384 | 1.16 | 1.115 |
| 14.730571591111111 | 0.415 | 1.158 | 1.113 |
| 14.737345548333305 | 0.397 | 1.165 | 1.097 |
| 14.744119523333334 | 0.387 | 1.176 | 1.087 |
| 14.75093933888889 | 0.4 | 1.171 | 1.092 |
| 14.757745269166666 | 0.412 | 1.178 | 1.085 |
| 14.764519227499973 | 0.384 | 1.183 | 1.095 |
| 14.77136959638889 | 0.387 | 1.176 | 1.113 |
| 14.778174111666639 | 0.387 | 1.186 | 1.105 |
| 14.784948094444443 | 0.392 | 1.168 | 1.118 |
| 14.791722077222223 | 0.379 | 1.165 | 1.108 |
| 14.798480783333334 | 0.382 | 1.16 | 1.092 |
| 14.805300573333334 | 0.379 | 1.183 | 1.108 |
| 14.812120374722223 | 0.387 | 1.165 | 1.095 |
| 14.818909628333333 | 0.402 | 1.183 | 1.12 |
| 14.825760000277777 | 0.405 | 1.183 | 1.115 |
| 14.832504802777779 | 0.392 | 1.183 | 1.115 |
| 14.839294053055557 | 0.387 | 1.186 | 1.103 |
| 14.846098591944445 | 0.402 | 1.186 | 1.095 |
| 14.852872594722221 | 0.397 | 1.178 | 1.108 |
| 14.859677085833333 | 0.384 | 1.188 | 1.115 |
| 14.866527541111111 | 0.407 | 1.183 | 1.1 |
| 14.873301426388888 | 0.384 | 1.168 | 1.113 |
| 14.88010595388889 | 0.395 | 1.165 | 1.097 |
| 14.886895208055556 | 0.364 | 1.191 | 1.1 |
| 14.893670577222222 | 0.389 | 1.163 | 1.115 |
| 14.900582037777777 | 0.41 | 1.176 | 1.11 |
| 14.907279635555556 | 0.393 | 1.168 | 1.09 |
| 14.914053613888887 | 0.405 | 1.178 | 1.113 |
| 14.920873416944444 | 0.376 | 1.166 | 1.092 |
| 14.927677945833333 | 0.367 | 1.151 | 1.094 |
| 14.934451923333333 | 0.331 | 1.121 | 1.051 |
| 14.941287009444444 | 0.323 | 1.106 | 1.058 |
| 14.948060985000001 | 0.324 | 1.121 | 1.056 |
| 14.954896061944446 | 0.325 | 1.103 | 1.04 |
| 14.96168532361111 | 0.338 | 1.123 | 1.048 |
| 14.968430133055556 | 0.347 | 1.121 | 1.058 |
| 14.975234654722222 | 0.336 | 1.108 | 1.05 |
| 14.98200863138889 | 0.347 | 1.113 | 1.055 |
| 14.98888954 | 0.333 | 1.126 | 1.076 |
| 14.995739894444444 | 0.36 | 1.116 | 1.061 |
| 15.002483317222222 | 0.332 | 1.108 | 1.066 |
| 15.009242027777779 | 0.342 | 1.113 | 1.061 |
| 15.016031278055555 | 0.34 | 1.108 | 1.048 |
| 15.022835810555554 | 0.34 | 1.118 | 1.058 |
| 15.029641732777778 | 0.345 | 1.118 | 1.066 |
| 15.036415706388889 | 0.324 | 1.116 | 1.043 |
| 15.043266053611111 | 0.335 | 1.126 | 1.058 |
| 15.050040040833332 | 0.34 | 1.126 | 1.066 |
| 15.056798738888862 | 0.35 | 1.116 | 1.061 |
| 15.063633820555555 | 0.34 | 1.126 | 1.058 |
| 15.07043835361111 | 0.345 | 1.116 | 1.053 |
| 15.077227610000001 | 0.345 | 1.103 | 1.071 |
| 15.084016870555555 | 0.345 | 1.108 | 1.055 |
| 15.090806115 | 0.345 | 1.139 | 1.05 |
| 15.0976411925 | 0.355 | 1.123 | 1.058 |
| 15.104447102499972 | 0.347 | 1.121 | 1.055 |
| 15.111175260833333 | 0.342 | 1.129 | 1.055 |
| 15.118025611944445 | 0.342 | 1.134 | 1.055 |
| 15.124814874722222 | 0.365 | 1.136 | 1.055 |
| 15.131588855555554 | 0.337 | 1.139 | 1.068 |
| 15.138423925277749 | 0.337 | 1.146 | 1.063 |
| 15.145243729166666 | 0.34 | 1.131 | 1.071 |
| 15.152017716944416 | 0.345 | 1.131 | 1.058 |
| 15.158776405 | 0.342 | 1.131 | 1.073 |
| 15.165582322777777 | 0.345 | 1.139 | 1.053 |
| 15.172356305555555 | 0.347 | 1.131 | 1.086 |
| 15.179191390555555 | 0.35 | 1.131 | 1.081 |
| 15.185965359166667 | 0.358 | 1.134 | 1.05 |
| 15.192800436111112 | 0.35 | 1.121 | 1.063 |
| 15.19957441861111 | 0.36 | 1.113 | 1.053 |
| 15.206378961666639 | 0.358 | 1.122 | 1.071 |
| 15.2131834775 | 0.355 | 1.144 | 1.063 |
| 15.219957450555555 | 0.37 | 1.135 | 1.071 |
| 15.226807806111111 | 0.338 | 1.112 | 1.027 |
| 15.233566608611111 | 0.314 | 1.091 | 1.024 |
| 15.240372431388888 | 0.302 | 1.081 | 1.011 |
| 15.247146472499999 | 0.305 | 1.096 | 1.016 |
| 15.253920388333306 | 0.3 | 1.059 | 1.013 |
| 15.260724919166666 | 0.28 | 1.069 | 1.003 |
| 15.267560009166665 | 0.29 | 1.066 | 1.016 |
| 15.27433398638886 | 0.293 | 1.074 | 1.016 |
| 15.281169055555555 | 0.293 | 1.066 | 0.998 |
| 15.287912493611111 | 0.3 | 1.059 | 1.016 |
| 15.294747565833333 | 0.28 | 1.076 | 1.001 |
| 15.301522936944444 | 0.277 | 1.087 | 1.011 |
| 15.308296900555556 | 0.285 | 1.069 | 1.001 |
| 15.31513198 | 0.293 | 1.074 | 1.019 |
| 15.321967064999999 | 0.303 | 1.084 | 0.993 |
| 15.328725768333305 | 0.288 | 1.076 | 1.011 |
| 15.335484465555556 | 0.293 | 1.066 | 1.013 |
| 15.342334824444444 | 0.285 | 1.071 | 1.006 |
| 15.34912408111111 | 0.293 | 1.076 | 1.003 |
| 15.355913333333334 | 0.308 | 1.074 | 0.996 |
| 15.362687314444445 | 0.29 | 1.071 | 1.013 |
| 15.369537661944445 | 0.298 | 1.069 | 1.003 |
| 15.376343584722221 | 0.298 | 1.076 | 1.021 |
| 15.383056465555557 | 0.3 | 1.066 | 1.006 |
| 15.389860980555556 | 0.288 | 1.066 | 1.016 |
| 15.396696066666665 | 0.298 | 1.076 | 1.008 |
| 15.403500587777778 | 0.295 | 1.079 | 1.021 |
| 15.410274571111112 | 0.298 | 1.074 | 1.011 |
| 15.417048574999999 | 0.285 | 1.071 | 0.99 |
| 15.4238683625 | 0.3 | 1.079 | 1.011 |
| 15.43067288111111 | 0.288 | 1.076 | 1.011 |
| 15.43746214111111 | 0.298 | 1.069 | 1.008 |
| 15.444222232222224 | 0.303 | 1.092 | 1.013 |
| 15.451103135 | 0.295 | 1.069 | 1.003 |
| 15.45780073416664 | 0.303 | 1.104 | 1.021 |
| 15.46468164388889 | 0.298 | 1.102 | 0.996 |
| 15.471455615555556 | 0.293 | 1.066 | 1.008 |
| 15.478229607777777 | 0.306 | 1.076 | 1.019 |
| 15.485049408888889 | 0.276 | 1.066 | 1.013 |
| 15.491823386944445 | 0.277 | 1.058 | 0.982 |
| 15.498627906111084 | 0.259 | 1.043 | 0.977 |
| 15.505403278055557 | 0.249 | 1.019 | 0.974 |
| 15.5122536325 | 0.235 | 1.011 | 0.951 |
| 15.519058175555555 | 0.259 | 1.024 | 0.979 |
| 15.5258168675 | 0.246 | 1.009 | 0.956 |
| 15.532606133055557 | 0.238 | 1.004 | 0.938 |
| 15.5394106475 | 0.243 | 1.014 | 0.992 |
| 15.546245739444446 | 0.241 | 1.014 | 0.954 |
| 15.553019701944445 | 0.23 | 1.014 | 0.954 |
| 15.559854781944445 | 0.233 | 1.017 | 0.936 |
| 15.566628765 | 0.235 | 1.011 | 0.959 |
| 15.573433310555556 | 0.248 | 1.042 | 0.951 |
| 15.580254476111111 | 0.269 | 1.019 | 0.971 |
| 15.586982636944445 | 0.258 | 1.024 | 0.969 |
| 15.593817718333334 | 0.235 | 1.029 | 0.943 |
| 15.600622239722222 | 0.23 | 1.029 | 0.966 |
| 15.607380941944443 | 0.241 | 1.017 | 0.974 |
| 15.614216034166667 | 0.246 | 1.019 | 0.961 |
| 15.620989995555556 | 0.246 | 1.004 | 0.964 |
| 15.62784035888889 | 0.248 | 1.006 | 0.961 |
| 15.634614342222223 | 0.251 | 1.027 | 0.961 |
| 15.641403586944444 | 0.243 | 1.029 | 0.964 |
| 15.648194243055556 | 0.241 | 1.029 | 0.971 |
| 15.654983483888888 | 0.248 | 1.011 | 0.954 |
| 15.661818565555528 | 0.228 | 1.022 | 0.961 |
| 15.668561985833334 | 0.238 | 1.042 | 0.974 |
| 15.675397073333334 | 0.23 | 1.042 | 0.974 |
| 15.682171049444444 | 0.251 | 1.045 | 0.948 |
| 15.689006129722221 | 0.266 | 1.029 | 0.979 |
| 15.695810656388888 | 0.266 | 1.022 | 0.971 |
| 15.702554091944446 | 0.243 | 1.04 | 0.971 |
| 15.709358604722222 | 0.264 | 1.019 | 0.954 |
| 15.716133983333334 | 0.243 | 1.017 | 0.974 |
| 15.722969059722223 | 0.228 | 1.016 | 0.961 |
| 15.729743042222223 | 0.243 | 0.985 | 0.93 |
| 15.736532295277778 | 0.204 | 0.983 | 0.922 |
| 15.74335209388889 | 0.199 | 0.967 | 0.94 |
| 15.750126078333306 | 0.176 | 0.962 | 0.914 |
| 15.756976425 | 0.181 | 0.98 | 0.896 |
| 15.763750406111111 | 0.191 | 0.972 | 0.901 |
| 15.770600762222195 | 0.191 | 0.952 | 0.914 |
| 15.77732891527775 | 0.181 | 0.982 | 0.899 |
| 15.784119554722222 | 0.194 | 0.975 | 0.901 |
| 15.790893531944445 | 0.194 | 0.959 | 0.909 |
| 15.797698058055555 | 0.188 | 0.987 | 0.935 |
| 15.804533250833334 | 0.186 | 0.998 | 0.889 |
| 15.811307119999999 | 0.188 | 0.977 | 0.907 |
| 15.818126929166667 | 0.191 | 0.975 | 0.914 |
| 15.824946734444444 | 0.191 | 0.972 | 0.917 |
| 15.831720710833334 | 0.201 | 0.982 | 0.907 |
| 15.838494685277777 | 0.209 | 0.962 | 0.919 |
| 15.845329769444444 | 0.201 | 0.982 | 0.909 |
| 15.852120415555556 | 0.188 | 0.962 | 0.914 |
| 15.858924939444446 | 0.204 | 0.97 | 0.914 |
| 15.865714191388887 | 0.196 | 0.972 | 0.914 |
| 15.872488163055555 | 0.211 | 0.982 | 0.912 |
| 15.879338518055556 | 0.191 | 0.982 | 0.919 |
| 15.886112494444443 | 0.199 | 0.993 | 0.907 |
| 15.892855939722194 | 0.201 | 0.967 | 0.912 |
| 15.89967573111111 | 0.196 | 0.982 | 0.919 |
| 15.906449714166667 | 0.196 | 0.977 | 0.894 |
| 15.913269508055528 | 0.186 | 0.993 | 0.901 |
| 15.9200601525 | 0.216 | 0.97 | 0.907 |
| 15.926864699722222 | 0.209 | 0.977 | 0.909 |
| 15.933638657222222 | 0.199 | 0.967 | 0.922 |
| 15.940443185555555 | 0.191 | 0.975 | 0.912 |
| 15.947263000000001 | 0.201 | 0.975 | 0.927 |
| 15.95403698027778 | 0.196 | 0.98 | 0.932 |
| 15.960856788333333 | 0.201 | 0.985 | 0.937 |
| 15.967676588055555 | 0.201 | 0.975 | 0.927 |
| 15.97446584138889 | 0.191 | 0.982 | 0.935 |
| 15.981300913611111 | 0.188 | 0.975 | 0.924 |
| 15.98807628027778 | 0.164 | 0.947 | 0.911 |
| 15.99485026722222 | 0.171 | 0.949 | 0.903 |
| 16.00163951861111 | 0.149 | 0.925 | 0.885 |
| 16.008459322500002 | 0.179 | 0.964 | 0.883 |
| 16.015233308333332 | 0.163 | 0.942 | 0.87 |
| 16.022007307777777 | 0.139 | 0.922 | 0.867 |
| 16.0288270825 | 0.121 | 0.925 | 0.877 |
| 16.03564689111111 | 0.141 | 0.938 | 0.864 |
| 16.04242086361111 | 0.149 | 0.922 | 0.851 |
| 16.049210134722223 | 0.134 | 0.925 | 0.875 |
| 16.056031311666665 | 0.126 | 0.933 | 0.844 |
| 16.062835841944445 | 0.146 | 0.917 | 0.869 |
| 16.06959453777778 | 0.146 | 0.909 | 0.851 |
| 16.07641434861111 | 0.121 | 0.917 | 0.859 |
| 16.083188328333332 | 0.144 | 0.925 | 0.867 |
| 16.089947026111112 | 0.144 | 0.935 | 0.867 |
| 16.096827931666667 | 0.134 | 0.928 | 0.867 |
| 16.10364772777778 | 0.146 | 0.938 | 0.862 |
| 16.110421713333334 | 0.146 | 0.902 | 0.859 |
| 16.117195707222223 | 0.144 | 0.943 | 0.864 |
| 16.124032158888888 | 0.134 | 0.935 | 0.88 |
| 16.130806136666667 | 0.149 | 0.904 | 0.875 |
| 16.137595384444445 | 0.146 | 0.935 | 0.867 |
| 16.14439992666664 | 0.141 | 0.92 | 0.875 |
| 16.151173916111112 | 0.144 | 0.935 | 0.864 |
| 16.158008985555558 | 0.144 | 0.93 | 0.869 |
| 16.164813511944445 | 0.157 | 0.928 | 0.872 |
| 16.171602757777748 | 0.134 | 0.93 | 0.851 |
| 16.178422565 | 0.152 | 0.945 | 0.88 |
| 16.185150714722223 | 0.131 | 0.907 | 0.875 |
| 16.191956630833307 | 0.164 | 0.943 | 0.869 |
| 16.198745890277777 | 0.162 | 0.928 | 0.859 |
| 16.20555041638886 | 0.149 | 0.92 | 0.862 |
| 16.21233967527778 | 0.154 | 0.935 | 0.867 |
| 16.219144203333332 | 0.149 | 0.925 | 0.872 |
| 16.225918175833307 | 0.152 | 0.933 | 0.859 |
| 16.232768528333335 | 0.139 | 0.928 | 0.875 |
| 16.239573055555557 | 0.134 | 0.925 | 0.867 |
| 16.2463470475 | 0.149 | 0.945 | 0.875 |
| 16.253121041388887 | 0.149 | 0.94 | 0.872 |
| 16.25991165527775 | 0.154 | 0.933 | 0.867 |
| 16.266762015277777 | 0.139 | 0.935 | 0.88 |
| 16.273566548888887 | 0.162 | 0.943 | 0.877 |
| 16.28034052083333 | 0.149 | 0.935 | 0.859 |
| 16.28711450388889 | 0.137 | 0.938 | 0.862 |
| 16.293888474166664 | 0.145 | 0.907 | 0.864 |
| 16.300754107499998 | 0.123 | 0.916 | 0.843 |
| 16.30751280861111 | 0.111 | 0.892 | 0.83 |
| 16.314286790833332 | 0.141 | 0.907 | 0.856 |
| 16.321121873888888 | 0.079 | 0.863 | 0.835 |
| 16.327897256944443 | 0.101 | 0.896 | 0.814 |
| 16.334671212499998 | 0.096 | 0.868 | 0.801 |
| 16.341475743611085 | 0.074 | 0.859 | 0.809 |
| 16.34831083111111 | 0.074 | 0.871 | 0.788 |
| 16.355100071944445 | 0.102 | 0.859 | 0.817 |
| 16.36191989138889 | 0.084 | 0.866 | 0.801 |
| 16.368709133611112 | 0.107 | 0.875 | 0.806 |
| 16.375483110833333 | 0.084 | 0.864 | 0.812 |
| 16.382318196944443 | 0.076 | 0.87 | 0.793 |
| 16.389046346388888 | 0.094 | 0.862 | 0.799 |
| 16.39586752388889 | 0.066 | 0.854 | 0.806 |
| 16.402656810555555 | 0.087 | 0.864 | 0.804 |
| 16.409461318055556 | 0.076 | 0.877 | 0.799 |
| 16.416250573611112 | 0.079 | 0.88 | 0.809 |
| 16.4230856525 | 0.079 | 0.867 | 0.793 |
| 16.429905450833335 | 0.084 | 0.867 | 0.804 |
| 16.43664888388889 | 0.089 | 0.87 | 0.804 |
| 16.443453402499998 | 0.097 | 0.852 | 0.796 |
| 16.450288501666666 | 0.087 | 0.844 | 0.793 |
| 16.457077793055557 | 0.082 | 0.864 | 0.793 |
| 16.46380733861111 | 0.087 | 0.846 | 0.799 |
| 16.470611808055555 | 0.092 | 0.875 | 0.814 |
| 16.477385784166668 | 0.092 | 0.859 | 0.817 |
| 16.484190345833333 | 0.084 | 0.885 | 0.791 |
| 16.491040670555527 | 0.084 | 0.849 | 0.824 |
| 16.497891025833304 | 0.087 | 0.872 | 0.809 |
| 16.504649725833332 | 0.082 | 0.872 | 0.809 |
| 16.5114389875 | 0.105 | 0.852 | 0.801 |
| 16.518228230833333 | 0.084 | 0.872 | 0.793 |
| 16.525048042222224 | 0.082 | 0.857 | 0.817 |
| 16.531823411666668 | 0.087 | 0.849 | 0.793 |
| 16.53865848611111 | 0.099 | 0.854 | 0.801 |
| 16.545432476944416 | 0.084 | 0.875 | 0.801 |
| 16.55222172361111 | 0.082 | 0.857 | 0.783 |
| 16.559010969166664 | 0.087 | 0.877 | 0.778 |
| 16.565830774444446 | 0.084 | 0.862 | 0.799 |
| 16.572589485833333 | 0.099 | 0.859 | 0.812 |
| 16.57940929861111 | 0.092 | 0.852 | 0.793 |
| 16.586183268333333 | 0.076 | 0.844 | 0.796 |
| 16.593018345833332 | 0.084 | 0.857 | 0.799 |
| 16.599868694166638 | 0.069 | 0.872 | 0.801 |
| 16.606582956944443 | 0.087 | 0.862 | 0.796 |
| 16.613356938611112 | 0.092 | 0.87 | 0.801 |
| 16.620130924166666 | 0.092 | 0.854 | 0.783 |
| 16.62696601888889 | 0.094 | 0.88 | 0.804 |
| 16.633770523888888 | 0.099 | 0.867 | 0.804 |
| 16.640544594722222 | 0.071 | 0.852 | 0.809 |
| 16.647425412222223 | 0.094 | 0.88 | 0.793 |
| 16.654184114444444 | 0.069 | 0.859 | 0.783 |
| 16.661003922777777 | 0.076 | 0.862 | 0.793 |
| 16.667764004722223 | 0.071 | 0.854 | 0.791 |
| 16.6745990875 | 0.087 | 0.859 | 0.799 |
| 16.68132724166667 | 0.092 | 0.852 | 0.799 |
| 16.6881470475 | 0.082 | 0.864 | 0.796 |
| 16.69498212972222 | 0.089 | 0.877 | 0.786 |
| 16.701771376944446 | 0.071 | 0.859 | 0.793 |
| 16.70854538777778 | 0.084 | 0.859 | 0.814 |
| 16.715334619166665 | 0.089 | 0.862 | 0.783 |
| 16.722108593055555 | 0.079 | 0.864 | 0.775 |
| 16.72891312249997 | 0.087 | 0.893 | 0.804 |
| 16.735749603611083 | 0.068 | 0.837 | 0.775 |
| 16.742569399444445 | 0.076 | 0.87 | 0.791 |
| 16.74934336833333 | 0.042 | 0.828 | 0.772 |
| 16.756163188333332 | -0.003 | 0.801 | 0.746 |
| 16.762967725833334 | 0.041 | 0.824 | 0.785 |
| 16.769726407222223 | -0.021 | 0.784 | 0.736 |
| 16.776561475277777 | 0.007 | 0.816 | 0.733 |
| 16.7833049125 | 0.023 | 0.787 | 0.736 |
| 16.790139992222223 | -0.01 | 0.786 | 0.733 |
| 16.79700561611111 | 0.019 | 0.791 | 0.743 |
| 16.803704611944447 | 0.005 | 0.801 | 0.743 |
| 16.81049386638889 | 0.019 | 0.789 | 0.725 |
| 16.817298394444443 | 0.009 | 0.804 | 0.718 |
| 16.824072377500002 | 0.011 | 0.786 | 0.723 |
| 16.830938032499972 | 0.024 | 0.799 | 0.728 |
| 16.83771198138889 | 0.014 | 0.794 | 0.723 |
| 16.844485967222223 | 0.004 | 0.786 | 0.733 |
| 16.85130576027778 | 0.019 | 0.796 | 0.733 |
| 16.858110293333333 | 0.009 | 0.801 | 0.723 |
| 16.864884268333334 | 0.009 | 0.794 | 0.725 |
| 16.871659631944443 | 0.009 | 0.781 | 0.725 |
| 16.878494716666665 | 0.019 | 0.794 | 0.743 |
| 16.88529926 | 0.006 | 0.781 | 0.738 |
| 16.892057946666664 | 0.014 | 0.799 | 0.736 |
| 16.898862497222222 | 0.019 | 0.801 | 0.718 |
| 16.905682291944444 | 0.006 | 0.786 | 0.73 |
| 16.912456255277778 | 0.032 | 0.786 | 0.72 |
| 16.91929137888889 | 0.04 | 0.781 | 0.741 |
| 16.926080597777776 | 0.019 | 0.799 | 0.73 |
| 16.932869836944445 | 0.011 | 0.801 | 0.712 |
| 16.939689736666665 | 0.024 | 0.786 | 0.725 |
| 16.94646501638889 | -0.009 | 0.809 | 0.723 |
| 16.95326954611111 | 0.016 | 0.799 | 0.72 |
| 16.96001297111111 | 0.019 | 0.783 | 0.723 |
| 16.9668327725 | 0.016 | 0.789 | 0.736 |
| 16.97363729972222 | 0.009 | 0.799 | 0.723 |
| 16.980380727222222 | 0.016 | 0.796 | 0.728 |
| 16.987261638333305 | 0.009 | 0.796 | 0.736 |
| 16.994066165 | 0.011 | 0.791 | 0.733 |
| 17.0008248675 | 0.001 | 0.783 | 0.725 |
| 17.00763079888889 | 0.011 | 0.801 | 0.705 |
| 17.01442004222222 | 0.006 | 0.799 | 0.723 |
| 17.021224572222224 | 0.029 | 0.789 | 0.707 |
| 17.02805965777775 | 0.006 | 0.783 | 0.712 |
| 17.03484890305553 | 0.014 | 0.783 | 0.71 |
| 17.04162288 | -0.002 | 0.778 | 0.723 |
| 17.048381584444446 | 0.004 | 0.781 | 0.702 |
| 17.055231944444444 | 0.004 | 0.783 | 0.728 |
| 17.062005915555556 | 0.001 | 0.786 | 0.73 |
| 17.06879517361111 | -0.009 | 0.796 | 0.707 |
| 17.07564553472222 | 0.014 | 0.796 | 0.707 |
| 17.082436168333306 | -0.002 | 0.781 | 0.733 |
| 17.089194872777778 | 0.014 | 0.789 | 0.705 |
| 17.095968845277778 | 0.006 | 0.783 | 0.728 |
| 17.10278864972222 | 0.024 | 0.789 | 0.715 |
| 17.109562645833332 | -0.004 | 0.778 | 0.712 |
| 17.116367154722223 | 0.001 | 0.776 | 0.725 |
| 17.123202235 | 0.022 | 0.786 | 0.712 |
| 17.129915124722224 | -0.019 | 0.795 | 0.728 |
| 17.13681129861111 | -0.05 | 0.738 | 0.678 |
| 17.143556112777777 | -0.017 | 0.759 | 0.697 |
| 17.150360633055556 | -0.038 | 0.749 | 0.694 |
| 17.1571346225 | -0.047 | 0.751 | 0.675 |
| 17.16398497138889 | -0.062 | 0.733 | 0.678 |
| 17.17080479138886 | -0.06 | 0.705 | 0.657 |
| 17.177578769166665 | -0.047 | 0.749 | 0.647 |
| 17.18438328222222 | -0.057 | 0.72 | 0.636 |
| 17.191187814166668 | -0.057 | 0.723 | 0.647 |
| 17.19794652138889 | -0.065 | 0.702 | 0.657 |
| 17.20481214333333 | -0.054 | 0.71 | 0.662 |
| 17.211526414722222 | -0.067 | 0.715 | 0.657 |
| 17.21833094055553 | -0.042 | 0.723 | 0.657 |
| 17.225104913611112 | -0.062 | 0.713 | 0.642 |
| 17.2319247275 | -0.047 | 0.731 | 0.647 |
| 17.238713980277776 | -0.054 | 0.733 | 0.657 |
| 17.245549054722222 | -0.057 | 0.723 | 0.654 |
| 17.25233833277778 | -0.067 | 0.713 | 0.662 |
| 17.25915810638886 | -0.054 | 0.725 | 0.662 |
| 17.265916812222223 | -0.072 | 0.741 | 0.649 |
| 17.27270607138886 | -0.067 | 0.733 | 0.654 |
| 17.279481453055556 | -0.062 | 0.72 | 0.644 |
| 17.28631651027778 | -0.044 | 0.723 | 0.665 |
| 17.293151591388888 | -0.042 | 0.707 | 0.673 |
| 17.29991030361111 | -0.065 | 0.733 | 0.667 |
| 17.306684280555555 | -0.049 | 0.718 | 0.647 |
| 17.313519371666665 | -0.072 | 0.713 | 0.654 |
| 17.320293337222193 | -0.06 | 0.725 | 0.649 |
| 17.327097866944445 | -0.08 | 0.718 | 0.654 |
| 17.333917666666668 | -0.049 | 0.723 | 0.644 |
| 17.340691638888888 | -0.075 | 0.713 | 0.657 |
| 17.34752672861111 | -0.06 | 0.723 | 0.652 |
| 17.354302086666667 | -0.054 | 0.723 | 0.657 |
| 17.361106615 | -0.067 | 0.713 | 0.654 |
| 17.367880598333333 | -0.06 | 0.723 | 0.66 |
| 17.374669850277776 | -0.083 | 0.702 | 0.644 |
| 17.381520206944444 | -0.062 | 0.707 | 0.649 |
| 17.38830955 | -0.057 | 0.725 | 0.662 |
| 17.39511400888889 | -0.057 | 0.7 | 0.642 |
| 17.401857416666665 | -0.07 | 0.72 | 0.652 |
| 17.408692495277776 | -0.047 | 0.728 | 0.647 |
| 17.415481748055527 | -0.049 | 0.71 | 0.642 |
| 17.422272388055553 | -0.047 | 0.72 | 0.649 |
| 17.42904638888889 | -0.078 | 0.723 | 0.665 |
| 17.43585089138889 | -0.062 | 0.728 | 0.66 |
| 17.442640155555527 | -0.047 | 0.71 | 0.639 |
| 17.44944467611111 | -0.057 | 0.715 | 0.634 |
| 17.456218657222223 | -0.06 | 0.713 | 0.634 |
| 17.46309956888889 | -0.054 | 0.713 | 0.647 |
| 17.469827721111084 | -0.054 | 0.692 | 0.647 |
| 17.476617004166666 | -0.078 | 0.71 | 0.649 |
| 17.483422885555555 | -0.07 | 0.707 | 0.66 |
| 17.49019687138886 | -0.066 | 0.719 | 0.642 |
| 17.497062496944444 | -0.053 | 0.722 | 0.652 |
| 17.503836471666666 | -0.08 | 0.715 | 0.639 |
| 17.510625734722222 | -0.052 | 0.715 | 0.649 |
| 17.517414996944446 | -0.046 | 0.72 | 0.657 |
| 17.524188956388887 | -0.035 | 0.732 | 0.642 |
| 17.531054591944443 | -0.037 | 0.722 | 0.657 |
| 17.537828564999998 | -0.049 | 0.696 | 0.667 |
| 17.544602551944415 | -0.063 | 0.714 | 0.641 |
| 17.551391799999998 | -0.044 | 0.724 | 0.631 |
| 17.55816716138889 | -0.061 | 0.698 | 0.634 |
| 17.56494114611111 | -0.096 | 0.682 | 0.613 |
| 17.57186788222222 | -0.062 | 0.7 | 0.634 |
| 17.5785808525 | -0.085 | 0.681 | 0.615 |
| 17.585385288333335 | -0.084 | 0.676 | 0.608 |
| 17.592205083611113 | -0.118 | 0.667 | 0.605 |
| 17.59902489888889 | -0.112 | 0.639 | 0.576 |
| 17.605768334166665 | -0.124 | 0.636 | 0.599 |
| 17.612603390833332 | -0.112 | 0.645 | 0.586 |
| 17.619392648055555 | -0.108 | 0.651 | 0.597 |
| 17.62616802527775 | -0.121 | 0.667 | 0.605 |
| 17.633018368333307 | -0.143 | 0.644 | 0.576 |
| 17.63979235 | -0.128 | 0.637 | 0.589 |
| 17.646551049166668 | -0.135 | 0.632 | 0.576 |
| 17.653355577777777 | -0.133 | 0.632 | 0.584 |
| 17.660144835833304 | -0.133 | 0.644 | 0.571 |
| 17.666979925555527 | -0.141 | 0.629 | 0.563 |
| 17.6737844475 | -0.13 | 0.647 | 0.584 |
| 17.680588969166667 | -0.146 | 0.637 | 0.573 |
| 17.687347679444418 | -0.156 | 0.642 | 0.581 |
| 17.694107768333335 | -0.156 | 0.639 | 0.555 |
| 17.700942846944443 | -0.143 | 0.629 | 0.571 |
| 17.70774737083333 | -0.143 | 0.644 | 0.558 |
| 17.71452136083333 | -0.156 | 0.632 | 0.579 |
| 17.721325887499972 | -0.138 | 0.657 | 0.563 |
| 17.728160963333334 | -0.135 | 0.637 | 0.581 |
| 17.73496550361111 | -0.138 | 0.624 | 0.561 |
| 17.74173947 | -0.148 | 0.629 | 0.555 |
| 17.74851345611111 | -0.154 | 0.611 | 0.566 |
| 17.75528880638889 | -0.154 | 0.642 | 0.563 |
| 17.76213916361111 | -0.164 | 0.637 | 0.591 |
| 17.76891315416667 | -0.148 | 0.629 | 0.561 |
| 17.77574822111111 | -0.156 | 0.621 | 0.555 |
| 17.782522206666666 | -0.151 | 0.637 | 0.555 |
| 17.78932675638886 | -0.159 | 0.616 | 0.573 |
| 17.796100710277777 | -0.159 | 0.619 | 0.548 |
| 17.802874686111082 | -0.159 | 0.621 | 0.548 |
| 17.809679215 | -0.161 | 0.616 | 0.573 |
| 17.81645320333333 | -0.154 | 0.626 | 0.545 |
| 17.82328828083333 | -0.146 | 0.624 | 0.573 |
| 17.830078918055555 | -0.182 | 0.613 | 0.548 |
| 17.836868185833332 | -0.151 | 0.626 | 0.579 |
| 17.84370324972222 | -0.172 | 0.624 | 0.548 |
| 17.85047723388889 | -0.174 | 0.606 | 0.54 |
| 17.85726658333333 | -0.177 | 0.616 | 0.555 |
| 17.86408628222222 | -0.179 | 0.632 | 0.55 |
| 17.87086026472222 | -0.169 | 0.624 | 0.558 |
| 17.87766479472222 | -0.174 | 0.616 | 0.555 |
| 17.884469330555557 | -0.164 | 0.595 | 0.548 |
| 17.89125858861111 | -0.164 | 0.616 | 0.54 |
| 17.898049234722222 | -0.156 | 0.626 | 0.566 |
| 17.904869023333333 | -0.177 | 0.595 | 0.537 |
| 17.91165828222222 | -0.174 | 0.616 | 0.545 |
| 17.918432250833334 | -0.19 | 0.588 | 0.548 |
| 17.925282621666668 | -0.174 | 0.608 | 0.542 |
| 17.932087167499972 | -0.169 | 0.608 | 0.53 |
| 17.9388611125 | -0.166 | 0.595 | 0.54 |
| 17.945635181666667 | -0.195 | 0.598 | 0.542 |
| 17.952409075277778 | -0.169 | 0.606 | 0.535 |
| 17.9592441575 | -0.182 | 0.595 | 0.519 |
| 17.966019518333304 | -0.164 | 0.603 | 0.532 |
| 17.97286988833333 | -0.179 | 0.593 | 0.522 |
| 17.979674406111112 | -0.19 | 0.585 | 0.537 |
| 17.986448383055556 | -0.195 | 0.598 | 0.514 |
| 17.993268194444415 | -0.185 | 0.598 | 0.532 |
| 17.99999633611111 | -0.182 | 0.601 | 0.532 |
| 18.00680086611111 | -0.177 | 0.595 | 0.53 |
| 18.013635942500002 | -0.19 | 0.598 | 0.542 |
| 18.02039464916667 | -0.187 | 0.582 | 0.519 |
| 18.027260290277777 | -0.215 | 0.582 | 0.532 |
| 18.034035650555555 | -0.19 | 0.595 | 0.517 |
| 18.040840174166668 | -0.195 | 0.588 | 0.517 |
| 18.04761425222222 | -0.195 | 0.585 | 0.524 |
| 18.054388141111083 | -0.19 | 0.598 | 0.53 |
| 18.061192669999972 | -0.21 | 0.588 | 0.514 |
| 18.0680125275 | -0.205 | 0.582 | 0.522 |
| 18.07478644111111 | -0.19 | 0.59 | 0.522 |
| 18.08156042138889 | -0.192 | 0.593 | 0.509 |
| 18.088380223333306 | -0.205 | 0.598 | 0.499 |
| 18.095184750555557 | -0.195 | 0.572 | 0.514 |
| 18.10209621027778 | -0.205 | 0.59 | 0.53 |
| 18.108795200833306 | -0.192 | 0.59 | 0.512 |
| 18.11559974388889 | -0.215 | 0.57 | 0.504 |
| 18.122373705277777 | -0.215 | 0.585 | 0.512 |
| 18.12914767777778 | -0.205 | 0.544 | 0.514 |
| 18.1359981375 | -0.2 | 0.572 | 0.517 |
| 18.14274146777778 | -0.179 | 0.613 | 0.517 |
| 18.149576576944444 | -0.183 | 0.582 | 0.527 |
| 18.156365800555555 | -0.147 | 0.614 | 0.533 |
| 18.16313977749997 | -0.185 | 0.609 | 0.54 |
| 18.169960980555526 | -0.165 | 0.609 | 0.53 |
| 18.176734951944443 | -0.16 | 0.614 | 0.551 |
| 18.18353947361111 | -0.185 | 0.591 | 0.53 |
| 18.190313449999973 | -0.17 | 0.614 | 0.548 |
| 18.19717908861111 | -0.126 | 0.634 | 0.549 |
| 18.203953061944446 | -0.147 | 0.637 | 0.538 |
| 18.210727042499975 | -0.131 | 0.626 | 0.531 |
| 18.217516302499998 | -0.152 | 0.619 | 0.559 |
| 18.224305555 | -0.137 | 0.624 | 0.541 |
| 18.23117118277778 | -0.142 | 0.608 | 0.541 |
| 18.23794655305553 | -0.155 | 0.624 | 0.551 |
| 18.244720544166668 | -0.149 | 0.606 | 0.538 |
| 18.25150977194442 | -0.165 | 0.606 | 0.531 |
| 18.25828374888889 | -0.155 | 0.619 | 0.52 |
| 18.265073005 | -0.139 | 0.624 | 0.525 |
| 18.271877540277778 | -0.165 | 0.608 | 0.528 |
| 18.278697339166666 | -0.157 | 0.616 | 0.549 |
| 18.28551715055553 | -0.175 | 0.606 | 0.538 |
| 18.292291121944444 | -0.165 | 0.616 | 0.528 |
| 18.29912620472222 | -0.17 | 0.603 | 0.528 |
| 18.305932123888887 | -0.165 | 0.603 | 0.52 |
| 18.31272145055553 | -0.155 | 0.611 | 0.505 |
| 18.31949535361111 | -0.175 | 0.598 | 0.528 |
| 18.326284609166667 | -0.173 | 0.601 | 0.528 |
| 18.333073860833306 | -0.183 | 0.619 | 0.51 |
| 18.33989365888889 | -0.165 | 0.601 | 0.513 |
| 18.346667642222222 | -0.174 | 0.593 | 0.518 |
| 18.35348744527775 | -0.161 | 0.608 | 0.515 |
| 18.360261417777778 | -0.193 | 0.589 | 0.489 |
| 18.367096505277775 | -0.196 | 0.591 | 0.505 |
| 18.373902431111112 | -0.206 | 0.58 | 0.507 |
| 18.38073749277775 | -0.212 | 0.591 | 0.505 |
| 18.387511481111083 | -0.188 | 0.575 | 0.51 |
| 18.394239625 | -0.207 | 0.573 | 0.5 |
| 18.401059435833332 | -0.204 | 0.573 | 0.502 |
| 18.40787924027778 | -0.214 | 0.571 | 0.507 |
| 18.414725451111085 | -0.227 | 0.584 | 0.495 |
| 18.42145774277775 | -0.204 | 0.563 | 0.492 |
| 18.428231725555527 | -0.217 | 0.553 | 0.495 |
| 18.43502097444442 | -0.214 | 0.566 | 0.489 |
| 18.441857448333334 | -0.225 | 0.56 | 0.474 |
| 18.448677251388887 | -0.217 | 0.553 | 0.505 |
| 18.45543595527778 | -0.217 | 0.545 | 0.492 |
| 18.46227103111111 | -0.243 | 0.553 | 0.482 |
| 18.469045017499973 | -0.227 | 0.54 | 0.476 |
| 18.47581899277778 | -0.243 | 0.558 | 0.482 |
| 18.48259297722222 | -0.207 | 0.537 | 0.484 |
| 18.489489151944444 | -0.243 | 0.529 | 0.489 |
| 18.496217295833308 | -0.243 | 0.535 | 0.476 |
| 18.503037195833333 | -0.217 | 0.537 | 0.466 |
| 18.509843041666667 | -0.243 | 0.535 | 0.458 |
| 18.516632276944417 | -0.245 | 0.527 | 0.458 |
| 18.52339097833333 | -0.253 | 0.524 | 0.456 |
| 18.530226070833333 | -0.248 | 0.529 | 0.464 |
| 18.537000045833334 | -0.238 | 0.55 | 0.443 |
| 18.543835117222198 | -0.263 | 0.514 | 0.456 |
| 18.550624365555556 | -0.261 | 0.524 | 0.443 |
| 18.557413624444443 | -0.24 | 0.524 | 0.461 |
| 18.564187591944446 | -0.221 | 0.554 | 0.482 |
| 18.5709615775 | -0.244 | 0.539 | 0.459 |
| 18.577798048055556 | -0.2 | 0.579 | 0.49 |
| 18.584602573333306 | -0.212 | 0.564 | 0.49 |
| 18.591391829444447 | -0.172 | 0.567 | 0.501 |
| 18.598226907222223 | -0.148 | 0.584 | 0.522 |
| 18.60503144722222 | -0.208 | 0.556 | 0.498 |
| 18.61179013916664 | -0.191 | 0.581 | 0.493 |
| 18.61859467111111 | -0.179 | 0.584 | 0.501 |
| 18.625368640833305 | -0.2 | 0.584 | 0.491 |
| 18.6321426475 | -0.195 | 0.581 | 0.503 |
| 18.63893187777775 | -0.192 | 0.56 | 0.485 |
| 18.645783621944446 | -0.19 | 0.563 | 0.491 |
| 18.652572874999972 | -0.192 | 0.576 | 0.485 |
| 18.659362125833333 | -0.19 | 0.573 | 0.503 |
| 18.66615138722222 | -0.205 | 0.584 | 0.478 |
| 18.67294064666664 | -0.2 | 0.571 | 0.483 |
| 18.67974515722222 | -0.197 | 0.571 | 0.452 |
| 18.686595521111084 | -0.195 | 0.566 | 0.483 |
| 18.69336950888889 | -0.202 | 0.563 | 0.457 |
| 18.70020457972222 | -0.208 | 0.553 | 0.483 |
| 18.706948001666667 | -0.204 | 0.568 | 0.485 |
| 18.713723375277777 | -0.217 | 0.581 | 0.462 |
| 18.720527896944446 | -0.229 | 0.538 | 0.472 |
| 18.727378249444417 | -0.23 | 0.545 | 0.472 |
| 18.734106419166665 | -0.239 | 0.533 | 0.467 |
| 18.74092621055553 | -0.238 | 0.535 | 0.47 |
| 18.747684912222194 | -0.247 | 0.531 | 0.467 |
| 18.754535271944416 | -0.247 | 0.528 | 0.447 |
| 18.761309246666666 | -0.257 | 0.518 | 0.46 |
| 18.768144331388864 | -0.254 | 0.515 | 0.439 |
| 18.774918340833306 | -0.244 | 0.518 | 0.447 |
| 18.781693677777778 | -0.239 | 0.533 | 0.442 |
| 18.788467645833336 | -0.254 | 0.52 | 0.462 |
| 18.795333285833305 | -0.267 | 0.515 | 0.447 |
| 18.802107267222198 | -0.244 | 0.518 | 0.447 |
| 18.808881231944444 | -0.267 | 0.528 | 0.447 |
| 18.815655208611084 | -0.267 | 0.523 | 0.452 |
| 18.822429192777776 | -0.265 | 0.51 | 0.447 |
| 18.82931009472222 | -0.262 | 0.494 | 0.426 |
| 18.836084074444443 | -0.257 | 0.505 | 0.436 |
| 18.842858056944443 | -0.288 | 0.502 | 0.444 |
| 18.849663985833335 | -0.283 | 0.513 | 0.442 |
| 18.856437951388862 | -0.278 | 0.482 | 0.416 |
| 18.863288320555558 | -0.27 | 0.497 | 0.418 |
| 18.87009282888886 | -0.27 | 0.497 | 0.434 |
| 18.87686681083333 | -0.288 | 0.492 | 0.426 |
| 18.88364079388889 | -0.278 | 0.497 | 0.436 |
| 18.890460631666667 | -0.24 | 0.526 | 0.45 |
| 18.897280399166664 | -0.278 | 0.497 | 0.421 |
| 18.90405438083331 | -0.215 | 0.534 | 0.445 |
| 18.91088946027778 | -0.228 | 0.516 | 0.445 |
| 18.917664819166667 | -0.212 | 0.554 | 0.468 |
| 18.924469345833334 | -0.204 | 0.554 | 0.474 |
| 18.931273878333332 | -0.201 | 0.564 | 0.471 |
| 18.93809368166667 | -0.226 | 0.53 | 0.448 |
| 18.944821841666666 | -0.217 | 0.554 | 0.445 |
| 18.95162637083333 | -0.227 | 0.559 | 0.443 |
| 18.958415624722196 | -0.222 | 0.541 | 0.463 |
| 18.965220164166638 | -0.227 | 0.531 | 0.463 |
| 18.972055285 | -0.217 | 0.551 | 0.453 |
| 18.97882923055553 | -0.219 | 0.544 | 0.443 |
| 18.985635128055556 | -0.23 | 0.536 | 0.437 |
| 18.992439656944445 | -0.209 | 0.525 | 0.448 |
| 18.99921363444442 | -0.243 | 0.533 | 0.453 |
| 19.006018163888886 | -0.241 | 0.52 | 0.425 |
| 19.012792136111084 | -0.235 | 0.523 | 0.425 |
| 19.01959666138889 | -0.244 | 0.522 | 0.448 |
| 19.02643174388889 | -0.239 | 0.523 | 0.417 |
| 19.033220994999976 | -0.256 | 0.525 | 0.435 |
| 19.04007136805553 | -0.265 | 0.516 | 0.435 |
| 19.046799507222197 | -0.257 | 0.507 | 0.435 |
| 19.05366513527778 | -0.269 | 0.496 | 0.453 |
| 19.06036411972222 | -0.271 | 0.508 | 0.437 |
| 19.067168660555556 | -0.274 | 0.511 | 0.419 |
| 19.07398846638889 | -0.277 | 0.478 | 0.437 |
| 19.080762433611085 | -0.279 | 0.496 | 0.417 |
| 19.08758224611111 | -0.259 | 0.493 | 0.412 |
| 19.09435621472222 | -0.277 | 0.478 | 0.417 |
| 19.101252406944443 | -0.277 | 0.485 | 0.412 |
| 19.10798057222222 | -0.266 | 0.498 | 0.419 |
| 19.11475454027778 | -0.287 | 0.496 | 0.414 |
| 19.121529915833307 | -0.277 | 0.483 | 0.409 |
| 19.12833442555553 | -0.282 | 0.48 | 0.388 |
| 19.135169505 | -0.271 | 0.478 | 0.386 |
| 19.141943479166667 | -0.287 | 0.485 | 0.396 |
| 19.148732735 | -0.264 | 0.472 | 0.414 |
| 19.155583095833332 | -0.274 | 0.462 | 0.391 |
| 19.16244878527778 | -0.287 | 0.467 | 0.378 |
| 19.169222696111085 | -0.308 | 0.465 | 0.412 |
| 19.17595084888889 | -0.295 | 0.459 | 0.409 |
| 19.182740100277776 | -0.297 | 0.48 | 0.388 |
| 19.189559913888864 | -0.305 | 0.454 | 0.409 |
| 19.19636582361111 | -0.297 | 0.452 | 0.386 |
| 19.20313980888889 | -0.3 | 0.462 | 0.381 |
| 19.20991380027778 | -0.3 | 0.465 | 0.378 |
| 19.21671832638889 | -0.302 | 0.459 | 0.37 |
| 19.22353811638889 | -0.316 | 0.464 | 0.394 |
| 19.230312090555554 | -0.263 | 0.494 | 0.41 |
| 19.237101346666666 | -0.263 | 0.489 | 0.405 |
| 19.243905875833335 | -0.237 | 0.504 | 0.405 |
| 19.25067992138889 | -0.25 | 0.494 | 0.4 |
| 19.257501049444443 | -0.253 | 0.514 | 0.415 |
| 19.26433613027778 | -0.247 | 0.516 | 0.423 |
| 19.27112537888889 | -0.247 | 0.519 | 0.421 |
| 19.277838254444443 | -0.234 | 0.506 | 0.413 |
| 19.284719159722222 | -0.257 | 0.511 | 0.428 |
| 19.29149316333333 | -0.252 | 0.519 | 0.41 |
| 19.298267137777778 | -0.226 | 0.493 | 0.431 |
| 19.305071644444446 | -0.239 | 0.501 | 0.415 |
| 19.311906731944443 | -0.249 | 0.506 | 0.413 |
| 19.318680702222224 | -0.241 | 0.478 | 0.405 |
| 19.325471349999997 | -0.256 | 0.506 | 0.423 |
| 19.332306433611112 | -0.252 | 0.483 | 0.405 |
| 19.33908040388886 | -0.265 | 0.494 | 0.408 |
| 19.345930763055556 | -0.244 | 0.471 | 0.405 |
| 19.352704750555557 | -0.258 | 0.492 | 0.403 |
| 19.35943288694442 | -0.246 | 0.483 | 0.403 |
| 19.366252701666667 | -0.281 | 0.471 | 0.395 |
| 19.37305722416667 | -0.278 | 0.471 | 0.384 |
| 19.379846475 | -0.278 | 0.468 | 0.405 |
| 19.386650996666667 | -0.283 | 0.476 | 0.403 |
| 19.393455525833335 | -0.286 | 0.448 | 0.382 |
| 19.400261453333332 | -0.275 | 0.466 | 0.395 |
| 19.407096527499974 | -0.283 | 0.461 | 0.377 |
| 19.413870516944442 | -0.301 | 0.445 | 0.379 |
| 19.420659763055554 | -0.291 | 0.44 | 0.369 |
| 19.427510118055554 | -0.288 | 0.443 | 0.359 |
| 19.43425356722222 | -0.306 | 0.445 | 0.351 |
| 19.44101225416667 | -0.299 | 0.432 | 0.366 |
| 19.44778624416664 | -0.312 | 0.437 | 0.359 |
| 19.454667127499974 | -0.314 | 0.437 | 0.361 |
| 19.461441111944445 | -0.293 | 0.448 | 0.359 |
| 19.468216474722198 | -0.277 | 0.452 | 0.377 |
| 19.47499047166667 | -0.27 | 0.465 | 0.398 |
| 19.48179497611111 | -0.266 | 0.466 | 0.372 |
| 19.488630068611112 | -0.244 | 0.499 | 0.419 |
| 19.495404032499973 | -0.215 | 0.507 | 0.411 |
| 19.50217803472222 | -0.216 | 0.497 | 0.385 |
| 19.509028394444442 | -0.202 | 0.502 | 0.409 |
| 19.515817632222223 | -0.191 | 0.505 | 0.414 |
| 19.522683253055554 | -0.207 | 0.502 | 0.398 |
| 19.529457245555555 | -0.194 | 0.497 | 0.37 |
| 19.53618677888889 | -0.176 | 0.494 | 0.383 |
| 19.542960764166665 | -0.199 | 0.502 | 0.386 |
| 19.54982638166664 | -0.202 | 0.484 | 0.378 |
| 19.55652398361111 | -0.217 | 0.481 | 0.368 |
| 19.563450732499998 | -0.207 | 0.499 | 0.37 |
| 19.57017887166664 | -0.217 | 0.492 | 0.368 |
| 19.576952846388888 | -0.194 | 0.489 | 0.355 |
| 19.583772656388888 | -0.215 | 0.477 | 0.368 |
| 19.590546633888888 | -0.246 | 0.464 | 0.334 |
| 19.59735254611111 | -0.232 | 0.481 | 0.362 |
| 19.60420290388889 | -0.241 | 0.464 | 0.355 |
| 19.610976879444443 | -0.228 | 0.459 | 0.344 |
| 19.617766133611084 | -0.246 | 0.446 | 0.355 |
| 19.62454010916664 | -0.238 | 0.475 | 0.331 |
| 19.63134465222222 | -0.264 | 0.457 | 0.347 |
| 19.638149176666666 | -0.261 | 0.457 | 0.344 |
| 19.64498425027775 | -0.249 | 0.456 | 0.365 |
| 19.65175823416664 | -0.197 | 0.503 | 0.397 |
| 19.658562748888887 | -0.172 | 0.539 | 0.394 |
| 19.665307591388864 | -0.185 | 0.513 | 0.4 |
| 19.67211212277778 | -0.185 | 0.531 | 0.392 |
| 19.67894718638889 | -0.185 | 0.506 | 0.379 |
| 19.685705914166668 | -0.198 | 0.501 | 0.407 |
| 19.69249513833333 | -0.211 | 0.485 | 0.379 |
| 19.699269167222194 | -0.195 | 0.475 | 0.376 |
| 19.706150026388887 | -0.226 | 0.485 | 0.374 |
| 19.712954548611112 | -0.213 | 0.482 | 0.364 |
| 19.71969809 | -0.219 | 0.47 | 0.356 |
| 19.7265330575 | -0.215 | 0.482 | 0.376 |
| 19.73342923972222 | -0.227 | 0.441 | 0.351 |
| 19.74012822972222 | -0.239 | 0.448 | 0.377 |
| 19.74690221388889 | -0.236 | 0.475 | 0.374 |
| 19.753737281944417 | -0.193 | 0.509 | 0.401 |
| 19.760511260277777 | -0.166 | 0.53 | 0.411 |
| 19.767331084444447 | -0.184 | 0.509 | 0.406 |
| 19.774105049999974 | -0.192 | 0.507 | 0.396 |
| 19.780924848333306 | -0.184 | 0.486 | 0.396 |
| 19.787668280833334 | -0.199 | 0.486 | 0.406 |
| 19.794503354444444 | -0.199 | 0.473 | 0.411 |
| 19.801307883333333 | -0.202 | 0.481 | 0.388 |
| 19.808083257777778 | -0.233 | 0.458 | 0.38 |
| 19.814918330277777 | -0.202 | 0.481 | 0.362 |
| 19.82170758416664 | -0.22 | 0.464 | 0.372 |
| 19.82851211138889 | -0.147 | 0.517 | 0.417 |
| 19.83528609805553 | -0.156 | 0.504 | 0.436 |
| 19.842075339444417 | -0.183 | 0.508 | 0.415 |
| 19.84884932222222 | -0.172 | 0.505 | 0.402 |
| 19.85565385333331 | -0.165 | 0.523 | 0.402 |
| 19.862427829999998 | -0.178 | 0.511 | 0.399 |
| 19.869232359444442 | -0.167 | 0.505 | 0.381 |
| 19.876068825277777 | -0.178 | 0.487 | 0.384 |
| 19.88287335611111 | -0.183 | 0.518 | 0.381 |
| 19.889662609166667 | -0.185 | 0.508 | 0.361 |
| 19.896436596388888 | -0.198 | 0.5 | 0.368 |
| 19.903210572777777 | -0.176 | 0.517 | 0.361 |
| 19.91001510111111 | -0.112 | 0.557 | 0.419 |
| 19.916865447777777 | -0.148 | 0.55 | 0.413 |
| 19.9236547075 | -0.138 | 0.517 | 0.401 |
| 19.930459232499974 | -0.174 | 0.519 | 0.393 |
| 19.937233222499998 | -0.156 | 0.504 | 0.403 |
| 19.94402386638889 | -0.174 | 0.496 | 0.393 |
| 19.950858930555555 | -0.202 | 0.496 | 0.39 |
| 19.95764818916664 | -0.187 | 0.496 | 0.377 |
| 19.964452720833332 | -0.135 | 0.548 | 0.427 |
| 19.971180873888887 | -0.112 | 0.565 | 0.433 |
| 19.97800066416664 | -0.134 | 0.541 | 0.433 |
| 19.984835747777776 | -0.155 | 0.533 | 0.438 |
| 19.991640280555558 | -0.149 | 0.536 | 0.412 |
| 19.998414272777776 | -0.18 | 0.526 | 0.407 |
| 20.00518822861111 | -0.157 | 0.551 | 0.384 |
| 20.01197888277778 | -0.18 | 0.526 | 0.402 |
| 20.018783414166666 | -0.115 | 0.565 | 0.428 |
| 20.025633756944444 | -0.095 | 0.589 | 0.442 |
| 20.032407737499973 | -0.098 | 0.581 | 0.437 |
| 20.039196999444417 | -0.122 | 0.571 | 0.431 |
| 20.045970981666667 | -0.164 | 0.542 | 0.449 |
| 20.052790779722194 | -0.141 | 0.537 | 0.413 |
| 20.059595307777776 | -0.148 | 0.527 | 0.408 |
| 20.066384555555555 | -0.098 | 0.592 | 0.466 |
| 20.073158537777775 | -0.078 | 0.603 | 0.479 |
| 20.079995001388887 | -0.076 | 0.603 | 0.466 |
| 20.086799532777754 | -0.078 | 0.603 | 0.451 |
| 20.093573533333334 | -0.107 | 0.594 | 0.433 |
| 20.1003474925 | -0.15 | 0.549 | 0.445 |
| 20.107167300833332 | -0.15 | 0.554 | 0.44 |
| 20.11392599361111 | -0.12 | 0.584 | 0.417 |
| 20.1207610775 | -0.057 | 0.625 | 0.488 |
| 20.12750450361111 | -0.069 | 0.625 | 0.472 |
| 20.134370137777776 | -0.049 | 0.617 | 0.454 |
| 20.14117468 | -0.072 | 0.594 | 0.465 |
| 20.147950030555556 | -0.093 | 0.567 | 0.447 |
| 20.15473928666667 | -0.12 | 0.55 | 0.457 |
| 20.16151326805553 | -0.106 | 0.564 | 0.424 |